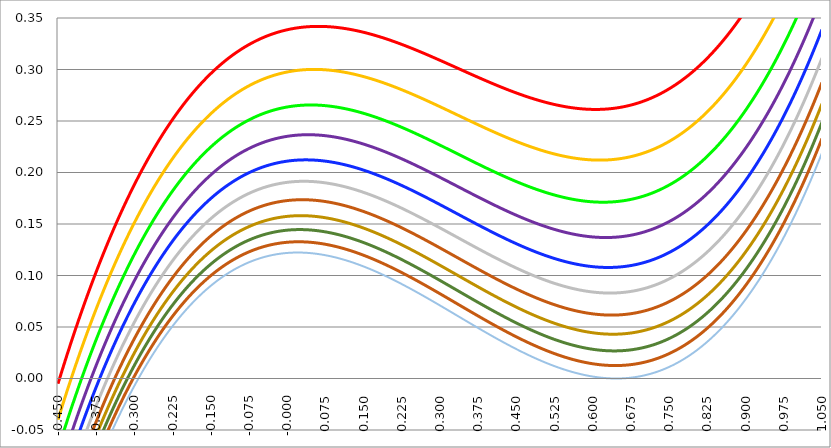
| Category | Series 1 | Series 0 | Series 3 | Series 4 | Series 5 | Series 2 | Series 6 | Series 7 | Series 8 | Series 9 | Series 10 |
|---|---|---|---|---|---|---|---|---|---|---|---|
| -0.45 | -0.005 | -0.04 | -0.069 | -0.093 | -0.114 | -0.131 | -0.146 | -0.159 | -0.171 | -0.181 | -0.19 |
| -0.44925 | -0.004 | -0.039 | -0.068 | -0.092 | -0.113 | -0.13 | -0.145 | -0.158 | -0.17 | -0.18 | -0.189 |
| -0.4485 | -0.003 | -0.038 | -0.067 | -0.091 | -0.111 | -0.129 | -0.144 | -0.157 | -0.169 | -0.179 | -0.187 |
| -0.44775 | -0.001 | -0.036 | -0.065 | -0.09 | -0.11 | -0.128 | -0.143 | -0.156 | -0.167 | -0.177 | -0.186 |
| -0.447 | 0 | -0.035 | -0.064 | -0.088 | -0.109 | -0.127 | -0.142 | -0.155 | -0.166 | -0.176 | -0.185 |
| -0.44625 | 0.001 | -0.034 | -0.063 | -0.087 | -0.108 | -0.125 | -0.141 | -0.154 | -0.165 | -0.175 | -0.184 |
| -0.4455 | 0.002 | -0.033 | -0.062 | -0.086 | -0.107 | -0.124 | -0.139 | -0.153 | -0.164 | -0.174 | -0.183 |
| -0.44475 | 0.003 | -0.032 | -0.061 | -0.085 | -0.106 | -0.123 | -0.138 | -0.151 | -0.163 | -0.173 | -0.182 |
| -0.444 | 0.005 | -0.03 | -0.059 | -0.084 | -0.104 | -0.122 | -0.137 | -0.15 | -0.162 | -0.172 | -0.181 |
| -0.44325 | 0.006 | -0.029 | -0.058 | -0.083 | -0.103 | -0.121 | -0.136 | -0.149 | -0.16 | -0.171 | -0.179 |
| -0.4425 | 0.007 | -0.028 | -0.057 | -0.081 | -0.102 | -0.12 | -0.135 | -0.148 | -0.159 | -0.169 | -0.178 |
| -0.44175 | 0.008 | -0.027 | -0.056 | -0.08 | -0.101 | -0.119 | -0.134 | -0.147 | -0.158 | -0.168 | -0.177 |
| -0.441 | 0.009 | -0.026 | -0.055 | -0.079 | -0.1 | -0.117 | -0.133 | -0.146 | -0.157 | -0.167 | -0.176 |
| -0.44025 | 0.011 | -0.025 | -0.054 | -0.078 | -0.099 | -0.116 | -0.131 | -0.144 | -0.156 | -0.166 | -0.175 |
| -0.4395 | 0.012 | -0.023 | -0.052 | -0.077 | -0.097 | -0.115 | -0.13 | -0.143 | -0.155 | -0.165 | -0.174 |
| -0.43875 | 0.013 | -0.022 | -0.051 | -0.076 | -0.096 | -0.114 | -0.129 | -0.142 | -0.154 | -0.164 | -0.173 |
| -0.438 | 0.014 | -0.021 | -0.05 | -0.075 | -0.095 | -0.113 | -0.128 | -0.141 | -0.153 | -0.163 | -0.172 |
| -0.43725 | 0.015 | -0.02 | -0.049 | -0.073 | -0.094 | -0.112 | -0.127 | -0.14 | -0.151 | -0.162 | -0.17 |
| -0.4365 | 0.016 | -0.019 | -0.048 | -0.072 | -0.093 | -0.111 | -0.126 | -0.139 | -0.15 | -0.16 | -0.169 |
| -0.43575 | 0.018 | -0.018 | -0.047 | -0.071 | -0.092 | -0.109 | -0.125 | -0.138 | -0.149 | -0.159 | -0.168 |
| -0.435000000000001 | 0.019 | -0.016 | -0.046 | -0.07 | -0.091 | -0.108 | -0.123 | -0.137 | -0.148 | -0.158 | -0.167 |
| -0.434250000000001 | 0.02 | -0.015 | -0.044 | -0.069 | -0.09 | -0.107 | -0.122 | -0.135 | -0.147 | -0.157 | -0.166 |
| -0.433500000000001 | 0.021 | -0.014 | -0.043 | -0.068 | -0.088 | -0.106 | -0.121 | -0.134 | -0.146 | -0.156 | -0.165 |
| -0.432750000000001 | 0.022 | -0.013 | -0.042 | -0.067 | -0.087 | -0.105 | -0.12 | -0.133 | -0.145 | -0.155 | -0.164 |
| -0.432000000000001 | 0.023 | -0.012 | -0.041 | -0.065 | -0.086 | -0.104 | -0.119 | -0.132 | -0.144 | -0.154 | -0.163 |
| -0.431250000000001 | 0.024 | -0.011 | -0.04 | -0.064 | -0.085 | -0.103 | -0.118 | -0.131 | -0.143 | -0.153 | -0.162 |
| -0.430500000000001 | 0.026 | -0.01 | -0.039 | -0.063 | -0.084 | -0.102 | -0.117 | -0.13 | -0.141 | -0.152 | -0.16 |
| -0.429750000000001 | 0.027 | -0.008 | -0.038 | -0.062 | -0.083 | -0.1 | -0.116 | -0.129 | -0.14 | -0.15 | -0.159 |
| -0.429000000000001 | 0.028 | -0.007 | -0.037 | -0.061 | -0.082 | -0.099 | -0.115 | -0.128 | -0.139 | -0.149 | -0.158 |
| -0.428250000000001 | 0.029 | -0.006 | -0.035 | -0.06 | -0.081 | -0.098 | -0.113 | -0.127 | -0.138 | -0.148 | -0.157 |
| -0.427500000000001 | 0.03 | -0.005 | -0.034 | -0.059 | -0.079 | -0.097 | -0.112 | -0.126 | -0.137 | -0.147 | -0.156 |
| -0.426750000000001 | 0.031 | -0.004 | -0.033 | -0.058 | -0.078 | -0.096 | -0.111 | -0.124 | -0.136 | -0.146 | -0.155 |
| -0.426000000000001 | 0.032 | -0.003 | -0.032 | -0.057 | -0.077 | -0.095 | -0.11 | -0.123 | -0.135 | -0.145 | -0.154 |
| -0.425250000000001 | 0.034 | -0.002 | -0.031 | -0.055 | -0.076 | -0.094 | -0.109 | -0.122 | -0.134 | -0.144 | -0.153 |
| -0.424500000000001 | 0.035 | -0.001 | -0.03 | -0.054 | -0.075 | -0.093 | -0.108 | -0.121 | -0.133 | -0.143 | -0.152 |
| -0.423750000000001 | 0.036 | 0.001 | -0.029 | -0.053 | -0.074 | -0.092 | -0.107 | -0.12 | -0.132 | -0.142 | -0.151 |
| -0.423000000000001 | 0.037 | 0.002 | -0.028 | -0.052 | -0.073 | -0.091 | -0.106 | -0.119 | -0.131 | -0.141 | -0.15 |
| -0.422250000000001 | 0.038 | 0.003 | -0.027 | -0.051 | -0.072 | -0.09 | -0.105 | -0.118 | -0.13 | -0.14 | -0.149 |
| -0.421500000000001 | 0.039 | 0.004 | -0.025 | -0.05 | -0.071 | -0.088 | -0.104 | -0.117 | -0.128 | -0.139 | -0.148 |
| -0.420750000000001 | 0.04 | 0.005 | -0.024 | -0.049 | -0.07 | -0.087 | -0.103 | -0.116 | -0.127 | -0.138 | -0.146 |
| -0.420000000000001 | 0.041 | 0.006 | -0.023 | -0.048 | -0.069 | -0.086 | -0.102 | -0.115 | -0.126 | -0.136 | -0.145 |
| -0.419250000000001 | 0.043 | 0.007 | -0.022 | -0.047 | -0.067 | -0.085 | -0.1 | -0.114 | -0.125 | -0.135 | -0.144 |
| -0.418500000000001 | 0.044 | 0.008 | -0.021 | -0.046 | -0.066 | -0.084 | -0.099 | -0.113 | -0.124 | -0.134 | -0.143 |
| -0.417750000000001 | 0.045 | 0.009 | -0.02 | -0.045 | -0.065 | -0.083 | -0.098 | -0.112 | -0.123 | -0.133 | -0.142 |
| -0.417000000000001 | 0.046 | 0.01 | -0.019 | -0.043 | -0.064 | -0.082 | -0.097 | -0.111 | -0.122 | -0.132 | -0.141 |
| -0.416250000000001 | 0.047 | 0.012 | -0.018 | -0.042 | -0.063 | -0.081 | -0.096 | -0.109 | -0.121 | -0.131 | -0.14 |
| -0.415500000000001 | 0.048 | 0.013 | -0.017 | -0.041 | -0.062 | -0.08 | -0.095 | -0.108 | -0.12 | -0.13 | -0.139 |
| -0.414750000000001 | 0.049 | 0.014 | -0.016 | -0.04 | -0.061 | -0.079 | -0.094 | -0.107 | -0.119 | -0.129 | -0.138 |
| -0.414000000000001 | 0.05 | 0.015 | -0.015 | -0.039 | -0.06 | -0.078 | -0.093 | -0.106 | -0.118 | -0.128 | -0.137 |
| -0.413250000000001 | 0.051 | 0.016 | -0.013 | -0.038 | -0.059 | -0.077 | -0.092 | -0.105 | -0.117 | -0.127 | -0.136 |
| -0.412500000000001 | 0.052 | 0.017 | -0.012 | -0.037 | -0.058 | -0.076 | -0.091 | -0.104 | -0.116 | -0.126 | -0.135 |
| -0.411750000000001 | 0.053 | 0.018 | -0.011 | -0.036 | -0.057 | -0.075 | -0.09 | -0.103 | -0.115 | -0.125 | -0.134 |
| -0.411000000000001 | 0.055 | 0.019 | -0.01 | -0.035 | -0.056 | -0.074 | -0.089 | -0.102 | -0.114 | -0.124 | -0.133 |
| -0.410250000000001 | 0.056 | 0.02 | -0.009 | -0.034 | -0.055 | -0.073 | -0.088 | -0.101 | -0.113 | -0.123 | -0.132 |
| -0.409500000000001 | 0.057 | 0.021 | -0.008 | -0.033 | -0.054 | -0.072 | -0.087 | -0.1 | -0.112 | -0.122 | -0.131 |
| -0.408750000000001 | 0.058 | 0.022 | -0.007 | -0.032 | -0.053 | -0.07 | -0.086 | -0.099 | -0.111 | -0.121 | -0.13 |
| -0.408000000000002 | 0.059 | 0.023 | -0.006 | -0.031 | -0.052 | -0.069 | -0.085 | -0.098 | -0.11 | -0.12 | -0.129 |
| -0.407250000000002 | 0.06 | 0.024 | -0.005 | -0.03 | -0.051 | -0.068 | -0.084 | -0.097 | -0.109 | -0.119 | -0.128 |
| -0.406500000000002 | 0.061 | 0.025 | -0.004 | -0.029 | -0.05 | -0.067 | -0.083 | -0.096 | -0.108 | -0.118 | -0.127 |
| -0.405750000000002 | 0.062 | 0.027 | -0.003 | -0.028 | -0.049 | -0.066 | -0.082 | -0.095 | -0.107 | -0.117 | -0.126 |
| -0.405000000000002 | 0.063 | 0.028 | -0.002 | -0.027 | -0.047 | -0.065 | -0.081 | -0.094 | -0.106 | -0.116 | -0.125 |
| -0.404250000000002 | 0.064 | 0.029 | -0.001 | -0.026 | -0.046 | -0.064 | -0.08 | -0.093 | -0.105 | -0.115 | -0.124 |
| -0.403500000000002 | 0.065 | 0.03 | 0 | -0.025 | -0.045 | -0.063 | -0.079 | -0.092 | -0.104 | -0.114 | -0.123 |
| -0.402750000000002 | 0.066 | 0.031 | 0.001 | -0.023 | -0.044 | -0.062 | -0.078 | -0.091 | -0.103 | -0.113 | -0.122 |
| -0.402000000000002 | 0.067 | 0.032 | 0.002 | -0.022 | -0.043 | -0.061 | -0.077 | -0.09 | -0.102 | -0.112 | -0.121 |
| -0.401250000000002 | 0.068 | 0.033 | 0.003 | -0.021 | -0.042 | -0.06 | -0.076 | -0.089 | -0.101 | -0.111 | -0.12 |
| -0.400500000000002 | 0.069 | 0.034 | 0.004 | -0.02 | -0.041 | -0.059 | -0.075 | -0.088 | -0.1 | -0.11 | -0.119 |
| -0.399750000000002 | 0.07 | 0.035 | 0.005 | -0.019 | -0.04 | -0.058 | -0.074 | -0.087 | -0.099 | -0.109 | -0.118 |
| -0.399000000000002 | 0.072 | 0.036 | 0.006 | -0.018 | -0.039 | -0.057 | -0.073 | -0.086 | -0.098 | -0.108 | -0.117 |
| -0.398250000000002 | 0.073 | 0.037 | 0.007 | -0.017 | -0.038 | -0.056 | -0.072 | -0.085 | -0.097 | -0.107 | -0.116 |
| -0.397500000000002 | 0.074 | 0.038 | 0.008 | -0.016 | -0.037 | -0.055 | -0.071 | -0.084 | -0.096 | -0.106 | -0.115 |
| -0.396750000000002 | 0.075 | 0.039 | 0.009 | -0.015 | -0.036 | -0.054 | -0.07 | -0.083 | -0.095 | -0.105 | -0.114 |
| -0.396000000000002 | 0.076 | 0.04 | 0.01 | -0.014 | -0.035 | -0.053 | -0.069 | -0.082 | -0.094 | -0.104 | -0.113 |
| -0.395250000000002 | 0.077 | 0.041 | 0.011 | -0.013 | -0.034 | -0.052 | -0.068 | -0.081 | -0.093 | -0.103 | -0.112 |
| -0.394500000000002 | 0.078 | 0.042 | 0.012 | -0.012 | -0.033 | -0.051 | -0.067 | -0.08 | -0.092 | -0.102 | -0.111 |
| -0.393750000000002 | 0.079 | 0.043 | 0.013 | -0.011 | -0.032 | -0.05 | -0.066 | -0.079 | -0.091 | -0.101 | -0.11 |
| -0.393000000000002 | 0.08 | 0.044 | 0.014 | -0.01 | -0.031 | -0.049 | -0.065 | -0.078 | -0.09 | -0.1 | -0.109 |
| -0.392250000000002 | 0.081 | 0.045 | 0.015 | -0.009 | -0.03 | -0.048 | -0.064 | -0.077 | -0.089 | -0.099 | -0.108 |
| -0.391500000000002 | 0.082 | 0.046 | 0.016 | -0.008 | -0.029 | -0.047 | -0.063 | -0.076 | -0.088 | -0.098 | -0.107 |
| -0.390750000000002 | 0.083 | 0.047 | 0.017 | -0.007 | -0.028 | -0.046 | -0.062 | -0.075 | -0.087 | -0.097 | -0.106 |
| -0.390000000000002 | 0.084 | 0.048 | 0.018 | -0.006 | -0.027 | -0.045 | -0.061 | -0.074 | -0.086 | -0.096 | -0.105 |
| -0.389250000000002 | 0.085 | 0.049 | 0.019 | -0.005 | -0.026 | -0.044 | -0.06 | -0.073 | -0.085 | -0.095 | -0.104 |
| -0.388500000000002 | 0.086 | 0.05 | 0.02 | -0.004 | -0.025 | -0.043 | -0.059 | -0.072 | -0.084 | -0.094 | -0.103 |
| -0.387750000000002 | 0.087 | 0.051 | 0.021 | -0.003 | -0.024 | -0.042 | -0.058 | -0.071 | -0.083 | -0.093 | -0.102 |
| -0.387000000000002 | 0.088 | 0.052 | 0.022 | -0.002 | -0.024 | -0.041 | -0.057 | -0.07 | -0.082 | -0.092 | -0.101 |
| -0.386250000000002 | 0.089 | 0.053 | 0.023 | -0.001 | -0.023 | -0.041 | -0.056 | -0.069 | -0.081 | -0.091 | -0.1 |
| -0.385500000000002 | 0.09 | 0.054 | 0.024 | -0.001 | -0.022 | -0.04 | -0.055 | -0.068 | -0.08 | -0.09 | -0.099 |
| -0.384750000000002 | 0.091 | 0.055 | 0.025 | 0 | -0.021 | -0.039 | -0.054 | -0.067 | -0.079 | -0.089 | -0.098 |
| -0.384000000000002 | 0.092 | 0.056 | 0.026 | 0.001 | -0.02 | -0.038 | -0.053 | -0.067 | -0.078 | -0.088 | -0.098 |
| -0.383250000000002 | 0.093 | 0.057 | 0.027 | 0.002 | -0.019 | -0.037 | -0.052 | -0.066 | -0.077 | -0.088 | -0.097 |
| -0.382500000000002 | 0.094 | 0.058 | 0.028 | 0.003 | -0.018 | -0.036 | -0.051 | -0.065 | -0.076 | -0.087 | -0.096 |
| -0.381750000000002 | 0.095 | 0.059 | 0.029 | 0.004 | -0.017 | -0.035 | -0.05 | -0.064 | -0.075 | -0.086 | -0.095 |
| -0.381000000000002 | 0.096 | 0.06 | 0.03 | 0.005 | -0.016 | -0.034 | -0.049 | -0.063 | -0.074 | -0.085 | -0.094 |
| -0.380250000000002 | 0.097 | 0.061 | 0.031 | 0.006 | -0.015 | -0.033 | -0.048 | -0.062 | -0.074 | -0.084 | -0.093 |
| -0.379500000000003 | 0.098 | 0.062 | 0.032 | 0.007 | -0.014 | -0.032 | -0.047 | -0.061 | -0.073 | -0.083 | -0.092 |
| -0.378750000000003 | 0.099 | 0.063 | 0.033 | 0.008 | -0.013 | -0.031 | -0.047 | -0.06 | -0.072 | -0.082 | -0.091 |
| -0.378000000000003 | 0.1 | 0.064 | 0.034 | 0.009 | -0.012 | -0.03 | -0.046 | -0.059 | -0.071 | -0.081 | -0.09 |
| -0.377250000000003 | 0.101 | 0.065 | 0.035 | 0.01 | -0.011 | -0.029 | -0.045 | -0.058 | -0.07 | -0.08 | -0.089 |
| -0.376500000000003 | 0.102 | 0.066 | 0.036 | 0.011 | -0.01 | -0.028 | -0.044 | -0.057 | -0.069 | -0.079 | -0.088 |
| -0.375750000000003 | 0.103 | 0.067 | 0.037 | 0.012 | -0.009 | -0.027 | -0.043 | -0.056 | -0.068 | -0.078 | -0.087 |
| -0.375000000000003 | 0.104 | 0.068 | 0.038 | 0.013 | -0.008 | -0.026 | -0.042 | -0.055 | -0.067 | -0.077 | -0.086 |
| -0.374250000000003 | 0.105 | 0.069 | 0.039 | 0.014 | -0.007 | -0.025 | -0.041 | -0.054 | -0.066 | -0.076 | -0.086 |
| -0.373500000000003 | 0.105 | 0.07 | 0.04 | 0.015 | -0.006 | -0.024 | -0.04 | -0.053 | -0.065 | -0.076 | -0.085 |
| -0.372750000000003 | 0.106 | 0.07 | 0.041 | 0.016 | -0.006 | -0.024 | -0.039 | -0.053 | -0.064 | -0.075 | -0.084 |
| -0.372000000000003 | 0.107 | 0.071 | 0.042 | 0.017 | -0.005 | -0.023 | -0.038 | -0.052 | -0.063 | -0.074 | -0.083 |
| -0.371250000000003 | 0.108 | 0.072 | 0.042 | 0.017 | -0.004 | -0.022 | -0.037 | -0.051 | -0.063 | -0.073 | -0.082 |
| -0.370500000000003 | 0.109 | 0.073 | 0.043 | 0.018 | -0.003 | -0.021 | -0.036 | -0.05 | -0.062 | -0.072 | -0.081 |
| -0.369750000000003 | 0.11 | 0.074 | 0.044 | 0.019 | -0.002 | -0.02 | -0.035 | -0.049 | -0.061 | -0.071 | -0.08 |
| -0.369000000000003 | 0.111 | 0.075 | 0.045 | 0.02 | -0.001 | -0.019 | -0.035 | -0.048 | -0.06 | -0.07 | -0.079 |
| -0.368250000000003 | 0.112 | 0.076 | 0.046 | 0.021 | 0 | -0.018 | -0.034 | -0.047 | -0.059 | -0.069 | -0.078 |
| -0.367500000000003 | 0.113 | 0.077 | 0.047 | 0.022 | 0.001 | -0.017 | -0.033 | -0.046 | -0.058 | -0.068 | -0.077 |
| -0.366750000000003 | 0.114 | 0.078 | 0.048 | 0.023 | 0.002 | -0.016 | -0.032 | -0.045 | -0.057 | -0.067 | -0.077 |
| -0.366000000000003 | 0.115 | 0.079 | 0.049 | 0.024 | 0.003 | -0.015 | -0.031 | -0.044 | -0.056 | -0.067 | -0.076 |
| -0.365250000000003 | 0.116 | 0.08 | 0.05 | 0.025 | 0.004 | -0.015 | -0.03 | -0.044 | -0.055 | -0.066 | -0.075 |
| -0.364500000000003 | 0.117 | 0.081 | 0.051 | 0.026 | 0.004 | -0.014 | -0.029 | -0.043 | -0.055 | -0.065 | -0.074 |
| -0.363750000000003 | 0.118 | 0.082 | 0.052 | 0.027 | 0.005 | -0.013 | -0.028 | -0.042 | -0.054 | -0.064 | -0.073 |
| -0.363000000000003 | 0.119 | 0.083 | 0.053 | 0.028 | 0.006 | -0.012 | -0.027 | -0.041 | -0.053 | -0.063 | -0.072 |
| -0.362250000000003 | 0.12 | 0.083 | 0.054 | 0.028 | 0.007 | -0.011 | -0.027 | -0.04 | -0.052 | -0.062 | -0.071 |
| -0.361500000000003 | 0.12 | 0.084 | 0.054 | 0.029 | 0.008 | -0.01 | -0.026 | -0.039 | -0.051 | -0.061 | -0.07 |
| -0.360750000000003 | 0.121 | 0.085 | 0.055 | 0.03 | 0.009 | -0.009 | -0.025 | -0.038 | -0.05 | -0.06 | -0.07 |
| -0.360000000000003 | 0.122 | 0.086 | 0.056 | 0.031 | 0.01 | -0.008 | -0.024 | -0.037 | -0.049 | -0.06 | -0.069 |
| -0.359250000000003 | 0.123 | 0.087 | 0.057 | 0.032 | 0.011 | -0.007 | -0.023 | -0.037 | -0.048 | -0.059 | -0.068 |
| -0.358500000000003 | 0.124 | 0.088 | 0.058 | 0.033 | 0.012 | -0.007 | -0.022 | -0.036 | -0.048 | -0.058 | -0.067 |
| -0.357750000000003 | 0.125 | 0.089 | 0.059 | 0.034 | 0.012 | -0.006 | -0.021 | -0.035 | -0.047 | -0.057 | -0.066 |
| -0.357000000000003 | 0.126 | 0.09 | 0.06 | 0.035 | 0.013 | -0.005 | -0.02 | -0.034 | -0.046 | -0.056 | -0.065 |
| -0.356250000000003 | 0.127 | 0.091 | 0.061 | 0.036 | 0.014 | -0.004 | -0.02 | -0.033 | -0.045 | -0.055 | -0.064 |
| -0.355500000000003 | 0.128 | 0.092 | 0.062 | 0.036 | 0.015 | -0.003 | -0.019 | -0.032 | -0.044 | -0.054 | -0.064 |
| -0.354750000000003 | 0.129 | 0.092 | 0.062 | 0.037 | 0.016 | -0.002 | -0.018 | -0.031 | -0.043 | -0.054 | -0.063 |
| -0.354000000000003 | 0.13 | 0.093 | 0.063 | 0.038 | 0.017 | -0.001 | -0.017 | -0.031 | -0.042 | -0.053 | -0.062 |
| -0.353250000000003 | 0.13 | 0.094 | 0.064 | 0.039 | 0.018 | 0 | -0.016 | -0.03 | -0.042 | -0.052 | -0.061 |
| -0.352500000000003 | 0.131 | 0.095 | 0.065 | 0.04 | 0.019 | 0 | -0.015 | -0.029 | -0.041 | -0.051 | -0.06 |
| -0.351750000000004 | 0.132 | 0.096 | 0.066 | 0.041 | 0.019 | 0.001 | -0.014 | -0.028 | -0.04 | -0.05 | -0.059 |
| -0.351000000000004 | 0.133 | 0.097 | 0.067 | 0.042 | 0.02 | 0.002 | -0.014 | -0.027 | -0.039 | -0.049 | -0.059 |
| -0.350250000000004 | 0.134 | 0.098 | 0.068 | 0.042 | 0.021 | 0.003 | -0.013 | -0.026 | -0.038 | -0.049 | -0.058 |
| -0.349500000000004 | 0.135 | 0.099 | 0.069 | 0.043 | 0.022 | 0.004 | -0.012 | -0.025 | -0.037 | -0.048 | -0.057 |
| -0.348750000000004 | 0.136 | 0.099 | 0.069 | 0.044 | 0.023 | 0.005 | -0.011 | -0.025 | -0.037 | -0.047 | -0.056 |
| -0.348000000000004 | 0.137 | 0.1 | 0.07 | 0.045 | 0.024 | 0.005 | -0.01 | -0.024 | -0.036 | -0.046 | -0.055 |
| -0.347250000000004 | 0.138 | 0.101 | 0.071 | 0.046 | 0.025 | 0.006 | -0.009 | -0.023 | -0.035 | -0.045 | -0.054 |
| -0.346500000000004 | 0.138 | 0.102 | 0.072 | 0.047 | 0.025 | 0.007 | -0.009 | -0.022 | -0.034 | -0.044 | -0.054 |
| -0.345750000000004 | 0.139 | 0.103 | 0.073 | 0.048 | 0.026 | 0.008 | -0.008 | -0.021 | -0.033 | -0.044 | -0.053 |
| -0.345000000000004 | 0.14 | 0.104 | 0.074 | 0.048 | 0.027 | 0.009 | -0.007 | -0.021 | -0.032 | -0.043 | -0.052 |
| -0.344250000000004 | 0.141 | 0.105 | 0.075 | 0.049 | 0.028 | 0.01 | -0.006 | -0.02 | -0.032 | -0.042 | -0.051 |
| -0.343500000000004 | 0.142 | 0.106 | 0.075 | 0.05 | 0.029 | 0.01 | -0.005 | -0.019 | -0.031 | -0.041 | -0.05 |
| -0.342750000000004 | 0.143 | 0.106 | 0.076 | 0.051 | 0.03 | 0.011 | -0.004 | -0.018 | -0.03 | -0.04 | -0.05 |
| -0.342000000000004 | 0.144 | 0.107 | 0.077 | 0.052 | 0.03 | 0.012 | -0.004 | -0.017 | -0.029 | -0.04 | -0.049 |
| -0.341250000000004 | 0.144 | 0.108 | 0.078 | 0.053 | 0.031 | 0.013 | -0.003 | -0.016 | -0.028 | -0.039 | -0.048 |
| -0.340500000000004 | 0.145 | 0.109 | 0.079 | 0.053 | 0.032 | 0.014 | -0.002 | -0.016 | -0.027 | -0.038 | -0.047 |
| -0.339750000000004 | 0.146 | 0.11 | 0.08 | 0.054 | 0.033 | 0.015 | -0.001 | -0.015 | -0.027 | -0.037 | -0.046 |
| -0.339000000000004 | 0.147 | 0.111 | 0.08 | 0.055 | 0.034 | 0.015 | 0 | -0.014 | -0.026 | -0.036 | -0.046 |
| -0.338250000000004 | 0.148 | 0.111 | 0.081 | 0.056 | 0.034 | 0.016 | 0 | -0.013 | -0.025 | -0.036 | -0.045 |
| -0.337500000000004 | 0.149 | 0.112 | 0.082 | 0.057 | 0.035 | 0.017 | 0.001 | -0.012 | -0.024 | -0.035 | -0.044 |
| -0.336750000000004 | 0.15 | 0.113 | 0.083 | 0.058 | 0.036 | 0.018 | 0.002 | -0.012 | -0.023 | -0.034 | -0.043 |
| -0.336000000000004 | 0.15 | 0.114 | 0.084 | 0.058 | 0.037 | 0.019 | 0.003 | -0.011 | -0.023 | -0.033 | -0.042 |
| -0.335250000000004 | 0.151 | 0.115 | 0.085 | 0.059 | 0.038 | 0.019 | 0.004 | -0.01 | -0.022 | -0.032 | -0.042 |
| -0.334500000000004 | 0.152 | 0.116 | 0.085 | 0.06 | 0.039 | 0.02 | 0.004 | -0.009 | -0.021 | -0.032 | -0.041 |
| -0.333750000000004 | 0.153 | 0.116 | 0.086 | 0.061 | 0.039 | 0.021 | 0.005 | -0.008 | -0.02 | -0.031 | -0.04 |
| -0.333000000000004 | 0.154 | 0.117 | 0.087 | 0.062 | 0.04 | 0.022 | 0.006 | -0.008 | -0.02 | -0.03 | -0.039 |
| -0.332250000000004 | 0.155 | 0.118 | 0.088 | 0.062 | 0.041 | 0.023 | 0.007 | -0.007 | -0.019 | -0.029 | -0.038 |
| -0.331500000000004 | 0.155 | 0.119 | 0.089 | 0.063 | 0.042 | 0.023 | 0.008 | -0.006 | -0.018 | -0.028 | -0.038 |
| -0.330750000000004 | 0.156 | 0.12 | 0.089 | 0.064 | 0.043 | 0.024 | 0.008 | -0.005 | -0.017 | -0.028 | -0.037 |
| -0.330000000000004 | 0.157 | 0.121 | 0.09 | 0.065 | 0.043 | 0.025 | 0.009 | -0.004 | -0.016 | -0.027 | -0.036 |
| -0.329250000000004 | 0.158 | 0.121 | 0.091 | 0.066 | 0.044 | 0.026 | 0.01 | -0.004 | -0.016 | -0.026 | -0.035 |
| -0.328500000000004 | 0.159 | 0.122 | 0.092 | 0.066 | 0.045 | 0.027 | 0.011 | -0.003 | -0.015 | -0.025 | -0.035 |
| -0.327750000000004 | 0.16 | 0.123 | 0.093 | 0.067 | 0.046 | 0.027 | 0.012 | -0.002 | -0.014 | -0.025 | -0.034 |
| -0.327000000000004 | 0.16 | 0.124 | 0.093 | 0.068 | 0.046 | 0.028 | 0.012 | -0.001 | -0.013 | -0.024 | -0.033 |
| -0.326250000000004 | 0.161 | 0.125 | 0.094 | 0.069 | 0.047 | 0.029 | 0.013 | -0.001 | -0.013 | -0.023 | -0.032 |
| -0.325500000000004 | 0.162 | 0.125 | 0.095 | 0.07 | 0.048 | 0.03 | 0.014 | 0 | -0.012 | -0.022 | -0.032 |
| -0.324750000000004 | 0.163 | 0.126 | 0.096 | 0.07 | 0.049 | 0.03 | 0.015 | 0.001 | -0.011 | -0.022 | -0.031 |
| -0.324000000000005 | 0.164 | 0.127 | 0.097 | 0.071 | 0.05 | 0.031 | 0.015 | 0.002 | -0.01 | -0.021 | -0.03 |
| -0.323250000000005 | 0.164 | 0.128 | 0.097 | 0.072 | 0.05 | 0.032 | 0.016 | 0.002 | -0.01 | -0.02 | -0.029 |
| -0.322500000000005 | 0.165 | 0.129 | 0.098 | 0.073 | 0.051 | 0.033 | 0.017 | 0.003 | -0.009 | -0.019 | -0.029 |
| -0.321750000000005 | 0.166 | 0.129 | 0.099 | 0.073 | 0.052 | 0.034 | 0.018 | 0.004 | -0.008 | -0.019 | -0.028 |
| -0.321000000000005 | 0.167 | 0.13 | 0.1 | 0.074 | 0.053 | 0.034 | 0.018 | 0.005 | -0.007 | -0.018 | -0.027 |
| -0.320250000000005 | 0.168 | 0.131 | 0.1 | 0.075 | 0.053 | 0.035 | 0.019 | 0.005 | -0.007 | -0.017 | -0.026 |
| -0.319500000000005 | 0.168 | 0.132 | 0.101 | 0.076 | 0.054 | 0.036 | 0.02 | 0.006 | -0.006 | -0.016 | -0.026 |
| -0.318750000000005 | 0.169 | 0.132 | 0.102 | 0.077 | 0.055 | 0.037 | 0.021 | 0.007 | -0.005 | -0.016 | -0.025 |
| -0.318000000000005 | 0.17 | 0.133 | 0.103 | 0.077 | 0.056 | 0.037 | 0.021 | 0.008 | -0.004 | -0.015 | -0.024 |
| -0.317250000000005 | 0.171 | 0.134 | 0.104 | 0.078 | 0.056 | 0.038 | 0.022 | 0.008 | -0.004 | -0.014 | -0.023 |
| -0.316500000000005 | 0.172 | 0.135 | 0.104 | 0.079 | 0.057 | 0.039 | 0.023 | 0.009 | -0.003 | -0.013 | -0.023 |
| -0.315750000000005 | 0.172 | 0.136 | 0.105 | 0.08 | 0.058 | 0.04 | 0.024 | 0.01 | -0.002 | -0.013 | -0.022 |
| -0.315000000000005 | 0.173 | 0.136 | 0.106 | 0.08 | 0.059 | 0.04 | 0.024 | 0.011 | -0.001 | -0.012 | -0.021 |
| -0.314250000000005 | 0.174 | 0.137 | 0.107 | 0.081 | 0.059 | 0.041 | 0.025 | 0.011 | -0.001 | -0.011 | -0.02 |
| -0.313500000000005 | 0.175 | 0.138 | 0.107 | 0.082 | 0.06 | 0.042 | 0.026 | 0.012 | 0 | -0.01 | -0.02 |
| -0.312750000000005 | 0.175 | 0.139 | 0.108 | 0.083 | 0.061 | 0.043 | 0.027 | 0.013 | 0.001 | -0.01 | -0.019 |
| -0.312000000000005 | 0.176 | 0.139 | 0.109 | 0.083 | 0.062 | 0.043 | 0.027 | 0.014 | 0.002 | -0.009 | -0.018 |
| -0.311250000000005 | 0.177 | 0.14 | 0.11 | 0.084 | 0.062 | 0.044 | 0.028 | 0.014 | 0.002 | -0.008 | -0.018 |
| -0.310500000000005 | 0.178 | 0.141 | 0.11 | 0.085 | 0.063 | 0.045 | 0.029 | 0.015 | 0.003 | -0.008 | -0.017 |
| -0.309750000000005 | 0.179 | 0.142 | 0.111 | 0.086 | 0.064 | 0.045 | 0.03 | 0.016 | 0.004 | -0.007 | -0.016 |
| -0.309000000000005 | 0.179 | 0.142 | 0.112 | 0.086 | 0.065 | 0.046 | 0.03 | 0.016 | 0.004 | -0.006 | -0.015 |
| -0.308250000000005 | 0.18 | 0.143 | 0.113 | 0.087 | 0.065 | 0.047 | 0.031 | 0.017 | 0.005 | -0.005 | -0.015 |
| -0.307500000000005 | 0.181 | 0.144 | 0.113 | 0.088 | 0.066 | 0.048 | 0.032 | 0.018 | 0.006 | -0.005 | -0.014 |
| -0.306750000000005 | 0.182 | 0.145 | 0.114 | 0.088 | 0.067 | 0.048 | 0.032 | 0.019 | 0.007 | -0.004 | -0.013 |
| -0.306000000000005 | 0.182 | 0.145 | 0.115 | 0.089 | 0.068 | 0.049 | 0.033 | 0.019 | 0.007 | -0.003 | -0.013 |
| -0.305250000000005 | 0.183 | 0.146 | 0.116 | 0.09 | 0.068 | 0.05 | 0.034 | 0.02 | 0.008 | -0.003 | -0.012 |
| -0.304500000000005 | 0.184 | 0.147 | 0.116 | 0.091 | 0.069 | 0.05 | 0.035 | 0.021 | 0.009 | -0.002 | -0.011 |
| -0.303750000000005 | 0.185 | 0.148 | 0.117 | 0.091 | 0.07 | 0.051 | 0.035 | 0.021 | 0.009 | -0.001 | -0.011 |
| -0.303000000000005 | 0.185 | 0.148 | 0.118 | 0.092 | 0.07 | 0.052 | 0.036 | 0.022 | 0.01 | -0.001 | -0.01 |
| -0.302250000000005 | 0.186 | 0.149 | 0.118 | 0.093 | 0.071 | 0.053 | 0.037 | 0.023 | 0.011 | 0 | -0.009 |
| -0.301500000000005 | 0.187 | 0.15 | 0.119 | 0.094 | 0.072 | 0.053 | 0.037 | 0.024 | 0.011 | 0.001 | -0.008 |
| -0.300750000000005 | 0.188 | 0.151 | 0.12 | 0.094 | 0.073 | 0.054 | 0.038 | 0.024 | 0.012 | 0.002 | -0.008 |
| -0.300000000000005 | 0.188 | 0.151 | 0.121 | 0.095 | 0.073 | 0.055 | 0.039 | 0.025 | 0.013 | 0.002 | -0.007 |
| -0.299250000000005 | 0.189 | 0.152 | 0.121 | 0.096 | 0.074 | 0.055 | 0.039 | 0.026 | 0.014 | 0.003 | -0.006 |
| -0.298500000000005 | 0.19 | 0.153 | 0.122 | 0.096 | 0.075 | 0.056 | 0.04 | 0.026 | 0.014 | 0.004 | -0.006 |
| -0.297750000000005 | 0.19 | 0.153 | 0.123 | 0.097 | 0.075 | 0.057 | 0.041 | 0.027 | 0.015 | 0.004 | -0.005 |
| -0.297000000000005 | 0.191 | 0.154 | 0.124 | 0.098 | 0.076 | 0.057 | 0.042 | 0.028 | 0.016 | 0.005 | -0.004 |
| -0.296250000000006 | 0.192 | 0.155 | 0.124 | 0.099 | 0.077 | 0.058 | 0.042 | 0.028 | 0.016 | 0.006 | -0.004 |
| -0.295500000000006 | 0.193 | 0.156 | 0.125 | 0.099 | 0.077 | 0.059 | 0.043 | 0.029 | 0.017 | 0.006 | -0.003 |
| -0.294750000000006 | 0.193 | 0.156 | 0.126 | 0.1 | 0.078 | 0.06 | 0.044 | 0.03 | 0.018 | 0.007 | -0.002 |
| -0.294000000000006 | 0.194 | 0.157 | 0.126 | 0.101 | 0.079 | 0.06 | 0.044 | 0.03 | 0.018 | 0.008 | -0.002 |
| -0.293250000000006 | 0.195 | 0.158 | 0.127 | 0.101 | 0.08 | 0.061 | 0.045 | 0.031 | 0.019 | 0.008 | -0.001 |
| -0.292500000000006 | 0.196 | 0.158 | 0.128 | 0.102 | 0.08 | 0.062 | 0.046 | 0.032 | 0.02 | 0.009 | 0 |
| -0.291750000000006 | 0.196 | 0.159 | 0.128 | 0.103 | 0.081 | 0.062 | 0.046 | 0.032 | 0.02 | 0.01 | 0 |
| -0.291000000000006 | 0.197 | 0.16 | 0.129 | 0.103 | 0.082 | 0.063 | 0.047 | 0.033 | 0.021 | 0.01 | 0.001 |
| -0.290250000000006 | 0.198 | 0.161 | 0.13 | 0.104 | 0.082 | 0.064 | 0.048 | 0.034 | 0.022 | 0.011 | 0.002 |
| -0.289500000000006 | 0.198 | 0.161 | 0.13 | 0.105 | 0.083 | 0.064 | 0.048 | 0.034 | 0.022 | 0.012 | 0.002 |
| -0.288750000000006 | 0.199 | 0.162 | 0.131 | 0.105 | 0.084 | 0.065 | 0.049 | 0.035 | 0.023 | 0.012 | 0.003 |
| -0.288000000000006 | 0.2 | 0.163 | 0.132 | 0.106 | 0.084 | 0.066 | 0.05 | 0.036 | 0.024 | 0.013 | 0.004 |
| -0.287250000000006 | 0.2 | 0.163 | 0.133 | 0.107 | 0.085 | 0.066 | 0.05 | 0.036 | 0.024 | 0.014 | 0.004 |
| -0.286500000000006 | 0.201 | 0.164 | 0.133 | 0.107 | 0.086 | 0.067 | 0.051 | 0.037 | 0.025 | 0.014 | 0.005 |
| -0.285750000000006 | 0.202 | 0.165 | 0.134 | 0.108 | 0.086 | 0.068 | 0.052 | 0.038 | 0.026 | 0.015 | 0.005 |
| -0.285000000000006 | 0.203 | 0.165 | 0.135 | 0.109 | 0.087 | 0.068 | 0.052 | 0.038 | 0.026 | 0.016 | 0.006 |
| -0.284250000000006 | 0.203 | 0.166 | 0.135 | 0.109 | 0.088 | 0.069 | 0.053 | 0.039 | 0.027 | 0.016 | 0.007 |
| -0.283500000000006 | 0.204 | 0.167 | 0.136 | 0.11 | 0.088 | 0.07 | 0.054 | 0.04 | 0.027 | 0.017 | 0.007 |
| -0.282750000000006 | 0.205 | 0.167 | 0.137 | 0.111 | 0.089 | 0.07 | 0.054 | 0.04 | 0.028 | 0.017 | 0.008 |
| -0.282000000000006 | 0.205 | 0.168 | 0.137 | 0.111 | 0.09 | 0.071 | 0.055 | 0.041 | 0.029 | 0.018 | 0.009 |
| -0.281250000000006 | 0.206 | 0.169 | 0.138 | 0.112 | 0.09 | 0.072 | 0.055 | 0.042 | 0.029 | 0.019 | 0.009 |
| -0.280500000000006 | 0.207 | 0.169 | 0.139 | 0.113 | 0.091 | 0.072 | 0.056 | 0.042 | 0.03 | 0.019 | 0.01 |
| -0.279750000000006 | 0.207 | 0.17 | 0.139 | 0.113 | 0.092 | 0.073 | 0.057 | 0.043 | 0.031 | 0.02 | 0.011 |
| -0.279000000000006 | 0.208 | 0.171 | 0.14 | 0.114 | 0.092 | 0.073 | 0.057 | 0.043 | 0.031 | 0.021 | 0.011 |
| -0.278250000000006 | 0.209 | 0.171 | 0.141 | 0.115 | 0.093 | 0.074 | 0.058 | 0.044 | 0.032 | 0.021 | 0.012 |
| -0.277500000000006 | 0.209 | 0.172 | 0.141 | 0.115 | 0.093 | 0.075 | 0.059 | 0.045 | 0.033 | 0.022 | 0.012 |
| -0.276750000000006 | 0.21 | 0.173 | 0.142 | 0.116 | 0.094 | 0.075 | 0.059 | 0.045 | 0.033 | 0.022 | 0.013 |
| -0.276000000000006 | 0.211 | 0.173 | 0.143 | 0.117 | 0.095 | 0.076 | 0.06 | 0.046 | 0.034 | 0.023 | 0.014 |
| -0.275250000000006 | 0.211 | 0.174 | 0.143 | 0.117 | 0.095 | 0.077 | 0.061 | 0.047 | 0.034 | 0.024 | 0.014 |
| -0.274500000000006 | 0.212 | 0.175 | 0.144 | 0.118 | 0.096 | 0.077 | 0.061 | 0.047 | 0.035 | 0.024 | 0.015 |
| -0.273750000000006 | 0.213 | 0.175 | 0.144 | 0.119 | 0.097 | 0.078 | 0.062 | 0.048 | 0.036 | 0.025 | 0.015 |
| -0.273000000000006 | 0.213 | 0.176 | 0.145 | 0.119 | 0.097 | 0.079 | 0.062 | 0.048 | 0.036 | 0.026 | 0.016 |
| -0.272250000000006 | 0.214 | 0.177 | 0.146 | 0.12 | 0.098 | 0.079 | 0.063 | 0.049 | 0.037 | 0.026 | 0.017 |
| -0.271500000000006 | 0.215 | 0.177 | 0.146 | 0.12 | 0.099 | 0.08 | 0.064 | 0.05 | 0.037 | 0.027 | 0.017 |
| -0.270750000000006 | 0.215 | 0.178 | 0.147 | 0.121 | 0.099 | 0.08 | 0.064 | 0.05 | 0.038 | 0.027 | 0.018 |
| -0.270000000000006 | 0.216 | 0.179 | 0.148 | 0.122 | 0.1 | 0.081 | 0.065 | 0.051 | 0.039 | 0.028 | 0.019 |
| -0.269250000000007 | 0.217 | 0.179 | 0.148 | 0.122 | 0.1 | 0.082 | 0.065 | 0.051 | 0.039 | 0.029 | 0.019 |
| -0.268500000000007 | 0.217 | 0.18 | 0.149 | 0.123 | 0.101 | 0.082 | 0.066 | 0.052 | 0.04 | 0.029 | 0.02 |
| -0.267750000000007 | 0.218 | 0.181 | 0.15 | 0.124 | 0.102 | 0.083 | 0.067 | 0.053 | 0.04 | 0.03 | 0.02 |
| -0.267000000000007 | 0.219 | 0.181 | 0.15 | 0.124 | 0.102 | 0.083 | 0.067 | 0.053 | 0.041 | 0.03 | 0.021 |
| -0.266250000000007 | 0.219 | 0.182 | 0.151 | 0.125 | 0.103 | 0.084 | 0.068 | 0.054 | 0.042 | 0.031 | 0.021 |
| -0.265500000000007 | 0.22 | 0.182 | 0.151 | 0.125 | 0.103 | 0.085 | 0.068 | 0.054 | 0.042 | 0.032 | 0.022 |
| -0.264750000000007 | 0.221 | 0.183 | 0.152 | 0.126 | 0.104 | 0.085 | 0.069 | 0.055 | 0.043 | 0.032 | 0.023 |
| -0.264000000000007 | 0.221 | 0.184 | 0.153 | 0.127 | 0.105 | 0.086 | 0.07 | 0.056 | 0.043 | 0.033 | 0.023 |
| -0.263250000000007 | 0.222 | 0.184 | 0.153 | 0.127 | 0.105 | 0.086 | 0.07 | 0.056 | 0.044 | 0.033 | 0.024 |
| -0.262500000000007 | 0.222 | 0.185 | 0.154 | 0.128 | 0.106 | 0.087 | 0.071 | 0.057 | 0.045 | 0.034 | 0.024 |
| -0.261750000000007 | 0.223 | 0.186 | 0.155 | 0.128 | 0.106 | 0.088 | 0.071 | 0.057 | 0.045 | 0.034 | 0.025 |
| -0.261000000000007 | 0.224 | 0.186 | 0.155 | 0.129 | 0.107 | 0.088 | 0.072 | 0.058 | 0.046 | 0.035 | 0.026 |
| -0.260250000000007 | 0.224 | 0.187 | 0.156 | 0.13 | 0.108 | 0.089 | 0.073 | 0.059 | 0.046 | 0.036 | 0.026 |
| -0.259500000000007 | 0.225 | 0.187 | 0.156 | 0.13 | 0.108 | 0.089 | 0.073 | 0.059 | 0.047 | 0.036 | 0.027 |
| -0.258750000000007 | 0.226 | 0.188 | 0.157 | 0.131 | 0.109 | 0.09 | 0.074 | 0.06 | 0.048 | 0.037 | 0.027 |
| -0.258000000000007 | 0.226 | 0.189 | 0.158 | 0.131 | 0.109 | 0.091 | 0.074 | 0.06 | 0.048 | 0.037 | 0.028 |
| -0.257250000000007 | 0.227 | 0.189 | 0.158 | 0.132 | 0.11 | 0.091 | 0.075 | 0.061 | 0.049 | 0.038 | 0.028 |
| -0.256500000000007 | 0.227 | 0.19 | 0.159 | 0.133 | 0.111 | 0.092 | 0.076 | 0.061 | 0.049 | 0.038 | 0.029 |
| -0.255750000000007 | 0.228 | 0.19 | 0.159 | 0.133 | 0.111 | 0.092 | 0.076 | 0.062 | 0.05 | 0.039 | 0.03 |
| -0.255000000000007 | 0.229 | 0.191 | 0.16 | 0.134 | 0.112 | 0.093 | 0.077 | 0.063 | 0.05 | 0.04 | 0.03 |
| -0.254250000000007 | 0.229 | 0.192 | 0.161 | 0.134 | 0.112 | 0.093 | 0.077 | 0.063 | 0.051 | 0.04 | 0.031 |
| -0.253500000000007 | 0.23 | 0.192 | 0.161 | 0.135 | 0.113 | 0.094 | 0.078 | 0.064 | 0.051 | 0.041 | 0.031 |
| -0.252750000000007 | 0.23 | 0.193 | 0.162 | 0.136 | 0.113 | 0.095 | 0.078 | 0.064 | 0.052 | 0.041 | 0.032 |
| -0.252000000000007 | 0.231 | 0.193 | 0.162 | 0.136 | 0.114 | 0.095 | 0.079 | 0.065 | 0.053 | 0.042 | 0.032 |
| -0.251250000000007 | 0.232 | 0.194 | 0.163 | 0.137 | 0.115 | 0.096 | 0.08 | 0.065 | 0.053 | 0.042 | 0.033 |
| -0.250500000000007 | 0.232 | 0.195 | 0.163 | 0.137 | 0.115 | 0.096 | 0.08 | 0.066 | 0.054 | 0.043 | 0.033 |
| -0.249750000000007 | 0.233 | 0.195 | 0.164 | 0.138 | 0.116 | 0.097 | 0.081 | 0.067 | 0.054 | 0.043 | 0.034 |
| -0.249000000000007 | 0.233 | 0.196 | 0.165 | 0.138 | 0.116 | 0.097 | 0.081 | 0.067 | 0.055 | 0.044 | 0.034 |
| -0.248250000000007 | 0.234 | 0.196 | 0.165 | 0.139 | 0.117 | 0.098 | 0.082 | 0.068 | 0.055 | 0.045 | 0.035 |
| -0.247500000000007 | 0.235 | 0.197 | 0.166 | 0.14 | 0.117 | 0.099 | 0.082 | 0.068 | 0.056 | 0.045 | 0.036 |
| -0.246750000000007 | 0.235 | 0.198 | 0.166 | 0.14 | 0.118 | 0.099 | 0.083 | 0.069 | 0.056 | 0.046 | 0.036 |
| -0.246000000000007 | 0.236 | 0.198 | 0.167 | 0.141 | 0.119 | 0.1 | 0.083 | 0.069 | 0.057 | 0.046 | 0.037 |
| -0.245250000000007 | 0.236 | 0.199 | 0.167 | 0.141 | 0.119 | 0.1 | 0.084 | 0.07 | 0.058 | 0.047 | 0.037 |
| -0.244500000000007 | 0.237 | 0.199 | 0.168 | 0.142 | 0.12 | 0.101 | 0.084 | 0.07 | 0.058 | 0.047 | 0.038 |
| -0.243750000000007 | 0.238 | 0.2 | 0.169 | 0.142 | 0.12 | 0.101 | 0.085 | 0.071 | 0.059 | 0.048 | 0.038 |
| -0.243000000000007 | 0.238 | 0.2 | 0.169 | 0.143 | 0.121 | 0.102 | 0.086 | 0.071 | 0.059 | 0.048 | 0.039 |
| -0.242250000000007 | 0.239 | 0.201 | 0.17 | 0.144 | 0.121 | 0.102 | 0.086 | 0.072 | 0.06 | 0.049 | 0.039 |
| -0.241500000000007 | 0.239 | 0.202 | 0.17 | 0.144 | 0.122 | 0.103 | 0.087 | 0.073 | 0.06 | 0.049 | 0.04 |
| -0.240750000000007 | 0.24 | 0.202 | 0.171 | 0.145 | 0.122 | 0.103 | 0.087 | 0.073 | 0.061 | 0.05 | 0.04 |
| -0.240000000000007 | 0.24 | 0.203 | 0.171 | 0.145 | 0.123 | 0.104 | 0.088 | 0.074 | 0.061 | 0.05 | 0.041 |
| -0.239250000000007 | 0.241 | 0.203 | 0.172 | 0.146 | 0.124 | 0.105 | 0.088 | 0.074 | 0.062 | 0.051 | 0.041 |
| -0.238500000000007 | 0.242 | 0.204 | 0.173 | 0.146 | 0.124 | 0.105 | 0.089 | 0.075 | 0.062 | 0.051 | 0.042 |
| -0.237750000000007 | 0.242 | 0.204 | 0.173 | 0.147 | 0.125 | 0.106 | 0.089 | 0.075 | 0.063 | 0.052 | 0.042 |
| -0.237000000000007 | 0.243 | 0.205 | 0.174 | 0.147 | 0.125 | 0.106 | 0.09 | 0.076 | 0.063 | 0.052 | 0.043 |
| -0.236250000000007 | 0.243 | 0.206 | 0.174 | 0.148 | 0.126 | 0.107 | 0.09 | 0.076 | 0.064 | 0.053 | 0.043 |
| -0.235500000000007 | 0.244 | 0.206 | 0.175 | 0.148 | 0.126 | 0.107 | 0.091 | 0.077 | 0.064 | 0.054 | 0.044 |
| -0.234750000000007 | 0.244 | 0.207 | 0.175 | 0.149 | 0.127 | 0.108 | 0.091 | 0.077 | 0.065 | 0.054 | 0.044 |
| -0.234000000000007 | 0.245 | 0.207 | 0.176 | 0.15 | 0.127 | 0.108 | 0.092 | 0.078 | 0.065 | 0.055 | 0.045 |
| -0.233250000000007 | 0.246 | 0.208 | 0.176 | 0.15 | 0.128 | 0.109 | 0.092 | 0.078 | 0.066 | 0.055 | 0.045 |
| -0.232500000000007 | 0.246 | 0.208 | 0.177 | 0.151 | 0.128 | 0.109 | 0.093 | 0.079 | 0.066 | 0.056 | 0.046 |
| -0.231750000000007 | 0.247 | 0.209 | 0.177 | 0.151 | 0.129 | 0.11 | 0.093 | 0.079 | 0.067 | 0.056 | 0.046 |
| -0.231000000000007 | 0.247 | 0.209 | 0.178 | 0.152 | 0.129 | 0.11 | 0.094 | 0.08 | 0.067 | 0.057 | 0.047 |
| -0.230250000000007 | 0.248 | 0.21 | 0.178 | 0.152 | 0.13 | 0.111 | 0.094 | 0.08 | 0.068 | 0.057 | 0.047 |
| -0.229500000000007 | 0.248 | 0.21 | 0.179 | 0.153 | 0.13 | 0.111 | 0.095 | 0.081 | 0.068 | 0.058 | 0.048 |
| -0.228750000000007 | 0.249 | 0.211 | 0.18 | 0.153 | 0.131 | 0.112 | 0.095 | 0.081 | 0.069 | 0.058 | 0.048 |
| -0.228000000000007 | 0.249 | 0.211 | 0.18 | 0.154 | 0.131 | 0.112 | 0.096 | 0.082 | 0.069 | 0.059 | 0.049 |
| -0.227250000000007 | 0.25 | 0.212 | 0.181 | 0.154 | 0.132 | 0.113 | 0.096 | 0.082 | 0.07 | 0.059 | 0.049 |
| -0.226500000000007 | 0.25 | 0.213 | 0.181 | 0.155 | 0.132 | 0.113 | 0.097 | 0.083 | 0.07 | 0.06 | 0.05 |
| -0.225750000000007 | 0.251 | 0.213 | 0.182 | 0.155 | 0.133 | 0.114 | 0.097 | 0.083 | 0.071 | 0.06 | 0.05 |
| -0.225000000000007 | 0.252 | 0.214 | 0.182 | 0.156 | 0.133 | 0.114 | 0.098 | 0.084 | 0.071 | 0.06 | 0.051 |
| -0.224250000000007 | 0.252 | 0.214 | 0.183 | 0.156 | 0.134 | 0.115 | 0.098 | 0.084 | 0.072 | 0.061 | 0.051 |
| -0.223500000000007 | 0.253 | 0.215 | 0.183 | 0.157 | 0.134 | 0.115 | 0.099 | 0.085 | 0.072 | 0.061 | 0.052 |
| -0.222750000000007 | 0.253 | 0.215 | 0.184 | 0.157 | 0.135 | 0.116 | 0.099 | 0.085 | 0.073 | 0.062 | 0.052 |
| -0.222000000000007 | 0.254 | 0.216 | 0.184 | 0.158 | 0.135 | 0.116 | 0.1 | 0.086 | 0.073 | 0.062 | 0.053 |
| -0.221250000000007 | 0.254 | 0.216 | 0.185 | 0.158 | 0.136 | 0.117 | 0.1 | 0.086 | 0.074 | 0.063 | 0.053 |
| -0.220500000000007 | 0.255 | 0.217 | 0.185 | 0.159 | 0.136 | 0.117 | 0.101 | 0.087 | 0.074 | 0.063 | 0.054 |
| -0.219750000000007 | 0.255 | 0.217 | 0.186 | 0.159 | 0.137 | 0.118 | 0.101 | 0.087 | 0.075 | 0.064 | 0.054 |
| -0.219000000000007 | 0.256 | 0.218 | 0.186 | 0.16 | 0.137 | 0.118 | 0.102 | 0.088 | 0.075 | 0.064 | 0.055 |
| -0.218250000000007 | 0.256 | 0.218 | 0.187 | 0.16 | 0.138 | 0.119 | 0.102 | 0.088 | 0.076 | 0.065 | 0.055 |
| -0.217500000000007 | 0.257 | 0.219 | 0.187 | 0.161 | 0.138 | 0.119 | 0.103 | 0.089 | 0.076 | 0.065 | 0.056 |
| -0.216750000000007 | 0.257 | 0.219 | 0.188 | 0.161 | 0.139 | 0.12 | 0.103 | 0.089 | 0.077 | 0.066 | 0.056 |
| -0.216000000000007 | 0.258 | 0.22 | 0.188 | 0.162 | 0.139 | 0.12 | 0.104 | 0.09 | 0.077 | 0.066 | 0.057 |
| -0.215250000000007 | 0.258 | 0.22 | 0.189 | 0.162 | 0.14 | 0.121 | 0.104 | 0.09 | 0.078 | 0.067 | 0.057 |
| -0.214500000000007 | 0.259 | 0.221 | 0.189 | 0.163 | 0.14 | 0.121 | 0.105 | 0.09 | 0.078 | 0.067 | 0.057 |
| -0.213750000000007 | 0.259 | 0.221 | 0.19 | 0.163 | 0.141 | 0.122 | 0.105 | 0.091 | 0.078 | 0.068 | 0.058 |
| -0.213000000000007 | 0.26 | 0.222 | 0.19 | 0.164 | 0.141 | 0.122 | 0.106 | 0.091 | 0.079 | 0.068 | 0.058 |
| -0.212250000000007 | 0.26 | 0.222 | 0.191 | 0.164 | 0.142 | 0.123 | 0.106 | 0.092 | 0.079 | 0.068 | 0.059 |
| -0.211500000000007 | 0.261 | 0.223 | 0.191 | 0.165 | 0.142 | 0.123 | 0.107 | 0.092 | 0.08 | 0.069 | 0.059 |
| -0.210750000000007 | 0.261 | 0.223 | 0.192 | 0.165 | 0.143 | 0.124 | 0.107 | 0.093 | 0.08 | 0.069 | 0.06 |
| -0.210000000000007 | 0.262 | 0.224 | 0.192 | 0.166 | 0.143 | 0.124 | 0.107 | 0.093 | 0.081 | 0.07 | 0.06 |
| -0.209250000000007 | 0.262 | 0.224 | 0.193 | 0.166 | 0.144 | 0.124 | 0.108 | 0.094 | 0.081 | 0.07 | 0.061 |
| -0.208500000000007 | 0.263 | 0.225 | 0.193 | 0.167 | 0.144 | 0.125 | 0.108 | 0.094 | 0.082 | 0.071 | 0.061 |
| -0.207750000000007 | 0.263 | 0.225 | 0.194 | 0.167 | 0.145 | 0.125 | 0.109 | 0.095 | 0.082 | 0.071 | 0.061 |
| -0.207000000000007 | 0.264 | 0.226 | 0.194 | 0.167 | 0.145 | 0.126 | 0.109 | 0.095 | 0.083 | 0.072 | 0.062 |
| -0.206250000000007 | 0.264 | 0.226 | 0.194 | 0.168 | 0.145 | 0.126 | 0.11 | 0.095 | 0.083 | 0.072 | 0.062 |
| -0.205500000000007 | 0.265 | 0.227 | 0.195 | 0.168 | 0.146 | 0.127 | 0.11 | 0.096 | 0.083 | 0.072 | 0.063 |
| -0.204750000000007 | 0.265 | 0.227 | 0.195 | 0.169 | 0.146 | 0.127 | 0.111 | 0.096 | 0.084 | 0.073 | 0.063 |
| -0.204000000000007 | 0.266 | 0.228 | 0.196 | 0.169 | 0.147 | 0.128 | 0.111 | 0.097 | 0.084 | 0.073 | 0.064 |
| -0.203250000000007 | 0.266 | 0.228 | 0.196 | 0.17 | 0.147 | 0.128 | 0.112 | 0.097 | 0.085 | 0.074 | 0.064 |
| -0.202500000000007 | 0.267 | 0.228 | 0.197 | 0.17 | 0.148 | 0.128 | 0.112 | 0.098 | 0.085 | 0.074 | 0.064 |
| -0.201750000000007 | 0.267 | 0.229 | 0.197 | 0.171 | 0.148 | 0.129 | 0.112 | 0.098 | 0.086 | 0.075 | 0.065 |
| -0.201000000000007 | 0.268 | 0.229 | 0.198 | 0.171 | 0.149 | 0.129 | 0.113 | 0.098 | 0.086 | 0.075 | 0.065 |
| -0.200250000000007 | 0.268 | 0.23 | 0.198 | 0.172 | 0.149 | 0.13 | 0.113 | 0.099 | 0.086 | 0.075 | 0.066 |
| -0.199500000000007 | 0.269 | 0.23 | 0.199 | 0.172 | 0.149 | 0.13 | 0.114 | 0.099 | 0.087 | 0.076 | 0.066 |
| -0.198750000000007 | 0.269 | 0.231 | 0.199 | 0.172 | 0.15 | 0.131 | 0.114 | 0.1 | 0.087 | 0.076 | 0.067 |
| -0.198000000000007 | 0.27 | 0.231 | 0.2 | 0.173 | 0.15 | 0.131 | 0.115 | 0.1 | 0.088 | 0.077 | 0.067 |
| -0.197250000000007 | 0.27 | 0.232 | 0.2 | 0.173 | 0.151 | 0.132 | 0.115 | 0.101 | 0.088 | 0.077 | 0.067 |
| -0.196500000000007 | 0.271 | 0.232 | 0.2 | 0.174 | 0.151 | 0.132 | 0.115 | 0.101 | 0.089 | 0.078 | 0.068 |
| -0.195750000000007 | 0.271 | 0.233 | 0.201 | 0.174 | 0.152 | 0.132 | 0.116 | 0.101 | 0.089 | 0.078 | 0.068 |
| -0.195000000000007 | 0.271 | 0.233 | 0.201 | 0.175 | 0.152 | 0.133 | 0.116 | 0.102 | 0.089 | 0.078 | 0.069 |
| -0.194250000000007 | 0.272 | 0.234 | 0.202 | 0.175 | 0.153 | 0.133 | 0.117 | 0.102 | 0.09 | 0.079 | 0.069 |
| -0.193500000000007 | 0.272 | 0.234 | 0.202 | 0.176 | 0.153 | 0.134 | 0.117 | 0.103 | 0.09 | 0.079 | 0.069 |
| -0.192750000000007 | 0.273 | 0.234 | 0.203 | 0.176 | 0.153 | 0.134 | 0.118 | 0.103 | 0.091 | 0.08 | 0.07 |
| -0.192000000000007 | 0.273 | 0.235 | 0.203 | 0.176 | 0.154 | 0.135 | 0.118 | 0.104 | 0.091 | 0.08 | 0.07 |
| -0.191250000000007 | 0.274 | 0.235 | 0.203 | 0.177 | 0.154 | 0.135 | 0.118 | 0.104 | 0.091 | 0.08 | 0.071 |
| -0.190500000000007 | 0.274 | 0.236 | 0.204 | 0.177 | 0.155 | 0.135 | 0.119 | 0.104 | 0.092 | 0.081 | 0.071 |
| -0.189750000000007 | 0.275 | 0.236 | 0.204 | 0.178 | 0.155 | 0.136 | 0.119 | 0.105 | 0.092 | 0.081 | 0.071 |
| -0.189000000000007 | 0.275 | 0.237 | 0.205 | 0.178 | 0.155 | 0.136 | 0.12 | 0.105 | 0.093 | 0.082 | 0.072 |
| -0.188250000000007 | 0.276 | 0.237 | 0.205 | 0.178 | 0.156 | 0.137 | 0.12 | 0.106 | 0.093 | 0.082 | 0.072 |
| -0.187500000000007 | 0.276 | 0.238 | 0.206 | 0.179 | 0.156 | 0.137 | 0.12 | 0.106 | 0.093 | 0.082 | 0.073 |
| -0.186750000000007 | 0.276 | 0.238 | 0.206 | 0.179 | 0.157 | 0.137 | 0.121 | 0.106 | 0.094 | 0.083 | 0.073 |
| -0.186000000000007 | 0.277 | 0.238 | 0.206 | 0.18 | 0.157 | 0.138 | 0.121 | 0.107 | 0.094 | 0.083 | 0.073 |
| -0.185250000000007 | 0.277 | 0.239 | 0.207 | 0.18 | 0.158 | 0.138 | 0.122 | 0.107 | 0.095 | 0.084 | 0.074 |
| -0.184500000000007 | 0.278 | 0.239 | 0.207 | 0.181 | 0.158 | 0.139 | 0.122 | 0.108 | 0.095 | 0.084 | 0.074 |
| -0.183750000000007 | 0.278 | 0.24 | 0.208 | 0.181 | 0.158 | 0.139 | 0.122 | 0.108 | 0.095 | 0.084 | 0.075 |
| -0.183000000000007 | 0.279 | 0.24 | 0.208 | 0.181 | 0.159 | 0.139 | 0.123 | 0.108 | 0.096 | 0.085 | 0.075 |
| -0.182250000000007 | 0.279 | 0.241 | 0.209 | 0.182 | 0.159 | 0.14 | 0.123 | 0.109 | 0.096 | 0.085 | 0.075 |
| -0.181500000000007 | 0.279 | 0.241 | 0.209 | 0.182 | 0.16 | 0.14 | 0.124 | 0.109 | 0.097 | 0.085 | 0.076 |
| -0.180750000000007 | 0.28 | 0.241 | 0.209 | 0.183 | 0.16 | 0.141 | 0.124 | 0.109 | 0.097 | 0.086 | 0.076 |
| -0.180000000000007 | 0.28 | 0.242 | 0.21 | 0.183 | 0.16 | 0.141 | 0.124 | 0.11 | 0.097 | 0.086 | 0.076 |
| -0.179250000000007 | 0.281 | 0.242 | 0.21 | 0.183 | 0.161 | 0.141 | 0.125 | 0.11 | 0.098 | 0.087 | 0.077 |
| -0.178500000000007 | 0.281 | 0.243 | 0.211 | 0.184 | 0.161 | 0.142 | 0.125 | 0.111 | 0.098 | 0.087 | 0.077 |
| -0.177750000000007 | 0.282 | 0.243 | 0.211 | 0.184 | 0.162 | 0.142 | 0.125 | 0.111 | 0.098 | 0.087 | 0.078 |
| -0.177000000000007 | 0.282 | 0.243 | 0.211 | 0.185 | 0.162 | 0.143 | 0.126 | 0.111 | 0.099 | 0.088 | 0.078 |
| -0.176250000000007 | 0.282 | 0.244 | 0.212 | 0.185 | 0.162 | 0.143 | 0.126 | 0.112 | 0.099 | 0.088 | 0.078 |
| -0.175500000000007 | 0.283 | 0.244 | 0.212 | 0.185 | 0.163 | 0.143 | 0.127 | 0.112 | 0.1 | 0.088 | 0.079 |
| -0.174750000000007 | 0.283 | 0.245 | 0.213 | 0.186 | 0.163 | 0.144 | 0.127 | 0.112 | 0.1 | 0.089 | 0.079 |
| -0.174000000000007 | 0.284 | 0.245 | 0.213 | 0.186 | 0.163 | 0.144 | 0.127 | 0.113 | 0.1 | 0.089 | 0.079 |
| -0.173250000000007 | 0.284 | 0.245 | 0.213 | 0.187 | 0.164 | 0.144 | 0.128 | 0.113 | 0.101 | 0.09 | 0.08 |
| -0.172500000000007 | 0.285 | 0.246 | 0.214 | 0.187 | 0.164 | 0.145 | 0.128 | 0.114 | 0.101 | 0.09 | 0.08 |
| -0.171750000000007 | 0.285 | 0.246 | 0.214 | 0.187 | 0.165 | 0.145 | 0.128 | 0.114 | 0.101 | 0.09 | 0.08 |
| -0.171000000000007 | 0.285 | 0.247 | 0.215 | 0.188 | 0.165 | 0.146 | 0.129 | 0.114 | 0.102 | 0.091 | 0.081 |
| -0.170250000000007 | 0.286 | 0.247 | 0.215 | 0.188 | 0.165 | 0.146 | 0.129 | 0.115 | 0.102 | 0.091 | 0.081 |
| -0.169500000000007 | 0.286 | 0.247 | 0.215 | 0.188 | 0.166 | 0.146 | 0.13 | 0.115 | 0.102 | 0.091 | 0.082 |
| -0.168750000000007 | 0.287 | 0.248 | 0.216 | 0.189 | 0.166 | 0.147 | 0.13 | 0.115 | 0.103 | 0.092 | 0.082 |
| -0.168000000000007 | 0.287 | 0.248 | 0.216 | 0.189 | 0.166 | 0.147 | 0.13 | 0.116 | 0.103 | 0.092 | 0.082 |
| -0.167250000000007 | 0.287 | 0.249 | 0.216 | 0.19 | 0.167 | 0.147 | 0.131 | 0.116 | 0.103 | 0.092 | 0.083 |
| -0.166500000000007 | 0.288 | 0.249 | 0.217 | 0.19 | 0.167 | 0.148 | 0.131 | 0.116 | 0.104 | 0.093 | 0.083 |
| -0.165750000000007 | 0.288 | 0.249 | 0.217 | 0.19 | 0.168 | 0.148 | 0.131 | 0.117 | 0.104 | 0.093 | 0.083 |
| -0.165000000000007 | 0.289 | 0.25 | 0.218 | 0.191 | 0.168 | 0.148 | 0.132 | 0.117 | 0.104 | 0.093 | 0.084 |
| -0.164250000000007 | 0.289 | 0.25 | 0.218 | 0.191 | 0.168 | 0.149 | 0.132 | 0.118 | 0.105 | 0.094 | 0.084 |
| -0.163500000000007 | 0.289 | 0.251 | 0.218 | 0.191 | 0.169 | 0.149 | 0.132 | 0.118 | 0.105 | 0.094 | 0.084 |
| -0.162750000000007 | 0.29 | 0.251 | 0.219 | 0.192 | 0.169 | 0.149 | 0.133 | 0.118 | 0.106 | 0.094 | 0.085 |
| -0.162000000000007 | 0.29 | 0.251 | 0.219 | 0.192 | 0.169 | 0.15 | 0.133 | 0.119 | 0.106 | 0.095 | 0.085 |
| -0.161250000000007 | 0.29 | 0.252 | 0.219 | 0.192 | 0.17 | 0.15 | 0.133 | 0.119 | 0.106 | 0.095 | 0.085 |
| -0.160500000000007 | 0.291 | 0.252 | 0.22 | 0.193 | 0.17 | 0.151 | 0.134 | 0.119 | 0.107 | 0.095 | 0.086 |
| -0.159750000000007 | 0.291 | 0.252 | 0.22 | 0.193 | 0.17 | 0.151 | 0.134 | 0.12 | 0.107 | 0.096 | 0.086 |
| -0.159000000000007 | 0.292 | 0.253 | 0.221 | 0.194 | 0.171 | 0.151 | 0.134 | 0.12 | 0.107 | 0.096 | 0.086 |
| -0.158250000000007 | 0.292 | 0.253 | 0.221 | 0.194 | 0.171 | 0.152 | 0.135 | 0.12 | 0.108 | 0.096 | 0.087 |
| -0.157500000000007 | 0.292 | 0.253 | 0.221 | 0.194 | 0.171 | 0.152 | 0.135 | 0.121 | 0.108 | 0.097 | 0.087 |
| -0.156750000000007 | 0.293 | 0.254 | 0.222 | 0.195 | 0.172 | 0.152 | 0.135 | 0.121 | 0.108 | 0.097 | 0.087 |
| -0.156000000000007 | 0.293 | 0.254 | 0.222 | 0.195 | 0.172 | 0.153 | 0.136 | 0.121 | 0.109 | 0.097 | 0.088 |
| -0.155250000000007 | 0.293 | 0.255 | 0.222 | 0.195 | 0.172 | 0.153 | 0.136 | 0.122 | 0.109 | 0.098 | 0.088 |
| -0.154500000000007 | 0.294 | 0.255 | 0.223 | 0.196 | 0.173 | 0.153 | 0.136 | 0.122 | 0.109 | 0.098 | 0.088 |
| -0.153750000000007 | 0.294 | 0.255 | 0.223 | 0.196 | 0.173 | 0.154 | 0.137 | 0.122 | 0.109 | 0.098 | 0.088 |
| -0.153000000000007 | 0.295 | 0.256 | 0.223 | 0.196 | 0.173 | 0.154 | 0.137 | 0.123 | 0.11 | 0.099 | 0.089 |
| -0.152250000000007 | 0.295 | 0.256 | 0.224 | 0.197 | 0.174 | 0.154 | 0.137 | 0.123 | 0.11 | 0.099 | 0.089 |
| -0.151500000000007 | 0.295 | 0.256 | 0.224 | 0.197 | 0.174 | 0.155 | 0.138 | 0.123 | 0.11 | 0.099 | 0.089 |
| -0.150750000000007 | 0.296 | 0.257 | 0.224 | 0.197 | 0.174 | 0.155 | 0.138 | 0.123 | 0.111 | 0.1 | 0.09 |
| -0.150000000000007 | 0.296 | 0.257 | 0.225 | 0.198 | 0.175 | 0.155 | 0.138 | 0.124 | 0.111 | 0.1 | 0.09 |
| -0.149250000000007 | 0.296 | 0.257 | 0.225 | 0.198 | 0.175 | 0.156 | 0.139 | 0.124 | 0.111 | 0.1 | 0.09 |
| -0.148500000000007 | 0.297 | 0.258 | 0.225 | 0.198 | 0.175 | 0.156 | 0.139 | 0.124 | 0.112 | 0.1 | 0.091 |
| -0.147750000000007 | 0.297 | 0.258 | 0.226 | 0.199 | 0.176 | 0.156 | 0.139 | 0.125 | 0.112 | 0.101 | 0.091 |
| -0.147000000000007 | 0.297 | 0.258 | 0.226 | 0.199 | 0.176 | 0.156 | 0.14 | 0.125 | 0.112 | 0.101 | 0.091 |
| -0.146250000000007 | 0.298 | 0.259 | 0.226 | 0.199 | 0.176 | 0.157 | 0.14 | 0.125 | 0.113 | 0.101 | 0.092 |
| -0.145500000000007 | 0.298 | 0.259 | 0.227 | 0.2 | 0.177 | 0.157 | 0.14 | 0.126 | 0.113 | 0.102 | 0.092 |
| -0.144750000000007 | 0.299 | 0.259 | 0.227 | 0.2 | 0.177 | 0.157 | 0.141 | 0.126 | 0.113 | 0.102 | 0.092 |
| -0.144000000000007 | 0.299 | 0.26 | 0.227 | 0.2 | 0.177 | 0.158 | 0.141 | 0.126 | 0.113 | 0.102 | 0.092 |
| -0.143250000000007 | 0.299 | 0.26 | 0.228 | 0.201 | 0.178 | 0.158 | 0.141 | 0.127 | 0.114 | 0.103 | 0.093 |
| -0.142500000000007 | 0.3 | 0.26 | 0.228 | 0.201 | 0.178 | 0.158 | 0.141 | 0.127 | 0.114 | 0.103 | 0.093 |
| -0.141750000000007 | 0.3 | 0.261 | 0.228 | 0.201 | 0.178 | 0.159 | 0.142 | 0.127 | 0.114 | 0.103 | 0.093 |
| -0.141000000000007 | 0.3 | 0.261 | 0.229 | 0.202 | 0.179 | 0.159 | 0.142 | 0.127 | 0.115 | 0.103 | 0.094 |
| -0.140250000000007 | 0.301 | 0.261 | 0.229 | 0.202 | 0.179 | 0.159 | 0.142 | 0.128 | 0.115 | 0.104 | 0.094 |
| -0.139500000000007 | 0.301 | 0.262 | 0.229 | 0.202 | 0.179 | 0.16 | 0.143 | 0.128 | 0.115 | 0.104 | 0.094 |
| -0.138750000000007 | 0.301 | 0.262 | 0.23 | 0.202 | 0.179 | 0.16 | 0.143 | 0.128 | 0.116 | 0.104 | 0.094 |
| -0.138000000000007 | 0.302 | 0.262 | 0.23 | 0.203 | 0.18 | 0.16 | 0.143 | 0.129 | 0.116 | 0.105 | 0.095 |
| -0.137250000000007 | 0.302 | 0.263 | 0.23 | 0.203 | 0.18 | 0.16 | 0.144 | 0.129 | 0.116 | 0.105 | 0.095 |
| -0.136500000000007 | 0.302 | 0.263 | 0.231 | 0.203 | 0.18 | 0.161 | 0.144 | 0.129 | 0.116 | 0.105 | 0.095 |
| -0.135750000000007 | 0.303 | 0.263 | 0.231 | 0.204 | 0.181 | 0.161 | 0.144 | 0.129 | 0.117 | 0.105 | 0.096 |
| -0.135000000000007 | 0.303 | 0.264 | 0.231 | 0.204 | 0.181 | 0.161 | 0.144 | 0.13 | 0.117 | 0.106 | 0.096 |
| -0.134250000000007 | 0.303 | 0.264 | 0.232 | 0.204 | 0.181 | 0.162 | 0.145 | 0.13 | 0.117 | 0.106 | 0.096 |
| -0.133500000000007 | 0.304 | 0.264 | 0.232 | 0.205 | 0.182 | 0.162 | 0.145 | 0.13 | 0.117 | 0.106 | 0.096 |
| -0.132750000000007 | 0.304 | 0.265 | 0.232 | 0.205 | 0.182 | 0.162 | 0.145 | 0.131 | 0.118 | 0.107 | 0.097 |
| -0.132000000000007 | 0.304 | 0.265 | 0.232 | 0.205 | 0.182 | 0.162 | 0.146 | 0.131 | 0.118 | 0.107 | 0.097 |
| -0.131250000000007 | 0.305 | 0.265 | 0.233 | 0.206 | 0.182 | 0.163 | 0.146 | 0.131 | 0.118 | 0.107 | 0.097 |
| -0.130500000000007 | 0.305 | 0.266 | 0.233 | 0.206 | 0.183 | 0.163 | 0.146 | 0.131 | 0.119 | 0.107 | 0.097 |
| -0.129750000000007 | 0.305 | 0.266 | 0.233 | 0.206 | 0.183 | 0.163 | 0.146 | 0.132 | 0.119 | 0.108 | 0.098 |
| -0.129000000000007 | 0.305 | 0.266 | 0.234 | 0.206 | 0.183 | 0.164 | 0.147 | 0.132 | 0.119 | 0.108 | 0.098 |
| -0.128250000000007 | 0.306 | 0.267 | 0.234 | 0.207 | 0.184 | 0.164 | 0.147 | 0.132 | 0.119 | 0.108 | 0.098 |
| -0.127500000000007 | 0.306 | 0.267 | 0.234 | 0.207 | 0.184 | 0.164 | 0.147 | 0.132 | 0.12 | 0.108 | 0.098 |
| -0.126750000000007 | 0.306 | 0.267 | 0.235 | 0.207 | 0.184 | 0.164 | 0.147 | 0.133 | 0.12 | 0.109 | 0.099 |
| -0.126000000000007 | 0.307 | 0.267 | 0.235 | 0.208 | 0.184 | 0.165 | 0.148 | 0.133 | 0.12 | 0.109 | 0.099 |
| -0.125250000000007 | 0.307 | 0.268 | 0.235 | 0.208 | 0.185 | 0.165 | 0.148 | 0.133 | 0.12 | 0.109 | 0.099 |
| -0.124500000000007 | 0.307 | 0.268 | 0.235 | 0.208 | 0.185 | 0.165 | 0.148 | 0.134 | 0.121 | 0.109 | 0.099 |
| -0.123750000000007 | 0.308 | 0.268 | 0.236 | 0.208 | 0.185 | 0.166 | 0.149 | 0.134 | 0.121 | 0.11 | 0.1 |
| -0.123000000000007 | 0.308 | 0.269 | 0.236 | 0.209 | 0.186 | 0.166 | 0.149 | 0.134 | 0.121 | 0.11 | 0.1 |
| -0.122250000000007 | 0.308 | 0.269 | 0.236 | 0.209 | 0.186 | 0.166 | 0.149 | 0.134 | 0.121 | 0.11 | 0.1 |
| -0.121500000000007 | 0.309 | 0.269 | 0.237 | 0.209 | 0.186 | 0.166 | 0.149 | 0.135 | 0.122 | 0.11 | 0.1 |
| -0.120750000000007 | 0.309 | 0.269 | 0.237 | 0.209 | 0.186 | 0.167 | 0.15 | 0.135 | 0.122 | 0.111 | 0.101 |
| -0.120000000000007 | 0.309 | 0.27 | 0.237 | 0.21 | 0.187 | 0.167 | 0.15 | 0.135 | 0.122 | 0.111 | 0.101 |
| -0.119250000000007 | 0.309 | 0.27 | 0.237 | 0.21 | 0.187 | 0.167 | 0.15 | 0.135 | 0.122 | 0.111 | 0.101 |
| -0.118500000000007 | 0.31 | 0.27 | 0.238 | 0.21 | 0.187 | 0.167 | 0.15 | 0.136 | 0.123 | 0.111 | 0.101 |
| -0.117750000000007 | 0.31 | 0.271 | 0.238 | 0.211 | 0.187 | 0.168 | 0.151 | 0.136 | 0.123 | 0.112 | 0.102 |
| -0.117000000000007 | 0.31 | 0.271 | 0.238 | 0.211 | 0.188 | 0.168 | 0.151 | 0.136 | 0.123 | 0.112 | 0.102 |
| -0.116250000000007 | 0.311 | 0.271 | 0.238 | 0.211 | 0.188 | 0.168 | 0.151 | 0.136 | 0.123 | 0.112 | 0.102 |
| -0.115500000000007 | 0.311 | 0.271 | 0.239 | 0.211 | 0.188 | 0.168 | 0.151 | 0.137 | 0.124 | 0.112 | 0.102 |
| -0.114750000000007 | 0.311 | 0.272 | 0.239 | 0.212 | 0.188 | 0.169 | 0.152 | 0.137 | 0.124 | 0.113 | 0.103 |
| -0.114000000000007 | 0.311 | 0.272 | 0.239 | 0.212 | 0.189 | 0.169 | 0.152 | 0.137 | 0.124 | 0.113 | 0.103 |
| -0.113250000000007 | 0.312 | 0.272 | 0.24 | 0.212 | 0.189 | 0.169 | 0.152 | 0.137 | 0.124 | 0.113 | 0.103 |
| -0.112500000000007 | 0.312 | 0.273 | 0.24 | 0.212 | 0.189 | 0.169 | 0.152 | 0.138 | 0.125 | 0.113 | 0.103 |
| -0.111750000000007 | 0.312 | 0.273 | 0.24 | 0.213 | 0.189 | 0.17 | 0.153 | 0.138 | 0.125 | 0.114 | 0.104 |
| -0.111000000000007 | 0.313 | 0.273 | 0.24 | 0.213 | 0.19 | 0.17 | 0.153 | 0.138 | 0.125 | 0.114 | 0.104 |
| -0.110250000000007 | 0.313 | 0.273 | 0.241 | 0.213 | 0.19 | 0.17 | 0.153 | 0.138 | 0.125 | 0.114 | 0.104 |
| -0.109500000000007 | 0.313 | 0.274 | 0.241 | 0.213 | 0.19 | 0.17 | 0.153 | 0.138 | 0.126 | 0.114 | 0.104 |
| -0.108750000000007 | 0.313 | 0.274 | 0.241 | 0.214 | 0.19 | 0.171 | 0.153 | 0.139 | 0.126 | 0.114 | 0.104 |
| -0.108000000000007 | 0.314 | 0.274 | 0.241 | 0.214 | 0.191 | 0.171 | 0.154 | 0.139 | 0.126 | 0.115 | 0.105 |
| -0.107250000000007 | 0.314 | 0.274 | 0.242 | 0.214 | 0.191 | 0.171 | 0.154 | 0.139 | 0.126 | 0.115 | 0.105 |
| -0.106500000000007 | 0.314 | 0.275 | 0.242 | 0.214 | 0.191 | 0.171 | 0.154 | 0.139 | 0.126 | 0.115 | 0.105 |
| -0.105750000000007 | 0.314 | 0.275 | 0.242 | 0.215 | 0.191 | 0.171 | 0.154 | 0.14 | 0.127 | 0.115 | 0.105 |
| -0.105000000000007 | 0.315 | 0.275 | 0.242 | 0.215 | 0.192 | 0.172 | 0.155 | 0.14 | 0.127 | 0.116 | 0.106 |
| -0.104250000000007 | 0.315 | 0.275 | 0.243 | 0.215 | 0.192 | 0.172 | 0.155 | 0.14 | 0.127 | 0.116 | 0.106 |
| -0.103500000000007 | 0.315 | 0.276 | 0.243 | 0.215 | 0.192 | 0.172 | 0.155 | 0.14 | 0.127 | 0.116 | 0.106 |
| -0.102750000000007 | 0.316 | 0.276 | 0.243 | 0.216 | 0.192 | 0.172 | 0.155 | 0.14 | 0.128 | 0.116 | 0.106 |
| -0.102000000000007 | 0.316 | 0.276 | 0.243 | 0.216 | 0.192 | 0.173 | 0.155 | 0.141 | 0.128 | 0.116 | 0.106 |
| -0.101250000000007 | 0.316 | 0.276 | 0.244 | 0.216 | 0.193 | 0.173 | 0.156 | 0.141 | 0.128 | 0.117 | 0.107 |
| -0.100500000000007 | 0.316 | 0.277 | 0.244 | 0.216 | 0.193 | 0.173 | 0.156 | 0.141 | 0.128 | 0.117 | 0.107 |
| -0.0997500000000071 | 0.317 | 0.277 | 0.244 | 0.216 | 0.193 | 0.173 | 0.156 | 0.141 | 0.128 | 0.117 | 0.107 |
| -0.0990000000000071 | 0.317 | 0.277 | 0.244 | 0.217 | 0.193 | 0.173 | 0.156 | 0.142 | 0.129 | 0.117 | 0.107 |
| -0.0982500000000071 | 0.317 | 0.277 | 0.245 | 0.217 | 0.194 | 0.174 | 0.157 | 0.142 | 0.129 | 0.117 | 0.107 |
| -0.0975000000000071 | 0.317 | 0.278 | 0.245 | 0.217 | 0.194 | 0.174 | 0.157 | 0.142 | 0.129 | 0.118 | 0.108 |
| -0.0967500000000071 | 0.318 | 0.278 | 0.245 | 0.217 | 0.194 | 0.174 | 0.157 | 0.142 | 0.129 | 0.118 | 0.108 |
| -0.0960000000000071 | 0.318 | 0.278 | 0.245 | 0.218 | 0.194 | 0.174 | 0.157 | 0.142 | 0.129 | 0.118 | 0.108 |
| -0.0952500000000071 | 0.318 | 0.278 | 0.245 | 0.218 | 0.194 | 0.175 | 0.157 | 0.143 | 0.13 | 0.118 | 0.108 |
| -0.0945000000000071 | 0.318 | 0.279 | 0.246 | 0.218 | 0.195 | 0.175 | 0.158 | 0.143 | 0.13 | 0.118 | 0.108 |
| -0.0937500000000071 | 0.319 | 0.279 | 0.246 | 0.218 | 0.195 | 0.175 | 0.158 | 0.143 | 0.13 | 0.119 | 0.109 |
| -0.0930000000000071 | 0.319 | 0.279 | 0.246 | 0.218 | 0.195 | 0.175 | 0.158 | 0.143 | 0.13 | 0.119 | 0.109 |
| -0.0922500000000071 | 0.319 | 0.279 | 0.246 | 0.219 | 0.195 | 0.175 | 0.158 | 0.143 | 0.13 | 0.119 | 0.109 |
| -0.0915000000000071 | 0.319 | 0.28 | 0.247 | 0.219 | 0.196 | 0.176 | 0.158 | 0.144 | 0.131 | 0.119 | 0.109 |
| -0.0907500000000071 | 0.32 | 0.28 | 0.247 | 0.219 | 0.196 | 0.176 | 0.159 | 0.144 | 0.131 | 0.119 | 0.109 |
| -0.090000000000007 | 0.32 | 0.28 | 0.247 | 0.219 | 0.196 | 0.176 | 0.159 | 0.144 | 0.131 | 0.12 | 0.109 |
| -0.0892500000000071 | 0.32 | 0.28 | 0.247 | 0.22 | 0.196 | 0.176 | 0.159 | 0.144 | 0.131 | 0.12 | 0.11 |
| -0.0885000000000071 | 0.32 | 0.28 | 0.247 | 0.22 | 0.196 | 0.176 | 0.159 | 0.144 | 0.131 | 0.12 | 0.11 |
| -0.0877500000000071 | 0.32 | 0.281 | 0.248 | 0.22 | 0.197 | 0.177 | 0.159 | 0.144 | 0.131 | 0.12 | 0.11 |
| -0.0870000000000071 | 0.321 | 0.281 | 0.248 | 0.22 | 0.197 | 0.177 | 0.16 | 0.145 | 0.132 | 0.12 | 0.11 |
| -0.0862500000000071 | 0.321 | 0.281 | 0.248 | 0.22 | 0.197 | 0.177 | 0.16 | 0.145 | 0.132 | 0.12 | 0.11 |
| -0.0855000000000071 | 0.321 | 0.281 | 0.248 | 0.221 | 0.197 | 0.177 | 0.16 | 0.145 | 0.132 | 0.121 | 0.111 |
| -0.0847500000000071 | 0.321 | 0.282 | 0.248 | 0.221 | 0.197 | 0.177 | 0.16 | 0.145 | 0.132 | 0.121 | 0.111 |
| -0.0840000000000071 | 0.322 | 0.282 | 0.249 | 0.221 | 0.198 | 0.178 | 0.16 | 0.145 | 0.132 | 0.121 | 0.111 |
| -0.0832500000000071 | 0.322 | 0.282 | 0.249 | 0.221 | 0.198 | 0.178 | 0.161 | 0.146 | 0.133 | 0.121 | 0.111 |
| -0.0825000000000071 | 0.322 | 0.282 | 0.249 | 0.221 | 0.198 | 0.178 | 0.161 | 0.146 | 0.133 | 0.121 | 0.111 |
| -0.0817500000000071 | 0.322 | 0.282 | 0.249 | 0.222 | 0.198 | 0.178 | 0.161 | 0.146 | 0.133 | 0.121 | 0.111 |
| -0.0810000000000071 | 0.322 | 0.283 | 0.25 | 0.222 | 0.198 | 0.178 | 0.161 | 0.146 | 0.133 | 0.122 | 0.112 |
| -0.0802500000000071 | 0.323 | 0.283 | 0.25 | 0.222 | 0.199 | 0.178 | 0.161 | 0.146 | 0.133 | 0.122 | 0.112 |
| -0.0795000000000071 | 0.323 | 0.283 | 0.25 | 0.222 | 0.199 | 0.179 | 0.161 | 0.146 | 0.133 | 0.122 | 0.112 |
| -0.0787500000000071 | 0.323 | 0.283 | 0.25 | 0.222 | 0.199 | 0.179 | 0.162 | 0.147 | 0.134 | 0.122 | 0.112 |
| -0.0780000000000071 | 0.323 | 0.283 | 0.25 | 0.223 | 0.199 | 0.179 | 0.162 | 0.147 | 0.134 | 0.122 | 0.112 |
| -0.0772500000000071 | 0.324 | 0.284 | 0.25 | 0.223 | 0.199 | 0.179 | 0.162 | 0.147 | 0.134 | 0.122 | 0.112 |
| -0.0765000000000071 | 0.324 | 0.284 | 0.251 | 0.223 | 0.199 | 0.179 | 0.162 | 0.147 | 0.134 | 0.123 | 0.113 |
| -0.0757500000000071 | 0.324 | 0.284 | 0.251 | 0.223 | 0.2 | 0.18 | 0.162 | 0.147 | 0.134 | 0.123 | 0.113 |
| -0.0750000000000071 | 0.324 | 0.284 | 0.251 | 0.223 | 0.2 | 0.18 | 0.162 | 0.147 | 0.134 | 0.123 | 0.113 |
| -0.0742500000000071 | 0.324 | 0.284 | 0.251 | 0.223 | 0.2 | 0.18 | 0.163 | 0.148 | 0.135 | 0.123 | 0.113 |
| -0.0735000000000071 | 0.325 | 0.285 | 0.251 | 0.224 | 0.2 | 0.18 | 0.163 | 0.148 | 0.135 | 0.123 | 0.113 |
| -0.0727500000000071 | 0.325 | 0.285 | 0.252 | 0.224 | 0.2 | 0.18 | 0.163 | 0.148 | 0.135 | 0.123 | 0.113 |
| -0.0720000000000071 | 0.325 | 0.285 | 0.252 | 0.224 | 0.2 | 0.18 | 0.163 | 0.148 | 0.135 | 0.124 | 0.113 |
| -0.0712500000000071 | 0.325 | 0.285 | 0.252 | 0.224 | 0.201 | 0.181 | 0.163 | 0.148 | 0.135 | 0.124 | 0.114 |
| -0.0705000000000071 | 0.325 | 0.285 | 0.252 | 0.224 | 0.201 | 0.181 | 0.163 | 0.148 | 0.135 | 0.124 | 0.114 |
| -0.069750000000007 | 0.326 | 0.286 | 0.252 | 0.225 | 0.201 | 0.181 | 0.164 | 0.149 | 0.136 | 0.124 | 0.114 |
| -0.069000000000007 | 0.326 | 0.286 | 0.253 | 0.225 | 0.201 | 0.181 | 0.164 | 0.149 | 0.136 | 0.124 | 0.114 |
| -0.068250000000007 | 0.326 | 0.286 | 0.253 | 0.225 | 0.201 | 0.181 | 0.164 | 0.149 | 0.136 | 0.124 | 0.114 |
| -0.067500000000007 | 0.326 | 0.286 | 0.253 | 0.225 | 0.201 | 0.181 | 0.164 | 0.149 | 0.136 | 0.124 | 0.114 |
| -0.066750000000007 | 0.326 | 0.286 | 0.253 | 0.225 | 0.202 | 0.182 | 0.164 | 0.149 | 0.136 | 0.125 | 0.114 |
| -0.066000000000007 | 0.327 | 0.286 | 0.253 | 0.225 | 0.202 | 0.182 | 0.164 | 0.149 | 0.136 | 0.125 | 0.115 |
| -0.065250000000007 | 0.327 | 0.287 | 0.253 | 0.226 | 0.202 | 0.182 | 0.165 | 0.149 | 0.136 | 0.125 | 0.115 |
| -0.064500000000007 | 0.327 | 0.287 | 0.254 | 0.226 | 0.202 | 0.182 | 0.165 | 0.15 | 0.137 | 0.125 | 0.115 |
| -0.063750000000007 | 0.327 | 0.287 | 0.254 | 0.226 | 0.202 | 0.182 | 0.165 | 0.15 | 0.137 | 0.125 | 0.115 |
| -0.063000000000007 | 0.327 | 0.287 | 0.254 | 0.226 | 0.202 | 0.182 | 0.165 | 0.15 | 0.137 | 0.125 | 0.115 |
| -0.062250000000007 | 0.328 | 0.287 | 0.254 | 0.226 | 0.203 | 0.182 | 0.165 | 0.15 | 0.137 | 0.125 | 0.115 |
| -0.061500000000007 | 0.328 | 0.288 | 0.254 | 0.226 | 0.203 | 0.183 | 0.165 | 0.15 | 0.137 | 0.126 | 0.115 |
| -0.060750000000007 | 0.328 | 0.288 | 0.254 | 0.227 | 0.203 | 0.183 | 0.165 | 0.15 | 0.137 | 0.126 | 0.116 |
| -0.060000000000007 | 0.328 | 0.288 | 0.255 | 0.227 | 0.203 | 0.183 | 0.166 | 0.15 | 0.137 | 0.126 | 0.116 |
| -0.059250000000007 | 0.328 | 0.288 | 0.255 | 0.227 | 0.203 | 0.183 | 0.166 | 0.151 | 0.137 | 0.126 | 0.116 |
| -0.058500000000007 | 0.328 | 0.288 | 0.255 | 0.227 | 0.203 | 0.183 | 0.166 | 0.151 | 0.138 | 0.126 | 0.116 |
| -0.057750000000007 | 0.329 | 0.288 | 0.255 | 0.227 | 0.204 | 0.183 | 0.166 | 0.151 | 0.138 | 0.126 | 0.116 |
| -0.057000000000007 | 0.329 | 0.289 | 0.255 | 0.227 | 0.204 | 0.183 | 0.166 | 0.151 | 0.138 | 0.126 | 0.116 |
| -0.056250000000007 | 0.329 | 0.289 | 0.255 | 0.227 | 0.204 | 0.184 | 0.166 | 0.151 | 0.138 | 0.126 | 0.116 |
| -0.055500000000007 | 0.329 | 0.289 | 0.256 | 0.228 | 0.204 | 0.184 | 0.166 | 0.151 | 0.138 | 0.127 | 0.116 |
| -0.054750000000007 | 0.329 | 0.289 | 0.256 | 0.228 | 0.204 | 0.184 | 0.166 | 0.151 | 0.138 | 0.127 | 0.117 |
| -0.054000000000007 | 0.33 | 0.289 | 0.256 | 0.228 | 0.204 | 0.184 | 0.167 | 0.152 | 0.138 | 0.127 | 0.117 |
| -0.053250000000007 | 0.33 | 0.289 | 0.256 | 0.228 | 0.204 | 0.184 | 0.167 | 0.152 | 0.139 | 0.127 | 0.117 |
| -0.052500000000007 | 0.33 | 0.29 | 0.256 | 0.228 | 0.204 | 0.184 | 0.167 | 0.152 | 0.139 | 0.127 | 0.117 |
| -0.051750000000007 | 0.33 | 0.29 | 0.256 | 0.228 | 0.205 | 0.184 | 0.167 | 0.152 | 0.139 | 0.127 | 0.117 |
| -0.051000000000007 | 0.33 | 0.29 | 0.256 | 0.228 | 0.205 | 0.185 | 0.167 | 0.152 | 0.139 | 0.127 | 0.117 |
| -0.050250000000007 | 0.33 | 0.29 | 0.257 | 0.229 | 0.205 | 0.185 | 0.167 | 0.152 | 0.139 | 0.127 | 0.117 |
| -0.049500000000007 | 0.331 | 0.29 | 0.257 | 0.229 | 0.205 | 0.185 | 0.167 | 0.152 | 0.139 | 0.128 | 0.117 |
| -0.048750000000007 | 0.331 | 0.29 | 0.257 | 0.229 | 0.205 | 0.185 | 0.167 | 0.152 | 0.139 | 0.128 | 0.117 |
| -0.048000000000007 | 0.331 | 0.29 | 0.257 | 0.229 | 0.205 | 0.185 | 0.168 | 0.153 | 0.139 | 0.128 | 0.118 |
| -0.047250000000007 | 0.331 | 0.291 | 0.257 | 0.229 | 0.205 | 0.185 | 0.168 | 0.153 | 0.139 | 0.128 | 0.118 |
| -0.046500000000007 | 0.331 | 0.291 | 0.257 | 0.229 | 0.206 | 0.185 | 0.168 | 0.153 | 0.14 | 0.128 | 0.118 |
| -0.045750000000007 | 0.331 | 0.291 | 0.257 | 0.229 | 0.206 | 0.185 | 0.168 | 0.153 | 0.14 | 0.128 | 0.118 |
| -0.045000000000007 | 0.331 | 0.291 | 0.258 | 0.23 | 0.206 | 0.186 | 0.168 | 0.153 | 0.14 | 0.128 | 0.118 |
| -0.044250000000007 | 0.332 | 0.291 | 0.258 | 0.23 | 0.206 | 0.186 | 0.168 | 0.153 | 0.14 | 0.128 | 0.118 |
| -0.043500000000007 | 0.332 | 0.291 | 0.258 | 0.23 | 0.206 | 0.186 | 0.168 | 0.153 | 0.14 | 0.128 | 0.118 |
| -0.042750000000007 | 0.332 | 0.292 | 0.258 | 0.23 | 0.206 | 0.186 | 0.168 | 0.153 | 0.14 | 0.128 | 0.118 |
| -0.042000000000007 | 0.332 | 0.292 | 0.258 | 0.23 | 0.206 | 0.186 | 0.169 | 0.153 | 0.14 | 0.129 | 0.118 |
| -0.041250000000007 | 0.332 | 0.292 | 0.258 | 0.23 | 0.206 | 0.186 | 0.169 | 0.153 | 0.14 | 0.129 | 0.118 |
| -0.040500000000007 | 0.332 | 0.292 | 0.258 | 0.23 | 0.207 | 0.186 | 0.169 | 0.154 | 0.14 | 0.129 | 0.119 |
| -0.039750000000007 | 0.333 | 0.292 | 0.259 | 0.23 | 0.207 | 0.186 | 0.169 | 0.154 | 0.14 | 0.129 | 0.119 |
| -0.039000000000007 | 0.333 | 0.292 | 0.259 | 0.231 | 0.207 | 0.186 | 0.169 | 0.154 | 0.141 | 0.129 | 0.119 |
| -0.038250000000007 | 0.333 | 0.292 | 0.259 | 0.231 | 0.207 | 0.187 | 0.169 | 0.154 | 0.141 | 0.129 | 0.119 |
| -0.037500000000007 | 0.333 | 0.292 | 0.259 | 0.231 | 0.207 | 0.187 | 0.169 | 0.154 | 0.141 | 0.129 | 0.119 |
| -0.036750000000007 | 0.333 | 0.293 | 0.259 | 0.231 | 0.207 | 0.187 | 0.169 | 0.154 | 0.141 | 0.129 | 0.119 |
| -0.036000000000007 | 0.333 | 0.293 | 0.259 | 0.231 | 0.207 | 0.187 | 0.169 | 0.154 | 0.141 | 0.129 | 0.119 |
| -0.035250000000007 | 0.333 | 0.293 | 0.259 | 0.231 | 0.207 | 0.187 | 0.169 | 0.154 | 0.141 | 0.129 | 0.119 |
| -0.034500000000007 | 0.334 | 0.293 | 0.259 | 0.231 | 0.207 | 0.187 | 0.17 | 0.154 | 0.141 | 0.13 | 0.119 |
| -0.033750000000007 | 0.334 | 0.293 | 0.26 | 0.231 | 0.208 | 0.187 | 0.17 | 0.154 | 0.141 | 0.13 | 0.119 |
| -0.033000000000007 | 0.334 | 0.293 | 0.26 | 0.231 | 0.208 | 0.187 | 0.17 | 0.155 | 0.141 | 0.13 | 0.119 |
| -0.032250000000007 | 0.334 | 0.293 | 0.26 | 0.232 | 0.208 | 0.187 | 0.17 | 0.155 | 0.141 | 0.13 | 0.12 |
| -0.031500000000007 | 0.334 | 0.293 | 0.26 | 0.232 | 0.208 | 0.187 | 0.17 | 0.155 | 0.141 | 0.13 | 0.12 |
| -0.030750000000007 | 0.334 | 0.294 | 0.26 | 0.232 | 0.208 | 0.188 | 0.17 | 0.155 | 0.142 | 0.13 | 0.12 |
| -0.030000000000007 | 0.334 | 0.294 | 0.26 | 0.232 | 0.208 | 0.188 | 0.17 | 0.155 | 0.142 | 0.13 | 0.12 |
| -0.029250000000007 | 0.334 | 0.294 | 0.26 | 0.232 | 0.208 | 0.188 | 0.17 | 0.155 | 0.142 | 0.13 | 0.12 |
| -0.028500000000007 | 0.335 | 0.294 | 0.26 | 0.232 | 0.208 | 0.188 | 0.17 | 0.155 | 0.142 | 0.13 | 0.12 |
| -0.027750000000007 | 0.335 | 0.294 | 0.26 | 0.232 | 0.208 | 0.188 | 0.17 | 0.155 | 0.142 | 0.13 | 0.12 |
| -0.027000000000007 | 0.335 | 0.294 | 0.261 | 0.232 | 0.208 | 0.188 | 0.17 | 0.155 | 0.142 | 0.13 | 0.12 |
| -0.026250000000007 | 0.335 | 0.294 | 0.261 | 0.232 | 0.209 | 0.188 | 0.171 | 0.155 | 0.142 | 0.13 | 0.12 |
| -0.025500000000007 | 0.335 | 0.294 | 0.261 | 0.232 | 0.209 | 0.188 | 0.171 | 0.155 | 0.142 | 0.13 | 0.12 |
| -0.024750000000007 | 0.335 | 0.295 | 0.261 | 0.233 | 0.209 | 0.188 | 0.171 | 0.155 | 0.142 | 0.131 | 0.12 |
| -0.024000000000007 | 0.335 | 0.295 | 0.261 | 0.233 | 0.209 | 0.188 | 0.171 | 0.156 | 0.142 | 0.131 | 0.12 |
| -0.023250000000007 | 0.335 | 0.295 | 0.261 | 0.233 | 0.209 | 0.188 | 0.171 | 0.156 | 0.142 | 0.131 | 0.12 |
| -0.022500000000007 | 0.336 | 0.295 | 0.261 | 0.233 | 0.209 | 0.189 | 0.171 | 0.156 | 0.142 | 0.131 | 0.12 |
| -0.021750000000007 | 0.336 | 0.295 | 0.261 | 0.233 | 0.209 | 0.189 | 0.171 | 0.156 | 0.142 | 0.131 | 0.121 |
| -0.021000000000007 | 0.336 | 0.295 | 0.261 | 0.233 | 0.209 | 0.189 | 0.171 | 0.156 | 0.143 | 0.131 | 0.121 |
| -0.020250000000007 | 0.336 | 0.295 | 0.261 | 0.233 | 0.209 | 0.189 | 0.171 | 0.156 | 0.143 | 0.131 | 0.121 |
| -0.019500000000007 | 0.336 | 0.295 | 0.262 | 0.233 | 0.209 | 0.189 | 0.171 | 0.156 | 0.143 | 0.131 | 0.121 |
| -0.018750000000007 | 0.336 | 0.295 | 0.262 | 0.233 | 0.209 | 0.189 | 0.171 | 0.156 | 0.143 | 0.131 | 0.121 |
| -0.018000000000007 | 0.336 | 0.295 | 0.262 | 0.233 | 0.209 | 0.189 | 0.171 | 0.156 | 0.143 | 0.131 | 0.121 |
| -0.017250000000007 | 0.336 | 0.296 | 0.262 | 0.233 | 0.21 | 0.189 | 0.171 | 0.156 | 0.143 | 0.131 | 0.121 |
| -0.016500000000007 | 0.336 | 0.296 | 0.262 | 0.234 | 0.21 | 0.189 | 0.172 | 0.156 | 0.143 | 0.131 | 0.121 |
| -0.015750000000007 | 0.337 | 0.296 | 0.262 | 0.234 | 0.21 | 0.189 | 0.172 | 0.156 | 0.143 | 0.131 | 0.121 |
| -0.015000000000007 | 0.337 | 0.296 | 0.262 | 0.234 | 0.21 | 0.189 | 0.172 | 0.156 | 0.143 | 0.131 | 0.121 |
| -0.014250000000007 | 0.337 | 0.296 | 0.262 | 0.234 | 0.21 | 0.189 | 0.172 | 0.156 | 0.143 | 0.131 | 0.121 |
| -0.013500000000007 | 0.337 | 0.296 | 0.262 | 0.234 | 0.21 | 0.189 | 0.172 | 0.157 | 0.143 | 0.131 | 0.121 |
| -0.012750000000007 | 0.337 | 0.296 | 0.262 | 0.234 | 0.21 | 0.189 | 0.172 | 0.157 | 0.143 | 0.132 | 0.121 |
| -0.012000000000007 | 0.337 | 0.296 | 0.262 | 0.234 | 0.21 | 0.19 | 0.172 | 0.157 | 0.143 | 0.132 | 0.121 |
| -0.011250000000007 | 0.337 | 0.296 | 0.263 | 0.234 | 0.21 | 0.19 | 0.172 | 0.157 | 0.143 | 0.132 | 0.121 |
| -0.010500000000007 | 0.337 | 0.296 | 0.263 | 0.234 | 0.21 | 0.19 | 0.172 | 0.157 | 0.143 | 0.132 | 0.121 |
| -0.009750000000007 | 0.337 | 0.297 | 0.263 | 0.234 | 0.21 | 0.19 | 0.172 | 0.157 | 0.143 | 0.132 | 0.121 |
| -0.009000000000007 | 0.338 | 0.297 | 0.263 | 0.234 | 0.21 | 0.19 | 0.172 | 0.157 | 0.144 | 0.132 | 0.121 |
| -0.008250000000007 | 0.338 | 0.297 | 0.263 | 0.234 | 0.21 | 0.19 | 0.172 | 0.157 | 0.144 | 0.132 | 0.121 |
| -0.007500000000007 | 0.338 | 0.297 | 0.263 | 0.234 | 0.21 | 0.19 | 0.172 | 0.157 | 0.144 | 0.132 | 0.122 |
| -0.006750000000007 | 0.338 | 0.297 | 0.263 | 0.235 | 0.211 | 0.19 | 0.172 | 0.157 | 0.144 | 0.132 | 0.122 |
| -0.006000000000007 | 0.338 | 0.297 | 0.263 | 0.235 | 0.211 | 0.19 | 0.172 | 0.157 | 0.144 | 0.132 | 0.122 |
| -0.005250000000007 | 0.338 | 0.297 | 0.263 | 0.235 | 0.211 | 0.19 | 0.172 | 0.157 | 0.144 | 0.132 | 0.122 |
| -0.004500000000007 | 0.338 | 0.297 | 0.263 | 0.235 | 0.211 | 0.19 | 0.172 | 0.157 | 0.144 | 0.132 | 0.122 |
| -0.003750000000007 | 0.338 | 0.297 | 0.263 | 0.235 | 0.211 | 0.19 | 0.173 | 0.157 | 0.144 | 0.132 | 0.122 |
| -0.003000000000007 | 0.338 | 0.297 | 0.263 | 0.235 | 0.211 | 0.19 | 0.173 | 0.157 | 0.144 | 0.132 | 0.122 |
| -0.002250000000007 | 0.338 | 0.297 | 0.263 | 0.235 | 0.211 | 0.19 | 0.173 | 0.157 | 0.144 | 0.132 | 0.122 |
| -0.001500000000007 | 0.338 | 0.297 | 0.263 | 0.235 | 0.211 | 0.19 | 0.173 | 0.157 | 0.144 | 0.132 | 0.122 |
| -0.000750000000007003 | 0.338 | 0.298 | 0.264 | 0.235 | 0.211 | 0.19 | 0.173 | 0.157 | 0.144 | 0.132 | 0.122 |
| -7.00329551295287e-15 | 0.339 | 0.298 | 0.264 | 0.235 | 0.211 | 0.19 | 0.173 | 0.157 | 0.144 | 0.132 | 0.122 |
| 0.000749999999992996 | 0.339 | 0.298 | 0.264 | 0.235 | 0.211 | 0.19 | 0.173 | 0.157 | 0.144 | 0.132 | 0.122 |
| 0.001499999999993 | 0.339 | 0.298 | 0.264 | 0.235 | 0.211 | 0.191 | 0.173 | 0.157 | 0.144 | 0.132 | 0.122 |
| 0.002249999999993 | 0.339 | 0.298 | 0.264 | 0.235 | 0.211 | 0.191 | 0.173 | 0.158 | 0.144 | 0.132 | 0.122 |
| 0.002999999999993 | 0.339 | 0.298 | 0.264 | 0.235 | 0.211 | 0.191 | 0.173 | 0.158 | 0.144 | 0.132 | 0.122 |
| 0.003749999999993 | 0.339 | 0.298 | 0.264 | 0.235 | 0.211 | 0.191 | 0.173 | 0.158 | 0.144 | 0.132 | 0.122 |
| 0.004499999999993 | 0.339 | 0.298 | 0.264 | 0.235 | 0.211 | 0.191 | 0.173 | 0.158 | 0.144 | 0.132 | 0.122 |
| 0.005249999999993 | 0.339 | 0.298 | 0.264 | 0.236 | 0.211 | 0.191 | 0.173 | 0.158 | 0.144 | 0.132 | 0.122 |
| 0.00599999999999299 | 0.339 | 0.298 | 0.264 | 0.236 | 0.211 | 0.191 | 0.173 | 0.158 | 0.144 | 0.132 | 0.122 |
| 0.00674999999999299 | 0.339 | 0.298 | 0.264 | 0.236 | 0.211 | 0.191 | 0.173 | 0.158 | 0.144 | 0.133 | 0.122 |
| 0.00749999999999299 | 0.339 | 0.298 | 0.264 | 0.236 | 0.211 | 0.191 | 0.173 | 0.158 | 0.144 | 0.133 | 0.122 |
| 0.00824999999999299 | 0.339 | 0.298 | 0.264 | 0.236 | 0.212 | 0.191 | 0.173 | 0.158 | 0.144 | 0.133 | 0.122 |
| 0.00899999999999299 | 0.34 | 0.298 | 0.264 | 0.236 | 0.212 | 0.191 | 0.173 | 0.158 | 0.144 | 0.133 | 0.122 |
| 0.00974999999999299 | 0.34 | 0.298 | 0.264 | 0.236 | 0.212 | 0.191 | 0.173 | 0.158 | 0.144 | 0.133 | 0.122 |
| 0.010499999999993 | 0.34 | 0.298 | 0.264 | 0.236 | 0.212 | 0.191 | 0.173 | 0.158 | 0.144 | 0.133 | 0.122 |
| 0.011249999999993 | 0.34 | 0.299 | 0.264 | 0.236 | 0.212 | 0.191 | 0.173 | 0.158 | 0.144 | 0.133 | 0.122 |
| 0.011999999999993 | 0.34 | 0.299 | 0.264 | 0.236 | 0.212 | 0.191 | 0.173 | 0.158 | 0.144 | 0.133 | 0.122 |
| 0.012749999999993 | 0.34 | 0.299 | 0.265 | 0.236 | 0.212 | 0.191 | 0.173 | 0.158 | 0.144 | 0.133 | 0.122 |
| 0.013499999999993 | 0.34 | 0.299 | 0.265 | 0.236 | 0.212 | 0.191 | 0.173 | 0.158 | 0.144 | 0.133 | 0.122 |
| 0.014249999999993 | 0.34 | 0.299 | 0.265 | 0.236 | 0.212 | 0.191 | 0.173 | 0.158 | 0.144 | 0.133 | 0.122 |
| 0.014999999999993 | 0.34 | 0.299 | 0.265 | 0.236 | 0.212 | 0.191 | 0.173 | 0.158 | 0.144 | 0.133 | 0.122 |
| 0.015749999999993 | 0.34 | 0.299 | 0.265 | 0.236 | 0.212 | 0.191 | 0.173 | 0.158 | 0.145 | 0.133 | 0.122 |
| 0.016499999999993 | 0.34 | 0.299 | 0.265 | 0.236 | 0.212 | 0.191 | 0.173 | 0.158 | 0.145 | 0.133 | 0.122 |
| 0.017249999999993 | 0.34 | 0.299 | 0.265 | 0.236 | 0.212 | 0.191 | 0.173 | 0.158 | 0.145 | 0.133 | 0.122 |
| 0.017999999999993 | 0.34 | 0.299 | 0.265 | 0.236 | 0.212 | 0.191 | 0.173 | 0.158 | 0.145 | 0.133 | 0.122 |
| 0.018749999999993 | 0.34 | 0.299 | 0.265 | 0.236 | 0.212 | 0.191 | 0.173 | 0.158 | 0.145 | 0.133 | 0.122 |
| 0.019499999999993 | 0.34 | 0.299 | 0.265 | 0.236 | 0.212 | 0.191 | 0.173 | 0.158 | 0.145 | 0.133 | 0.122 |
| 0.020249999999993 | 0.34 | 0.299 | 0.265 | 0.236 | 0.212 | 0.191 | 0.173 | 0.158 | 0.145 | 0.133 | 0.122 |
| 0.020999999999993 | 0.34 | 0.299 | 0.265 | 0.236 | 0.212 | 0.191 | 0.174 | 0.158 | 0.145 | 0.133 | 0.122 |
| 0.021749999999993 | 0.341 | 0.299 | 0.265 | 0.236 | 0.212 | 0.191 | 0.174 | 0.158 | 0.145 | 0.133 | 0.122 |
| 0.022499999999993 | 0.341 | 0.299 | 0.265 | 0.236 | 0.212 | 0.191 | 0.174 | 0.158 | 0.145 | 0.133 | 0.122 |
| 0.023249999999993 | 0.341 | 0.299 | 0.265 | 0.236 | 0.212 | 0.191 | 0.174 | 0.158 | 0.145 | 0.133 | 0.122 |
| 0.023999999999993 | 0.341 | 0.299 | 0.265 | 0.236 | 0.212 | 0.191 | 0.174 | 0.158 | 0.145 | 0.133 | 0.122 |
| 0.024749999999993 | 0.341 | 0.299 | 0.265 | 0.236 | 0.212 | 0.191 | 0.174 | 0.158 | 0.145 | 0.133 | 0.122 |
| 0.025499999999993 | 0.341 | 0.299 | 0.265 | 0.236 | 0.212 | 0.191 | 0.174 | 0.158 | 0.145 | 0.133 | 0.122 |
| 0.026249999999993 | 0.341 | 0.299 | 0.265 | 0.236 | 0.212 | 0.191 | 0.174 | 0.158 | 0.145 | 0.133 | 0.122 |
| 0.026999999999993 | 0.341 | 0.3 | 0.265 | 0.237 | 0.212 | 0.191 | 0.174 | 0.158 | 0.145 | 0.133 | 0.122 |
| 0.027749999999993 | 0.341 | 0.3 | 0.265 | 0.237 | 0.212 | 0.191 | 0.174 | 0.158 | 0.145 | 0.133 | 0.122 |
| 0.028499999999993 | 0.341 | 0.3 | 0.265 | 0.237 | 0.212 | 0.191 | 0.174 | 0.158 | 0.145 | 0.133 | 0.122 |
| 0.029249999999993 | 0.341 | 0.3 | 0.265 | 0.237 | 0.212 | 0.191 | 0.174 | 0.158 | 0.145 | 0.133 | 0.122 |
| 0.029999999999993 | 0.341 | 0.3 | 0.265 | 0.237 | 0.212 | 0.191 | 0.174 | 0.158 | 0.145 | 0.133 | 0.122 |
| 0.030749999999993 | 0.341 | 0.3 | 0.265 | 0.237 | 0.212 | 0.191 | 0.174 | 0.158 | 0.145 | 0.133 | 0.122 |
| 0.031499999999993 | 0.341 | 0.3 | 0.265 | 0.237 | 0.212 | 0.191 | 0.174 | 0.158 | 0.145 | 0.133 | 0.122 |
| 0.032249999999993 | 0.341 | 0.3 | 0.265 | 0.237 | 0.212 | 0.191 | 0.174 | 0.158 | 0.145 | 0.133 | 0.122 |
| 0.032999999999993 | 0.341 | 0.3 | 0.265 | 0.237 | 0.212 | 0.191 | 0.174 | 0.158 | 0.145 | 0.133 | 0.122 |
| 0.033749999999993 | 0.341 | 0.3 | 0.265 | 0.237 | 0.212 | 0.191 | 0.174 | 0.158 | 0.145 | 0.133 | 0.122 |
| 0.034499999999993 | 0.341 | 0.3 | 0.265 | 0.237 | 0.212 | 0.191 | 0.174 | 0.158 | 0.144 | 0.133 | 0.122 |
| 0.035249999999993 | 0.341 | 0.3 | 0.265 | 0.237 | 0.212 | 0.191 | 0.174 | 0.158 | 0.144 | 0.133 | 0.122 |
| 0.035999999999993 | 0.341 | 0.3 | 0.265 | 0.237 | 0.212 | 0.191 | 0.174 | 0.158 | 0.144 | 0.133 | 0.122 |
| 0.036749999999993 | 0.341 | 0.3 | 0.265 | 0.237 | 0.212 | 0.191 | 0.174 | 0.158 | 0.144 | 0.133 | 0.122 |
| 0.037499999999993 | 0.341 | 0.3 | 0.265 | 0.237 | 0.212 | 0.191 | 0.174 | 0.158 | 0.144 | 0.133 | 0.122 |
| 0.038249999999993 | 0.341 | 0.3 | 0.266 | 0.237 | 0.212 | 0.191 | 0.174 | 0.158 | 0.144 | 0.133 | 0.122 |
| 0.038999999999993 | 0.341 | 0.3 | 0.266 | 0.237 | 0.212 | 0.191 | 0.173 | 0.158 | 0.144 | 0.132 | 0.122 |
| 0.039749999999993 | 0.341 | 0.3 | 0.266 | 0.237 | 0.212 | 0.191 | 0.173 | 0.158 | 0.144 | 0.132 | 0.122 |
| 0.040499999999993 | 0.342 | 0.3 | 0.266 | 0.237 | 0.212 | 0.191 | 0.173 | 0.158 | 0.144 | 0.132 | 0.122 |
| 0.041249999999993 | 0.342 | 0.3 | 0.266 | 0.237 | 0.212 | 0.191 | 0.173 | 0.158 | 0.144 | 0.132 | 0.122 |
| 0.041999999999993 | 0.342 | 0.3 | 0.266 | 0.237 | 0.212 | 0.191 | 0.173 | 0.158 | 0.144 | 0.132 | 0.122 |
| 0.042749999999993 | 0.342 | 0.3 | 0.266 | 0.237 | 0.212 | 0.191 | 0.173 | 0.158 | 0.144 | 0.132 | 0.122 |
| 0.043499999999993 | 0.342 | 0.3 | 0.266 | 0.237 | 0.212 | 0.191 | 0.173 | 0.158 | 0.144 | 0.132 | 0.122 |
| 0.044249999999993 | 0.342 | 0.3 | 0.266 | 0.237 | 0.212 | 0.191 | 0.173 | 0.158 | 0.144 | 0.132 | 0.122 |
| 0.044999999999993 | 0.342 | 0.3 | 0.266 | 0.237 | 0.212 | 0.191 | 0.173 | 0.158 | 0.144 | 0.132 | 0.122 |
| 0.045749999999993 | 0.342 | 0.3 | 0.266 | 0.237 | 0.212 | 0.191 | 0.173 | 0.158 | 0.144 | 0.132 | 0.122 |
| 0.046499999999993 | 0.342 | 0.3 | 0.266 | 0.237 | 0.212 | 0.191 | 0.173 | 0.158 | 0.144 | 0.132 | 0.122 |
| 0.047249999999993 | 0.342 | 0.3 | 0.266 | 0.237 | 0.212 | 0.191 | 0.173 | 0.158 | 0.144 | 0.132 | 0.122 |
| 0.047999999999993 | 0.342 | 0.3 | 0.266 | 0.237 | 0.212 | 0.191 | 0.173 | 0.158 | 0.144 | 0.132 | 0.122 |
| 0.048749999999993 | 0.342 | 0.3 | 0.266 | 0.237 | 0.212 | 0.191 | 0.173 | 0.158 | 0.144 | 0.132 | 0.122 |
| 0.049499999999993 | 0.342 | 0.3 | 0.266 | 0.237 | 0.212 | 0.191 | 0.173 | 0.158 | 0.144 | 0.132 | 0.122 |
| 0.050249999999993 | 0.342 | 0.3 | 0.266 | 0.237 | 0.212 | 0.191 | 0.173 | 0.158 | 0.144 | 0.132 | 0.122 |
| 0.050999999999993 | 0.342 | 0.3 | 0.266 | 0.237 | 0.212 | 0.191 | 0.173 | 0.158 | 0.144 | 0.132 | 0.121 |
| 0.051749999999993 | 0.342 | 0.3 | 0.266 | 0.237 | 0.212 | 0.191 | 0.173 | 0.158 | 0.144 | 0.132 | 0.121 |
| 0.052499999999993 | 0.342 | 0.3 | 0.266 | 0.237 | 0.212 | 0.191 | 0.173 | 0.157 | 0.144 | 0.132 | 0.121 |
| 0.053249999999993 | 0.342 | 0.3 | 0.266 | 0.237 | 0.212 | 0.191 | 0.173 | 0.157 | 0.144 | 0.132 | 0.121 |
| 0.053999999999993 | 0.342 | 0.3 | 0.266 | 0.237 | 0.212 | 0.191 | 0.173 | 0.157 | 0.144 | 0.132 | 0.121 |
| 0.054749999999993 | 0.342 | 0.3 | 0.266 | 0.237 | 0.212 | 0.191 | 0.173 | 0.157 | 0.144 | 0.132 | 0.121 |
| 0.055499999999993 | 0.342 | 0.3 | 0.265 | 0.237 | 0.212 | 0.191 | 0.173 | 0.157 | 0.144 | 0.132 | 0.121 |
| 0.056249999999993 | 0.342 | 0.3 | 0.265 | 0.236 | 0.212 | 0.191 | 0.173 | 0.157 | 0.144 | 0.132 | 0.121 |
| 0.056999999999993 | 0.342 | 0.3 | 0.265 | 0.236 | 0.212 | 0.191 | 0.173 | 0.157 | 0.144 | 0.132 | 0.121 |
| 0.057749999999993 | 0.342 | 0.3 | 0.265 | 0.236 | 0.212 | 0.191 | 0.173 | 0.157 | 0.144 | 0.132 | 0.121 |
| 0.058499999999993 | 0.342 | 0.3 | 0.265 | 0.236 | 0.212 | 0.191 | 0.173 | 0.157 | 0.144 | 0.132 | 0.121 |
| 0.059249999999993 | 0.342 | 0.3 | 0.265 | 0.236 | 0.212 | 0.191 | 0.173 | 0.157 | 0.144 | 0.132 | 0.121 |
| 0.059999999999993 | 0.342 | 0.3 | 0.265 | 0.236 | 0.212 | 0.191 | 0.173 | 0.157 | 0.143 | 0.131 | 0.121 |
| 0.060749999999993 | 0.342 | 0.3 | 0.265 | 0.236 | 0.212 | 0.191 | 0.173 | 0.157 | 0.143 | 0.131 | 0.121 |
| 0.061499999999993 | 0.342 | 0.3 | 0.265 | 0.236 | 0.212 | 0.191 | 0.173 | 0.157 | 0.143 | 0.131 | 0.121 |
| 0.062249999999993 | 0.342 | 0.3 | 0.265 | 0.236 | 0.212 | 0.191 | 0.173 | 0.157 | 0.143 | 0.131 | 0.121 |
| 0.062999999999993 | 0.342 | 0.3 | 0.265 | 0.236 | 0.212 | 0.191 | 0.173 | 0.157 | 0.143 | 0.131 | 0.121 |
| 0.063749999999993 | 0.342 | 0.3 | 0.265 | 0.236 | 0.212 | 0.191 | 0.173 | 0.157 | 0.143 | 0.131 | 0.121 |
| 0.064499999999993 | 0.342 | 0.3 | 0.265 | 0.236 | 0.212 | 0.191 | 0.173 | 0.157 | 0.143 | 0.131 | 0.121 |
| 0.065249999999993 | 0.342 | 0.3 | 0.265 | 0.236 | 0.212 | 0.191 | 0.172 | 0.157 | 0.143 | 0.131 | 0.121 |
| 0.065999999999993 | 0.342 | 0.3 | 0.265 | 0.236 | 0.212 | 0.191 | 0.172 | 0.157 | 0.143 | 0.131 | 0.12 |
| 0.066749999999993 | 0.342 | 0.3 | 0.265 | 0.236 | 0.211 | 0.19 | 0.172 | 0.157 | 0.143 | 0.131 | 0.12 |
| 0.067499999999993 | 0.342 | 0.3 | 0.265 | 0.236 | 0.211 | 0.19 | 0.172 | 0.157 | 0.143 | 0.131 | 0.12 |
| 0.068249999999993 | 0.342 | 0.3 | 0.265 | 0.236 | 0.211 | 0.19 | 0.172 | 0.157 | 0.143 | 0.131 | 0.12 |
| 0.068999999999993 | 0.342 | 0.3 | 0.265 | 0.236 | 0.211 | 0.19 | 0.172 | 0.157 | 0.143 | 0.131 | 0.12 |
| 0.069749999999993 | 0.342 | 0.3 | 0.265 | 0.236 | 0.211 | 0.19 | 0.172 | 0.156 | 0.143 | 0.131 | 0.12 |
| 0.070499999999993 | 0.342 | 0.3 | 0.265 | 0.236 | 0.211 | 0.19 | 0.172 | 0.156 | 0.143 | 0.131 | 0.12 |
| 0.071249999999993 | 0.342 | 0.3 | 0.265 | 0.236 | 0.211 | 0.19 | 0.172 | 0.156 | 0.143 | 0.131 | 0.12 |
| 0.071999999999993 | 0.342 | 0.3 | 0.265 | 0.236 | 0.211 | 0.19 | 0.172 | 0.156 | 0.143 | 0.131 | 0.12 |
| 0.072749999999993 | 0.342 | 0.3 | 0.265 | 0.236 | 0.211 | 0.19 | 0.172 | 0.156 | 0.143 | 0.131 | 0.12 |
| 0.073499999999993 | 0.342 | 0.3 | 0.265 | 0.236 | 0.211 | 0.19 | 0.172 | 0.156 | 0.142 | 0.13 | 0.12 |
| 0.074249999999993 | 0.342 | 0.3 | 0.265 | 0.236 | 0.211 | 0.19 | 0.172 | 0.156 | 0.142 | 0.13 | 0.12 |
| 0.074999999999993 | 0.342 | 0.3 | 0.265 | 0.236 | 0.211 | 0.19 | 0.172 | 0.156 | 0.142 | 0.13 | 0.12 |
| 0.075749999999993 | 0.342 | 0.3 | 0.265 | 0.236 | 0.211 | 0.19 | 0.172 | 0.156 | 0.142 | 0.13 | 0.12 |
| 0.076499999999993 | 0.342 | 0.3 | 0.265 | 0.236 | 0.211 | 0.19 | 0.172 | 0.156 | 0.142 | 0.13 | 0.12 |
| 0.077249999999993 | 0.342 | 0.3 | 0.265 | 0.236 | 0.211 | 0.19 | 0.172 | 0.156 | 0.142 | 0.13 | 0.119 |
| 0.077999999999993 | 0.342 | 0.3 | 0.265 | 0.236 | 0.211 | 0.19 | 0.172 | 0.156 | 0.142 | 0.13 | 0.119 |
| 0.078749999999993 | 0.342 | 0.3 | 0.265 | 0.235 | 0.211 | 0.19 | 0.171 | 0.156 | 0.142 | 0.13 | 0.119 |
| 0.079499999999993 | 0.342 | 0.3 | 0.265 | 0.235 | 0.211 | 0.19 | 0.171 | 0.156 | 0.142 | 0.13 | 0.119 |
| 0.080249999999993 | 0.342 | 0.299 | 0.265 | 0.235 | 0.211 | 0.19 | 0.171 | 0.156 | 0.142 | 0.13 | 0.119 |
| 0.080999999999993 | 0.342 | 0.299 | 0.265 | 0.235 | 0.211 | 0.189 | 0.171 | 0.156 | 0.142 | 0.13 | 0.119 |
| 0.081749999999993 | 0.342 | 0.299 | 0.265 | 0.235 | 0.211 | 0.189 | 0.171 | 0.155 | 0.142 | 0.13 | 0.119 |
| 0.082499999999993 | 0.342 | 0.299 | 0.264 | 0.235 | 0.21 | 0.189 | 0.171 | 0.155 | 0.142 | 0.13 | 0.119 |
| 0.083249999999993 | 0.341 | 0.299 | 0.264 | 0.235 | 0.21 | 0.189 | 0.171 | 0.155 | 0.142 | 0.13 | 0.119 |
| 0.083999999999993 | 0.341 | 0.299 | 0.264 | 0.235 | 0.21 | 0.189 | 0.171 | 0.155 | 0.142 | 0.129 | 0.119 |
| 0.084749999999993 | 0.341 | 0.299 | 0.264 | 0.235 | 0.21 | 0.189 | 0.171 | 0.155 | 0.141 | 0.129 | 0.119 |
| 0.085499999999993 | 0.341 | 0.299 | 0.264 | 0.235 | 0.21 | 0.189 | 0.171 | 0.155 | 0.141 | 0.129 | 0.119 |
| 0.086249999999993 | 0.341 | 0.299 | 0.264 | 0.235 | 0.21 | 0.189 | 0.171 | 0.155 | 0.141 | 0.129 | 0.119 |
| 0.086999999999993 | 0.341 | 0.299 | 0.264 | 0.235 | 0.21 | 0.189 | 0.171 | 0.155 | 0.141 | 0.129 | 0.118 |
| 0.087749999999993 | 0.341 | 0.299 | 0.264 | 0.235 | 0.21 | 0.189 | 0.171 | 0.155 | 0.141 | 0.129 | 0.118 |
| 0.088499999999993 | 0.341 | 0.299 | 0.264 | 0.235 | 0.21 | 0.189 | 0.171 | 0.155 | 0.141 | 0.129 | 0.118 |
| 0.089249999999993 | 0.341 | 0.299 | 0.264 | 0.235 | 0.21 | 0.189 | 0.171 | 0.155 | 0.141 | 0.129 | 0.118 |
| 0.089999999999993 | 0.341 | 0.299 | 0.264 | 0.235 | 0.21 | 0.189 | 0.17 | 0.155 | 0.141 | 0.129 | 0.118 |
| 0.090749999999993 | 0.341 | 0.299 | 0.264 | 0.235 | 0.21 | 0.189 | 0.17 | 0.155 | 0.141 | 0.129 | 0.118 |
| 0.091499999999993 | 0.341 | 0.299 | 0.264 | 0.235 | 0.21 | 0.189 | 0.17 | 0.155 | 0.141 | 0.129 | 0.118 |
| 0.092249999999993 | 0.341 | 0.299 | 0.264 | 0.235 | 0.21 | 0.188 | 0.17 | 0.154 | 0.141 | 0.129 | 0.118 |
| 0.092999999999993 | 0.341 | 0.299 | 0.264 | 0.234 | 0.21 | 0.188 | 0.17 | 0.154 | 0.141 | 0.128 | 0.118 |
| 0.093749999999993 | 0.341 | 0.299 | 0.264 | 0.234 | 0.21 | 0.188 | 0.17 | 0.154 | 0.14 | 0.128 | 0.118 |
| 0.094499999999993 | 0.341 | 0.299 | 0.264 | 0.234 | 0.209 | 0.188 | 0.17 | 0.154 | 0.14 | 0.128 | 0.118 |
| 0.095249999999993 | 0.341 | 0.299 | 0.264 | 0.234 | 0.209 | 0.188 | 0.17 | 0.154 | 0.14 | 0.128 | 0.117 |
| 0.095999999999993 | 0.341 | 0.299 | 0.264 | 0.234 | 0.209 | 0.188 | 0.17 | 0.154 | 0.14 | 0.128 | 0.117 |
| 0.096749999999993 | 0.341 | 0.299 | 0.264 | 0.234 | 0.209 | 0.188 | 0.17 | 0.154 | 0.14 | 0.128 | 0.117 |
| 0.097499999999993 | 0.341 | 0.299 | 0.263 | 0.234 | 0.209 | 0.188 | 0.17 | 0.154 | 0.14 | 0.128 | 0.117 |
| 0.098249999999993 | 0.341 | 0.298 | 0.263 | 0.234 | 0.209 | 0.188 | 0.17 | 0.154 | 0.14 | 0.128 | 0.117 |
| 0.098999999999993 | 0.341 | 0.298 | 0.263 | 0.234 | 0.209 | 0.188 | 0.17 | 0.154 | 0.14 | 0.128 | 0.117 |
| 0.099749999999993 | 0.341 | 0.298 | 0.263 | 0.234 | 0.209 | 0.188 | 0.169 | 0.154 | 0.14 | 0.128 | 0.117 |
| 0.100499999999993 | 0.341 | 0.298 | 0.263 | 0.234 | 0.209 | 0.188 | 0.169 | 0.154 | 0.14 | 0.128 | 0.117 |
| 0.101249999999993 | 0.341 | 0.298 | 0.263 | 0.234 | 0.209 | 0.188 | 0.169 | 0.153 | 0.14 | 0.127 | 0.117 |
| 0.101999999999993 | 0.341 | 0.298 | 0.263 | 0.234 | 0.209 | 0.187 | 0.169 | 0.153 | 0.139 | 0.127 | 0.117 |
| 0.102749999999993 | 0.341 | 0.298 | 0.263 | 0.234 | 0.209 | 0.187 | 0.169 | 0.153 | 0.139 | 0.127 | 0.117 |
| 0.103499999999993 | 0.34 | 0.298 | 0.263 | 0.234 | 0.209 | 0.187 | 0.169 | 0.153 | 0.139 | 0.127 | 0.116 |
| 0.104249999999993 | 0.34 | 0.298 | 0.263 | 0.233 | 0.209 | 0.187 | 0.169 | 0.153 | 0.139 | 0.127 | 0.116 |
| 0.104999999999993 | 0.34 | 0.298 | 0.263 | 0.233 | 0.208 | 0.187 | 0.169 | 0.153 | 0.139 | 0.127 | 0.116 |
| 0.105749999999993 | 0.34 | 0.298 | 0.263 | 0.233 | 0.208 | 0.187 | 0.169 | 0.153 | 0.139 | 0.127 | 0.116 |
| 0.106499999999993 | 0.34 | 0.298 | 0.263 | 0.233 | 0.208 | 0.187 | 0.169 | 0.153 | 0.139 | 0.127 | 0.116 |
| 0.107249999999993 | 0.34 | 0.298 | 0.263 | 0.233 | 0.208 | 0.187 | 0.169 | 0.153 | 0.139 | 0.127 | 0.116 |
| 0.107999999999993 | 0.34 | 0.298 | 0.263 | 0.233 | 0.208 | 0.187 | 0.168 | 0.153 | 0.139 | 0.127 | 0.116 |
| 0.108749999999993 | 0.34 | 0.298 | 0.262 | 0.233 | 0.208 | 0.187 | 0.168 | 0.152 | 0.139 | 0.126 | 0.116 |
| 0.109499999999993 | 0.34 | 0.298 | 0.262 | 0.233 | 0.208 | 0.187 | 0.168 | 0.152 | 0.139 | 0.126 | 0.116 |
| 0.110249999999993 | 0.34 | 0.298 | 0.262 | 0.233 | 0.208 | 0.187 | 0.168 | 0.152 | 0.138 | 0.126 | 0.115 |
| 0.110999999999993 | 0.34 | 0.297 | 0.262 | 0.233 | 0.208 | 0.186 | 0.168 | 0.152 | 0.138 | 0.126 | 0.115 |
| 0.111749999999993 | 0.34 | 0.297 | 0.262 | 0.233 | 0.208 | 0.186 | 0.168 | 0.152 | 0.138 | 0.126 | 0.115 |
| 0.112499999999993 | 0.34 | 0.297 | 0.262 | 0.233 | 0.208 | 0.186 | 0.168 | 0.152 | 0.138 | 0.126 | 0.115 |
| 0.113249999999993 | 0.34 | 0.297 | 0.262 | 0.232 | 0.207 | 0.186 | 0.168 | 0.152 | 0.138 | 0.126 | 0.115 |
| 0.113999999999993 | 0.34 | 0.297 | 0.262 | 0.232 | 0.207 | 0.186 | 0.168 | 0.152 | 0.138 | 0.126 | 0.115 |
| 0.114749999999993 | 0.34 | 0.297 | 0.262 | 0.232 | 0.207 | 0.186 | 0.168 | 0.152 | 0.138 | 0.126 | 0.115 |
| 0.115499999999993 | 0.34 | 0.297 | 0.262 | 0.232 | 0.207 | 0.186 | 0.167 | 0.152 | 0.138 | 0.125 | 0.115 |
| 0.116249999999993 | 0.34 | 0.297 | 0.262 | 0.232 | 0.207 | 0.186 | 0.167 | 0.151 | 0.138 | 0.125 | 0.115 |
| 0.116999999999993 | 0.339 | 0.297 | 0.262 | 0.232 | 0.207 | 0.186 | 0.167 | 0.151 | 0.137 | 0.125 | 0.114 |
| 0.117749999999993 | 0.339 | 0.297 | 0.262 | 0.232 | 0.207 | 0.186 | 0.167 | 0.151 | 0.137 | 0.125 | 0.114 |
| 0.118499999999993 | 0.339 | 0.297 | 0.261 | 0.232 | 0.207 | 0.185 | 0.167 | 0.151 | 0.137 | 0.125 | 0.114 |
| 0.119249999999993 | 0.339 | 0.297 | 0.261 | 0.232 | 0.207 | 0.185 | 0.167 | 0.151 | 0.137 | 0.125 | 0.114 |
| 0.119999999999993 | 0.339 | 0.297 | 0.261 | 0.232 | 0.207 | 0.185 | 0.167 | 0.151 | 0.137 | 0.125 | 0.114 |
| 0.120749999999993 | 0.339 | 0.297 | 0.261 | 0.232 | 0.207 | 0.185 | 0.167 | 0.151 | 0.137 | 0.125 | 0.114 |
| 0.121499999999993 | 0.339 | 0.296 | 0.261 | 0.232 | 0.206 | 0.185 | 0.167 | 0.151 | 0.137 | 0.125 | 0.114 |
| 0.122249999999993 | 0.339 | 0.296 | 0.261 | 0.231 | 0.206 | 0.185 | 0.167 | 0.151 | 0.137 | 0.124 | 0.114 |
| 0.122999999999993 | 0.339 | 0.296 | 0.261 | 0.231 | 0.206 | 0.185 | 0.166 | 0.15 | 0.137 | 0.124 | 0.114 |
| 0.123749999999993 | 0.339 | 0.296 | 0.261 | 0.231 | 0.206 | 0.185 | 0.166 | 0.15 | 0.136 | 0.124 | 0.113 |
| 0.124499999999993 | 0.339 | 0.296 | 0.261 | 0.231 | 0.206 | 0.185 | 0.166 | 0.15 | 0.136 | 0.124 | 0.113 |
| 0.125249999999993 | 0.339 | 0.296 | 0.261 | 0.231 | 0.206 | 0.185 | 0.166 | 0.15 | 0.136 | 0.124 | 0.113 |
| 0.125999999999993 | 0.339 | 0.296 | 0.261 | 0.231 | 0.206 | 0.184 | 0.166 | 0.15 | 0.136 | 0.124 | 0.113 |
| 0.126749999999993 | 0.339 | 0.296 | 0.261 | 0.231 | 0.206 | 0.184 | 0.166 | 0.15 | 0.136 | 0.124 | 0.113 |
| 0.127499999999993 | 0.339 | 0.296 | 0.26 | 0.231 | 0.206 | 0.184 | 0.166 | 0.15 | 0.136 | 0.124 | 0.113 |
| 0.128249999999993 | 0.338 | 0.296 | 0.26 | 0.231 | 0.206 | 0.184 | 0.166 | 0.15 | 0.136 | 0.123 | 0.113 |
| 0.128999999999993 | 0.338 | 0.296 | 0.26 | 0.231 | 0.205 | 0.184 | 0.166 | 0.15 | 0.136 | 0.123 | 0.113 |
| 0.129749999999993 | 0.338 | 0.296 | 0.26 | 0.23 | 0.205 | 0.184 | 0.165 | 0.149 | 0.135 | 0.123 | 0.112 |
| 0.130499999999993 | 0.338 | 0.296 | 0.26 | 0.23 | 0.205 | 0.184 | 0.165 | 0.149 | 0.135 | 0.123 | 0.112 |
| 0.131249999999993 | 0.338 | 0.295 | 0.26 | 0.23 | 0.205 | 0.184 | 0.165 | 0.149 | 0.135 | 0.123 | 0.112 |
| 0.131999999999993 | 0.338 | 0.295 | 0.26 | 0.23 | 0.205 | 0.184 | 0.165 | 0.149 | 0.135 | 0.123 | 0.112 |
| 0.132749999999993 | 0.338 | 0.295 | 0.26 | 0.23 | 0.205 | 0.183 | 0.165 | 0.149 | 0.135 | 0.123 | 0.112 |
| 0.133499999999993 | 0.338 | 0.295 | 0.26 | 0.23 | 0.205 | 0.183 | 0.165 | 0.149 | 0.135 | 0.123 | 0.112 |
| 0.134249999999993 | 0.338 | 0.295 | 0.26 | 0.23 | 0.205 | 0.183 | 0.165 | 0.149 | 0.135 | 0.122 | 0.112 |
| 0.134999999999993 | 0.338 | 0.295 | 0.26 | 0.23 | 0.205 | 0.183 | 0.165 | 0.149 | 0.135 | 0.122 | 0.112 |
| 0.135749999999993 | 0.338 | 0.295 | 0.259 | 0.23 | 0.205 | 0.183 | 0.165 | 0.148 | 0.134 | 0.122 | 0.111 |
| 0.136499999999993 | 0.338 | 0.295 | 0.259 | 0.23 | 0.204 | 0.183 | 0.164 | 0.148 | 0.134 | 0.122 | 0.111 |
| 0.137249999999993 | 0.338 | 0.295 | 0.259 | 0.229 | 0.204 | 0.183 | 0.164 | 0.148 | 0.134 | 0.122 | 0.111 |
| 0.137999999999993 | 0.338 | 0.295 | 0.259 | 0.229 | 0.204 | 0.183 | 0.164 | 0.148 | 0.134 | 0.122 | 0.111 |
| 0.138749999999993 | 0.337 | 0.295 | 0.259 | 0.229 | 0.204 | 0.183 | 0.164 | 0.148 | 0.134 | 0.122 | 0.111 |
| 0.139499999999993 | 0.337 | 0.294 | 0.259 | 0.229 | 0.204 | 0.182 | 0.164 | 0.148 | 0.134 | 0.122 | 0.111 |
| 0.140249999999993 | 0.337 | 0.294 | 0.259 | 0.229 | 0.204 | 0.182 | 0.164 | 0.148 | 0.134 | 0.121 | 0.111 |
| 0.140999999999993 | 0.337 | 0.294 | 0.259 | 0.229 | 0.204 | 0.182 | 0.164 | 0.148 | 0.134 | 0.121 | 0.11 |
| 0.141749999999993 | 0.337 | 0.294 | 0.259 | 0.229 | 0.204 | 0.182 | 0.164 | 0.147 | 0.133 | 0.121 | 0.11 |
| 0.142499999999993 | 0.337 | 0.294 | 0.259 | 0.229 | 0.203 | 0.182 | 0.163 | 0.147 | 0.133 | 0.121 | 0.11 |
| 0.143249999999993 | 0.337 | 0.294 | 0.258 | 0.229 | 0.203 | 0.182 | 0.163 | 0.147 | 0.133 | 0.121 | 0.11 |
| 0.143999999999993 | 0.337 | 0.294 | 0.258 | 0.228 | 0.203 | 0.182 | 0.163 | 0.147 | 0.133 | 0.121 | 0.11 |
| 0.144749999999993 | 0.337 | 0.294 | 0.258 | 0.228 | 0.203 | 0.182 | 0.163 | 0.147 | 0.133 | 0.121 | 0.11 |
| 0.145499999999993 | 0.337 | 0.294 | 0.258 | 0.228 | 0.203 | 0.181 | 0.163 | 0.147 | 0.133 | 0.12 | 0.11 |
| 0.146249999999993 | 0.337 | 0.294 | 0.258 | 0.228 | 0.203 | 0.181 | 0.163 | 0.147 | 0.133 | 0.12 | 0.109 |
| 0.146999999999993 | 0.336 | 0.294 | 0.258 | 0.228 | 0.203 | 0.181 | 0.163 | 0.147 | 0.133 | 0.12 | 0.109 |
| 0.147749999999993 | 0.336 | 0.293 | 0.258 | 0.228 | 0.203 | 0.181 | 0.163 | 0.146 | 0.132 | 0.12 | 0.109 |
| 0.148499999999993 | 0.336 | 0.293 | 0.258 | 0.228 | 0.203 | 0.181 | 0.162 | 0.146 | 0.132 | 0.12 | 0.109 |
| 0.149249999999993 | 0.336 | 0.293 | 0.258 | 0.228 | 0.202 | 0.181 | 0.162 | 0.146 | 0.132 | 0.12 | 0.109 |
| 0.149999999999993 | 0.336 | 0.293 | 0.257 | 0.228 | 0.202 | 0.181 | 0.162 | 0.146 | 0.132 | 0.12 | 0.109 |
| 0.150749999999993 | 0.336 | 0.293 | 0.257 | 0.227 | 0.202 | 0.181 | 0.162 | 0.146 | 0.132 | 0.12 | 0.109 |
| 0.151499999999993 | 0.336 | 0.293 | 0.257 | 0.227 | 0.202 | 0.18 | 0.162 | 0.146 | 0.132 | 0.119 | 0.108 |
| 0.152249999999993 | 0.336 | 0.293 | 0.257 | 0.227 | 0.202 | 0.18 | 0.162 | 0.146 | 0.132 | 0.119 | 0.108 |
| 0.152999999999993 | 0.336 | 0.293 | 0.257 | 0.227 | 0.202 | 0.18 | 0.162 | 0.145 | 0.131 | 0.119 | 0.108 |
| 0.153749999999993 | 0.336 | 0.293 | 0.257 | 0.227 | 0.202 | 0.18 | 0.161 | 0.145 | 0.131 | 0.119 | 0.108 |
| 0.154499999999993 | 0.336 | 0.292 | 0.257 | 0.227 | 0.202 | 0.18 | 0.161 | 0.145 | 0.131 | 0.119 | 0.108 |
| 0.155249999999993 | 0.335 | 0.292 | 0.257 | 0.227 | 0.201 | 0.18 | 0.161 | 0.145 | 0.131 | 0.119 | 0.108 |
| 0.155999999999993 | 0.335 | 0.292 | 0.257 | 0.227 | 0.201 | 0.18 | 0.161 | 0.145 | 0.131 | 0.118 | 0.108 |
| 0.156749999999993 | 0.335 | 0.292 | 0.256 | 0.227 | 0.201 | 0.18 | 0.161 | 0.145 | 0.131 | 0.118 | 0.107 |
| 0.157499999999993 | 0.335 | 0.292 | 0.256 | 0.226 | 0.201 | 0.179 | 0.161 | 0.145 | 0.131 | 0.118 | 0.107 |
| 0.158249999999993 | 0.335 | 0.292 | 0.256 | 0.226 | 0.201 | 0.179 | 0.161 | 0.144 | 0.13 | 0.118 | 0.107 |
| 0.158999999999993 | 0.335 | 0.292 | 0.256 | 0.226 | 0.201 | 0.179 | 0.16 | 0.144 | 0.13 | 0.118 | 0.107 |
| 0.159749999999993 | 0.335 | 0.292 | 0.256 | 0.226 | 0.201 | 0.179 | 0.16 | 0.144 | 0.13 | 0.118 | 0.107 |
| 0.160499999999993 | 0.335 | 0.292 | 0.256 | 0.226 | 0.201 | 0.179 | 0.16 | 0.144 | 0.13 | 0.118 | 0.107 |
| 0.161249999999993 | 0.335 | 0.292 | 0.256 | 0.226 | 0.2 | 0.179 | 0.16 | 0.144 | 0.13 | 0.117 | 0.107 |
| 0.161999999999993 | 0.335 | 0.291 | 0.256 | 0.226 | 0.2 | 0.179 | 0.16 | 0.144 | 0.13 | 0.117 | 0.106 |
| 0.162749999999993 | 0.334 | 0.291 | 0.256 | 0.226 | 0.2 | 0.178 | 0.16 | 0.144 | 0.13 | 0.117 | 0.106 |
| 0.163499999999993 | 0.334 | 0.291 | 0.255 | 0.225 | 0.2 | 0.178 | 0.16 | 0.143 | 0.129 | 0.117 | 0.106 |
| 0.164249999999993 | 0.334 | 0.291 | 0.255 | 0.225 | 0.2 | 0.178 | 0.16 | 0.143 | 0.129 | 0.117 | 0.106 |
| 0.164999999999993 | 0.334 | 0.291 | 0.255 | 0.225 | 0.2 | 0.178 | 0.159 | 0.143 | 0.129 | 0.117 | 0.106 |
| 0.165749999999993 | 0.334 | 0.291 | 0.255 | 0.225 | 0.2 | 0.178 | 0.159 | 0.143 | 0.129 | 0.117 | 0.106 |
| 0.166499999999993 | 0.334 | 0.291 | 0.255 | 0.225 | 0.199 | 0.178 | 0.159 | 0.143 | 0.129 | 0.116 | 0.105 |
| 0.167249999999993 | 0.334 | 0.291 | 0.255 | 0.225 | 0.199 | 0.178 | 0.159 | 0.143 | 0.129 | 0.116 | 0.105 |
| 0.167999999999993 | 0.334 | 0.291 | 0.255 | 0.225 | 0.199 | 0.177 | 0.159 | 0.143 | 0.128 | 0.116 | 0.105 |
| 0.168749999999993 | 0.334 | 0.29 | 0.255 | 0.224 | 0.199 | 0.177 | 0.159 | 0.142 | 0.128 | 0.116 | 0.105 |
| 0.169499999999993 | 0.334 | 0.29 | 0.254 | 0.224 | 0.199 | 0.177 | 0.158 | 0.142 | 0.128 | 0.116 | 0.105 |
| 0.170249999999993 | 0.333 | 0.29 | 0.254 | 0.224 | 0.199 | 0.177 | 0.158 | 0.142 | 0.128 | 0.116 | 0.105 |
| 0.170999999999993 | 0.333 | 0.29 | 0.254 | 0.224 | 0.199 | 0.177 | 0.158 | 0.142 | 0.128 | 0.115 | 0.104 |
| 0.171749999999993 | 0.333 | 0.29 | 0.254 | 0.224 | 0.198 | 0.177 | 0.158 | 0.142 | 0.128 | 0.115 | 0.104 |
| 0.172499999999993 | 0.333 | 0.29 | 0.254 | 0.224 | 0.198 | 0.177 | 0.158 | 0.142 | 0.128 | 0.115 | 0.104 |
| 0.173249999999993 | 0.333 | 0.29 | 0.254 | 0.224 | 0.198 | 0.176 | 0.158 | 0.142 | 0.127 | 0.115 | 0.104 |
| 0.173999999999993 | 0.333 | 0.29 | 0.254 | 0.224 | 0.198 | 0.176 | 0.158 | 0.141 | 0.127 | 0.115 | 0.104 |
| 0.174749999999993 | 0.333 | 0.289 | 0.254 | 0.223 | 0.198 | 0.176 | 0.157 | 0.141 | 0.127 | 0.115 | 0.104 |
| 0.175499999999993 | 0.333 | 0.289 | 0.253 | 0.223 | 0.198 | 0.176 | 0.157 | 0.141 | 0.127 | 0.114 | 0.104 |
| 0.176249999999993 | 0.333 | 0.289 | 0.253 | 0.223 | 0.198 | 0.176 | 0.157 | 0.141 | 0.127 | 0.114 | 0.103 |
| 0.176999999999993 | 0.332 | 0.289 | 0.253 | 0.223 | 0.198 | 0.176 | 0.157 | 0.141 | 0.127 | 0.114 | 0.103 |
| 0.177749999999993 | 0.332 | 0.289 | 0.253 | 0.223 | 0.197 | 0.176 | 0.157 | 0.141 | 0.126 | 0.114 | 0.103 |
| 0.178499999999993 | 0.332 | 0.289 | 0.253 | 0.223 | 0.197 | 0.175 | 0.157 | 0.14 | 0.126 | 0.114 | 0.103 |
| 0.179249999999993 | 0.332 | 0.289 | 0.253 | 0.223 | 0.197 | 0.175 | 0.157 | 0.14 | 0.126 | 0.114 | 0.103 |
| 0.179999999999993 | 0.332 | 0.289 | 0.253 | 0.222 | 0.197 | 0.175 | 0.156 | 0.14 | 0.126 | 0.114 | 0.103 |
| 0.180749999999993 | 0.332 | 0.288 | 0.252 | 0.222 | 0.197 | 0.175 | 0.156 | 0.14 | 0.126 | 0.113 | 0.102 |
| 0.181499999999993 | 0.332 | 0.288 | 0.252 | 0.222 | 0.197 | 0.175 | 0.156 | 0.14 | 0.126 | 0.113 | 0.102 |
| 0.182249999999993 | 0.332 | 0.288 | 0.252 | 0.222 | 0.196 | 0.175 | 0.156 | 0.14 | 0.125 | 0.113 | 0.102 |
| 0.182999999999993 | 0.332 | 0.288 | 0.252 | 0.222 | 0.196 | 0.175 | 0.156 | 0.139 | 0.125 | 0.113 | 0.102 |
| 0.183749999999993 | 0.331 | 0.288 | 0.252 | 0.222 | 0.196 | 0.174 | 0.156 | 0.139 | 0.125 | 0.113 | 0.102 |
| 0.184499999999993 | 0.331 | 0.288 | 0.252 | 0.222 | 0.196 | 0.174 | 0.155 | 0.139 | 0.125 | 0.113 | 0.102 |
| 0.185249999999993 | 0.331 | 0.288 | 0.252 | 0.221 | 0.196 | 0.174 | 0.155 | 0.139 | 0.125 | 0.112 | 0.101 |
| 0.185999999999993 | 0.331 | 0.288 | 0.252 | 0.221 | 0.196 | 0.174 | 0.155 | 0.139 | 0.125 | 0.112 | 0.101 |
| 0.186749999999993 | 0.331 | 0.287 | 0.251 | 0.221 | 0.196 | 0.174 | 0.155 | 0.139 | 0.124 | 0.112 | 0.101 |
| 0.187499999999993 | 0.331 | 0.287 | 0.251 | 0.221 | 0.195 | 0.174 | 0.155 | 0.139 | 0.124 | 0.112 | 0.101 |
| 0.188249999999993 | 0.331 | 0.287 | 0.251 | 0.221 | 0.195 | 0.173 | 0.155 | 0.138 | 0.124 | 0.112 | 0.101 |
| 0.188999999999993 | 0.331 | 0.287 | 0.251 | 0.221 | 0.195 | 0.173 | 0.154 | 0.138 | 0.124 | 0.111 | 0.1 |
| 0.189749999999993 | 0.33 | 0.287 | 0.251 | 0.221 | 0.195 | 0.173 | 0.154 | 0.138 | 0.124 | 0.111 | 0.1 |
| 0.190499999999993 | 0.33 | 0.287 | 0.251 | 0.22 | 0.195 | 0.173 | 0.154 | 0.138 | 0.124 | 0.111 | 0.1 |
| 0.191249999999993 | 0.33 | 0.287 | 0.251 | 0.22 | 0.195 | 0.173 | 0.154 | 0.138 | 0.123 | 0.111 | 0.1 |
| 0.191999999999993 | 0.33 | 0.287 | 0.25 | 0.22 | 0.195 | 0.173 | 0.154 | 0.138 | 0.123 | 0.111 | 0.1 |
| 0.192749999999993 | 0.33 | 0.286 | 0.25 | 0.22 | 0.194 | 0.173 | 0.154 | 0.137 | 0.123 | 0.111 | 0.1 |
| 0.193499999999993 | 0.33 | 0.286 | 0.25 | 0.22 | 0.194 | 0.172 | 0.154 | 0.137 | 0.123 | 0.11 | 0.099 |
| 0.194249999999993 | 0.33 | 0.286 | 0.25 | 0.22 | 0.194 | 0.172 | 0.153 | 0.137 | 0.123 | 0.11 | 0.099 |
| 0.194999999999993 | 0.33 | 0.286 | 0.25 | 0.22 | 0.194 | 0.172 | 0.153 | 0.137 | 0.123 | 0.11 | 0.099 |
| 0.195749999999993 | 0.33 | 0.286 | 0.25 | 0.219 | 0.194 | 0.172 | 0.153 | 0.137 | 0.122 | 0.11 | 0.099 |
| 0.196499999999993 | 0.329 | 0.286 | 0.25 | 0.219 | 0.194 | 0.172 | 0.153 | 0.137 | 0.122 | 0.11 | 0.099 |
| 0.197249999999993 | 0.329 | 0.286 | 0.249 | 0.219 | 0.193 | 0.172 | 0.153 | 0.136 | 0.122 | 0.11 | 0.099 |
| 0.197999999999993 | 0.329 | 0.285 | 0.249 | 0.219 | 0.193 | 0.171 | 0.153 | 0.136 | 0.122 | 0.109 | 0.098 |
| 0.198749999999993 | 0.329 | 0.285 | 0.249 | 0.219 | 0.193 | 0.171 | 0.152 | 0.136 | 0.122 | 0.109 | 0.098 |
| 0.199499999999993 | 0.329 | 0.285 | 0.249 | 0.219 | 0.193 | 0.171 | 0.152 | 0.136 | 0.122 | 0.109 | 0.098 |
| 0.200249999999993 | 0.329 | 0.285 | 0.249 | 0.219 | 0.193 | 0.171 | 0.152 | 0.136 | 0.121 | 0.109 | 0.098 |
| 0.200999999999993 | 0.329 | 0.285 | 0.249 | 0.218 | 0.193 | 0.171 | 0.152 | 0.136 | 0.121 | 0.109 | 0.098 |
| 0.201749999999993 | 0.329 | 0.285 | 0.249 | 0.218 | 0.193 | 0.171 | 0.152 | 0.135 | 0.121 | 0.109 | 0.097 |
| 0.202499999999993 | 0.328 | 0.285 | 0.248 | 0.218 | 0.192 | 0.17 | 0.152 | 0.135 | 0.121 | 0.108 | 0.097 |
| 0.203249999999993 | 0.328 | 0.285 | 0.248 | 0.218 | 0.192 | 0.17 | 0.151 | 0.135 | 0.121 | 0.108 | 0.097 |
| 0.203999999999993 | 0.328 | 0.284 | 0.248 | 0.218 | 0.192 | 0.17 | 0.151 | 0.135 | 0.121 | 0.108 | 0.097 |
| 0.204749999999993 | 0.328 | 0.284 | 0.248 | 0.218 | 0.192 | 0.17 | 0.151 | 0.135 | 0.12 | 0.108 | 0.097 |
| 0.205499999999993 | 0.328 | 0.284 | 0.248 | 0.217 | 0.192 | 0.17 | 0.151 | 0.134 | 0.12 | 0.108 | 0.097 |
| 0.206249999999993 | 0.328 | 0.284 | 0.248 | 0.217 | 0.192 | 0.17 | 0.151 | 0.134 | 0.12 | 0.107 | 0.096 |
| 0.206999999999993 | 0.328 | 0.284 | 0.248 | 0.217 | 0.191 | 0.169 | 0.151 | 0.134 | 0.12 | 0.107 | 0.096 |
| 0.207749999999993 | 0.327 | 0.284 | 0.247 | 0.217 | 0.191 | 0.169 | 0.15 | 0.134 | 0.12 | 0.107 | 0.096 |
| 0.208499999999993 | 0.327 | 0.284 | 0.247 | 0.217 | 0.191 | 0.169 | 0.15 | 0.134 | 0.119 | 0.107 | 0.096 |
| 0.209249999999993 | 0.327 | 0.283 | 0.247 | 0.217 | 0.191 | 0.169 | 0.15 | 0.134 | 0.119 | 0.107 | 0.096 |
| 0.209999999999993 | 0.327 | 0.283 | 0.247 | 0.216 | 0.191 | 0.169 | 0.15 | 0.133 | 0.119 | 0.107 | 0.095 |
| 0.210749999999993 | 0.327 | 0.283 | 0.247 | 0.216 | 0.191 | 0.169 | 0.15 | 0.133 | 0.119 | 0.106 | 0.095 |
| 0.211499999999993 | 0.327 | 0.283 | 0.247 | 0.216 | 0.19 | 0.168 | 0.149 | 0.133 | 0.119 | 0.106 | 0.095 |
| 0.212249999999993 | 0.327 | 0.283 | 0.246 | 0.216 | 0.19 | 0.168 | 0.149 | 0.133 | 0.119 | 0.106 | 0.095 |
| 0.212999999999993 | 0.327 | 0.283 | 0.246 | 0.216 | 0.19 | 0.168 | 0.149 | 0.133 | 0.118 | 0.106 | 0.095 |
| 0.213749999999993 | 0.326 | 0.283 | 0.246 | 0.216 | 0.19 | 0.168 | 0.149 | 0.133 | 0.118 | 0.106 | 0.095 |
| 0.214499999999993 | 0.326 | 0.282 | 0.246 | 0.216 | 0.19 | 0.168 | 0.149 | 0.132 | 0.118 | 0.105 | 0.094 |
| 0.215249999999993 | 0.326 | 0.282 | 0.246 | 0.215 | 0.19 | 0.168 | 0.149 | 0.132 | 0.118 | 0.105 | 0.094 |
| 0.215999999999993 | 0.326 | 0.282 | 0.246 | 0.215 | 0.189 | 0.167 | 0.148 | 0.132 | 0.118 | 0.105 | 0.094 |
| 0.216749999999993 | 0.326 | 0.282 | 0.246 | 0.215 | 0.189 | 0.167 | 0.148 | 0.132 | 0.117 | 0.105 | 0.094 |
| 0.217499999999993 | 0.326 | 0.282 | 0.245 | 0.215 | 0.189 | 0.167 | 0.148 | 0.132 | 0.117 | 0.105 | 0.094 |
| 0.218249999999993 | 0.326 | 0.282 | 0.245 | 0.215 | 0.189 | 0.167 | 0.148 | 0.131 | 0.117 | 0.104 | 0.093 |
| 0.218999999999993 | 0.325 | 0.282 | 0.245 | 0.215 | 0.189 | 0.167 | 0.148 | 0.131 | 0.117 | 0.104 | 0.093 |
| 0.219749999999993 | 0.325 | 0.281 | 0.245 | 0.214 | 0.189 | 0.167 | 0.148 | 0.131 | 0.117 | 0.104 | 0.093 |
| 0.220499999999993 | 0.325 | 0.281 | 0.245 | 0.214 | 0.188 | 0.166 | 0.147 | 0.131 | 0.117 | 0.104 | 0.093 |
| 0.221249999999993 | 0.325 | 0.281 | 0.245 | 0.214 | 0.188 | 0.166 | 0.147 | 0.131 | 0.116 | 0.104 | 0.093 |
| 0.221999999999993 | 0.325 | 0.281 | 0.244 | 0.214 | 0.188 | 0.166 | 0.147 | 0.131 | 0.116 | 0.104 | 0.092 |
| 0.222749999999993 | 0.325 | 0.281 | 0.244 | 0.214 | 0.188 | 0.166 | 0.147 | 0.13 | 0.116 | 0.103 | 0.092 |
| 0.223499999999993 | 0.325 | 0.281 | 0.244 | 0.214 | 0.188 | 0.166 | 0.147 | 0.13 | 0.116 | 0.103 | 0.092 |
| 0.224249999999993 | 0.324 | 0.28 | 0.244 | 0.213 | 0.188 | 0.165 | 0.146 | 0.13 | 0.116 | 0.103 | 0.092 |
| 0.224999999999993 | 0.324 | 0.28 | 0.244 | 0.213 | 0.187 | 0.165 | 0.146 | 0.13 | 0.115 | 0.103 | 0.092 |
| 0.225749999999993 | 0.324 | 0.28 | 0.244 | 0.213 | 0.187 | 0.165 | 0.146 | 0.13 | 0.115 | 0.103 | 0.091 |
| 0.226499999999993 | 0.324 | 0.28 | 0.244 | 0.213 | 0.187 | 0.165 | 0.146 | 0.129 | 0.115 | 0.102 | 0.091 |
| 0.227249999999993 | 0.324 | 0.28 | 0.243 | 0.213 | 0.187 | 0.165 | 0.146 | 0.129 | 0.115 | 0.102 | 0.091 |
| 0.227999999999993 | 0.324 | 0.28 | 0.243 | 0.213 | 0.187 | 0.165 | 0.146 | 0.129 | 0.115 | 0.102 | 0.091 |
| 0.228749999999993 | 0.324 | 0.28 | 0.243 | 0.212 | 0.187 | 0.164 | 0.145 | 0.129 | 0.114 | 0.102 | 0.091 |
| 0.229499999999993 | 0.324 | 0.279 | 0.243 | 0.212 | 0.186 | 0.164 | 0.145 | 0.129 | 0.114 | 0.102 | 0.09 |
| 0.230249999999993 | 0.323 | 0.279 | 0.243 | 0.212 | 0.186 | 0.164 | 0.145 | 0.128 | 0.114 | 0.101 | 0.09 |
| 0.230999999999993 | 0.323 | 0.279 | 0.243 | 0.212 | 0.186 | 0.164 | 0.145 | 0.128 | 0.114 | 0.101 | 0.09 |
| 0.231749999999993 | 0.323 | 0.279 | 0.242 | 0.212 | 0.186 | 0.164 | 0.145 | 0.128 | 0.114 | 0.101 | 0.09 |
| 0.232499999999993 | 0.323 | 0.279 | 0.242 | 0.212 | 0.186 | 0.163 | 0.144 | 0.128 | 0.114 | 0.101 | 0.09 |
| 0.233249999999993 | 0.323 | 0.279 | 0.242 | 0.211 | 0.185 | 0.163 | 0.144 | 0.128 | 0.113 | 0.101 | 0.09 |
| 0.233999999999993 | 0.323 | 0.278 | 0.242 | 0.211 | 0.185 | 0.163 | 0.144 | 0.128 | 0.113 | 0.1 | 0.089 |
| 0.234749999999993 | 0.322 | 0.278 | 0.242 | 0.211 | 0.185 | 0.163 | 0.144 | 0.127 | 0.113 | 0.1 | 0.089 |
| 0.235499999999993 | 0.322 | 0.278 | 0.242 | 0.211 | 0.185 | 0.163 | 0.144 | 0.127 | 0.113 | 0.1 | 0.089 |
| 0.236249999999993 | 0.322 | 0.278 | 0.241 | 0.211 | 0.185 | 0.163 | 0.144 | 0.127 | 0.113 | 0.1 | 0.089 |
| 0.236999999999993 | 0.322 | 0.278 | 0.241 | 0.211 | 0.185 | 0.162 | 0.143 | 0.127 | 0.112 | 0.1 | 0.089 |
| 0.237749999999993 | 0.322 | 0.278 | 0.241 | 0.21 | 0.184 | 0.162 | 0.143 | 0.127 | 0.112 | 0.099 | 0.088 |
| 0.238499999999993 | 0.322 | 0.278 | 0.241 | 0.21 | 0.184 | 0.162 | 0.143 | 0.126 | 0.112 | 0.099 | 0.088 |
| 0.239249999999993 | 0.322 | 0.277 | 0.241 | 0.21 | 0.184 | 0.162 | 0.143 | 0.126 | 0.112 | 0.099 | 0.088 |
| 0.239999999999993 | 0.321 | 0.277 | 0.241 | 0.21 | 0.184 | 0.162 | 0.143 | 0.126 | 0.112 | 0.099 | 0.088 |
| 0.240749999999993 | 0.321 | 0.277 | 0.24 | 0.21 | 0.184 | 0.161 | 0.142 | 0.126 | 0.111 | 0.099 | 0.088 |
| 0.241499999999993 | 0.321 | 0.277 | 0.24 | 0.21 | 0.184 | 0.161 | 0.142 | 0.126 | 0.111 | 0.099 | 0.087 |
| 0.242249999999993 | 0.321 | 0.277 | 0.24 | 0.209 | 0.183 | 0.161 | 0.142 | 0.125 | 0.111 | 0.098 | 0.087 |
| 0.242999999999993 | 0.321 | 0.277 | 0.24 | 0.209 | 0.183 | 0.161 | 0.142 | 0.125 | 0.111 | 0.098 | 0.087 |
| 0.243749999999993 | 0.321 | 0.276 | 0.24 | 0.209 | 0.183 | 0.161 | 0.142 | 0.125 | 0.111 | 0.098 | 0.087 |
| 0.244499999999993 | 0.321 | 0.276 | 0.24 | 0.209 | 0.183 | 0.161 | 0.141 | 0.125 | 0.11 | 0.098 | 0.087 |
| 0.245249999999993 | 0.32 | 0.276 | 0.239 | 0.209 | 0.183 | 0.16 | 0.141 | 0.125 | 0.11 | 0.098 | 0.086 |
| 0.245999999999993 | 0.32 | 0.276 | 0.239 | 0.208 | 0.182 | 0.16 | 0.141 | 0.124 | 0.11 | 0.097 | 0.086 |
| 0.246749999999993 | 0.32 | 0.276 | 0.239 | 0.208 | 0.182 | 0.16 | 0.141 | 0.124 | 0.11 | 0.097 | 0.086 |
| 0.247499999999993 | 0.32 | 0.276 | 0.239 | 0.208 | 0.182 | 0.16 | 0.141 | 0.124 | 0.11 | 0.097 | 0.086 |
| 0.248249999999993 | 0.32 | 0.275 | 0.239 | 0.208 | 0.182 | 0.16 | 0.14 | 0.124 | 0.109 | 0.097 | 0.085 |
| 0.248999999999993 | 0.32 | 0.275 | 0.239 | 0.208 | 0.182 | 0.159 | 0.14 | 0.124 | 0.109 | 0.097 | 0.085 |
| 0.249749999999993 | 0.32 | 0.275 | 0.238 | 0.208 | 0.182 | 0.159 | 0.14 | 0.124 | 0.109 | 0.096 | 0.085 |
| 0.250499999999993 | 0.319 | 0.275 | 0.238 | 0.207 | 0.181 | 0.159 | 0.14 | 0.123 | 0.109 | 0.096 | 0.085 |
| 0.251249999999993 | 0.319 | 0.275 | 0.238 | 0.207 | 0.181 | 0.159 | 0.14 | 0.123 | 0.109 | 0.096 | 0.085 |
| 0.251999999999993 | 0.319 | 0.275 | 0.238 | 0.207 | 0.181 | 0.159 | 0.14 | 0.123 | 0.108 | 0.096 | 0.084 |
| 0.252749999999993 | 0.319 | 0.275 | 0.238 | 0.207 | 0.181 | 0.159 | 0.139 | 0.123 | 0.108 | 0.095 | 0.084 |
| 0.253499999999993 | 0.319 | 0.274 | 0.238 | 0.207 | 0.181 | 0.158 | 0.139 | 0.123 | 0.108 | 0.095 | 0.084 |
| 0.254249999999993 | 0.319 | 0.274 | 0.237 | 0.207 | 0.18 | 0.158 | 0.139 | 0.122 | 0.108 | 0.095 | 0.084 |
| 0.254999999999993 | 0.318 | 0.274 | 0.237 | 0.206 | 0.18 | 0.158 | 0.139 | 0.122 | 0.108 | 0.095 | 0.084 |
| 0.255749999999993 | 0.318 | 0.274 | 0.237 | 0.206 | 0.18 | 0.158 | 0.139 | 0.122 | 0.107 | 0.095 | 0.083 |
| 0.256499999999993 | 0.318 | 0.274 | 0.237 | 0.206 | 0.18 | 0.158 | 0.138 | 0.122 | 0.107 | 0.094 | 0.083 |
| 0.257249999999993 | 0.318 | 0.274 | 0.237 | 0.206 | 0.18 | 0.157 | 0.138 | 0.122 | 0.107 | 0.094 | 0.083 |
| 0.257999999999993 | 0.318 | 0.273 | 0.237 | 0.206 | 0.18 | 0.157 | 0.138 | 0.121 | 0.107 | 0.094 | 0.083 |
| 0.258749999999993 | 0.318 | 0.273 | 0.236 | 0.205 | 0.179 | 0.157 | 0.138 | 0.121 | 0.107 | 0.094 | 0.083 |
| 0.259499999999993 | 0.318 | 0.273 | 0.236 | 0.205 | 0.179 | 0.157 | 0.138 | 0.121 | 0.106 | 0.094 | 0.082 |
| 0.260249999999993 | 0.317 | 0.273 | 0.236 | 0.205 | 0.179 | 0.157 | 0.137 | 0.121 | 0.106 | 0.093 | 0.082 |
| 0.260999999999993 | 0.317 | 0.273 | 0.236 | 0.205 | 0.179 | 0.156 | 0.137 | 0.121 | 0.106 | 0.093 | 0.082 |
| 0.261749999999993 | 0.317 | 0.273 | 0.236 | 0.205 | 0.179 | 0.156 | 0.137 | 0.12 | 0.106 | 0.093 | 0.082 |
| 0.262499999999993 | 0.317 | 0.272 | 0.235 | 0.205 | 0.178 | 0.156 | 0.137 | 0.12 | 0.106 | 0.093 | 0.082 |
| 0.263249999999993 | 0.317 | 0.272 | 0.235 | 0.204 | 0.178 | 0.156 | 0.137 | 0.12 | 0.105 | 0.093 | 0.081 |
| 0.263999999999993 | 0.317 | 0.272 | 0.235 | 0.204 | 0.178 | 0.156 | 0.136 | 0.12 | 0.105 | 0.092 | 0.081 |
| 0.264749999999993 | 0.316 | 0.272 | 0.235 | 0.204 | 0.178 | 0.155 | 0.136 | 0.12 | 0.105 | 0.092 | 0.081 |
| 0.265499999999993 | 0.316 | 0.272 | 0.235 | 0.204 | 0.178 | 0.155 | 0.136 | 0.119 | 0.105 | 0.092 | 0.081 |
| 0.266249999999993 | 0.316 | 0.272 | 0.235 | 0.204 | 0.177 | 0.155 | 0.136 | 0.119 | 0.105 | 0.092 | 0.081 |
| 0.266999999999993 | 0.316 | 0.271 | 0.234 | 0.203 | 0.177 | 0.155 | 0.136 | 0.119 | 0.104 | 0.092 | 0.08 |
| 0.267749999999993 | 0.316 | 0.271 | 0.234 | 0.203 | 0.177 | 0.155 | 0.135 | 0.119 | 0.104 | 0.091 | 0.08 |
| 0.268499999999992 | 0.316 | 0.271 | 0.234 | 0.203 | 0.177 | 0.154 | 0.135 | 0.119 | 0.104 | 0.091 | 0.08 |
| 0.269249999999992 | 0.316 | 0.271 | 0.234 | 0.203 | 0.177 | 0.154 | 0.135 | 0.118 | 0.104 | 0.091 | 0.08 |
| 0.269999999999992 | 0.315 | 0.271 | 0.234 | 0.203 | 0.177 | 0.154 | 0.135 | 0.118 | 0.104 | 0.091 | 0.079 |
| 0.270749999999992 | 0.315 | 0.271 | 0.234 | 0.203 | 0.176 | 0.154 | 0.135 | 0.118 | 0.103 | 0.091 | 0.079 |
| 0.271499999999992 | 0.315 | 0.27 | 0.233 | 0.202 | 0.176 | 0.154 | 0.134 | 0.118 | 0.103 | 0.09 | 0.079 |
| 0.272249999999992 | 0.315 | 0.27 | 0.233 | 0.202 | 0.176 | 0.154 | 0.134 | 0.118 | 0.103 | 0.09 | 0.079 |
| 0.272999999999992 | 0.315 | 0.27 | 0.233 | 0.202 | 0.176 | 0.153 | 0.134 | 0.117 | 0.103 | 0.09 | 0.079 |
| 0.273749999999992 | 0.315 | 0.27 | 0.233 | 0.202 | 0.176 | 0.153 | 0.134 | 0.117 | 0.103 | 0.09 | 0.078 |
| 0.274499999999992 | 0.314 | 0.27 | 0.233 | 0.202 | 0.175 | 0.153 | 0.134 | 0.117 | 0.102 | 0.09 | 0.078 |
| 0.275249999999992 | 0.314 | 0.27 | 0.233 | 0.201 | 0.175 | 0.153 | 0.133 | 0.117 | 0.102 | 0.089 | 0.078 |
| 0.275999999999992 | 0.314 | 0.269 | 0.232 | 0.201 | 0.175 | 0.153 | 0.133 | 0.117 | 0.102 | 0.089 | 0.078 |
| 0.276749999999992 | 0.314 | 0.269 | 0.232 | 0.201 | 0.175 | 0.152 | 0.133 | 0.116 | 0.102 | 0.089 | 0.078 |
| 0.277499999999992 | 0.314 | 0.269 | 0.232 | 0.201 | 0.175 | 0.152 | 0.133 | 0.116 | 0.101 | 0.089 | 0.077 |
| 0.278249999999992 | 0.314 | 0.269 | 0.232 | 0.201 | 0.174 | 0.152 | 0.133 | 0.116 | 0.101 | 0.088 | 0.077 |
| 0.278999999999992 | 0.313 | 0.269 | 0.232 | 0.201 | 0.174 | 0.152 | 0.132 | 0.116 | 0.101 | 0.088 | 0.077 |
| 0.279749999999992 | 0.313 | 0.269 | 0.231 | 0.2 | 0.174 | 0.152 | 0.132 | 0.115 | 0.101 | 0.088 | 0.077 |
| 0.280499999999992 | 0.313 | 0.268 | 0.231 | 0.2 | 0.174 | 0.151 | 0.132 | 0.115 | 0.101 | 0.088 | 0.076 |
| 0.281249999999992 | 0.313 | 0.268 | 0.231 | 0.2 | 0.174 | 0.151 | 0.132 | 0.115 | 0.1 | 0.088 | 0.076 |
| 0.281999999999992 | 0.313 | 0.268 | 0.231 | 0.2 | 0.173 | 0.151 | 0.132 | 0.115 | 0.1 | 0.087 | 0.076 |
| 0.282749999999992 | 0.313 | 0.268 | 0.231 | 0.2 | 0.173 | 0.151 | 0.131 | 0.115 | 0.1 | 0.087 | 0.076 |
| 0.283499999999992 | 0.312 | 0.268 | 0.231 | 0.199 | 0.173 | 0.151 | 0.131 | 0.114 | 0.1 | 0.087 | 0.076 |
| 0.284249999999992 | 0.312 | 0.268 | 0.23 | 0.199 | 0.173 | 0.15 | 0.131 | 0.114 | 0.1 | 0.087 | 0.075 |
| 0.284999999999992 | 0.312 | 0.267 | 0.23 | 0.199 | 0.173 | 0.15 | 0.131 | 0.114 | 0.099 | 0.087 | 0.075 |
| 0.285749999999992 | 0.312 | 0.267 | 0.23 | 0.199 | 0.172 | 0.15 | 0.131 | 0.114 | 0.099 | 0.086 | 0.075 |
| 0.286499999999992 | 0.312 | 0.267 | 0.23 | 0.199 | 0.172 | 0.15 | 0.13 | 0.114 | 0.099 | 0.086 | 0.075 |
| 0.287249999999992 | 0.312 | 0.267 | 0.23 | 0.198 | 0.172 | 0.15 | 0.13 | 0.113 | 0.099 | 0.086 | 0.075 |
| 0.287999999999992 | 0.312 | 0.267 | 0.229 | 0.198 | 0.172 | 0.149 | 0.13 | 0.113 | 0.099 | 0.086 | 0.074 |
| 0.288749999999992 | 0.311 | 0.266 | 0.229 | 0.198 | 0.172 | 0.149 | 0.13 | 0.113 | 0.098 | 0.085 | 0.074 |
| 0.289499999999992 | 0.311 | 0.266 | 0.229 | 0.198 | 0.172 | 0.149 | 0.13 | 0.113 | 0.098 | 0.085 | 0.074 |
| 0.290249999999992 | 0.311 | 0.266 | 0.229 | 0.198 | 0.171 | 0.149 | 0.129 | 0.113 | 0.098 | 0.085 | 0.074 |
| 0.290999999999992 | 0.311 | 0.266 | 0.229 | 0.198 | 0.171 | 0.149 | 0.129 | 0.112 | 0.098 | 0.085 | 0.073 |
| 0.291749999999992 | 0.311 | 0.266 | 0.229 | 0.197 | 0.171 | 0.148 | 0.129 | 0.112 | 0.098 | 0.085 | 0.073 |
| 0.292499999999992 | 0.311 | 0.266 | 0.228 | 0.197 | 0.171 | 0.148 | 0.129 | 0.112 | 0.097 | 0.084 | 0.073 |
| 0.293249999999992 | 0.31 | 0.265 | 0.228 | 0.197 | 0.171 | 0.148 | 0.129 | 0.112 | 0.097 | 0.084 | 0.073 |
| 0.293999999999992 | 0.31 | 0.265 | 0.228 | 0.197 | 0.17 | 0.148 | 0.128 | 0.112 | 0.097 | 0.084 | 0.073 |
| 0.294749999999992 | 0.31 | 0.265 | 0.228 | 0.197 | 0.17 | 0.148 | 0.128 | 0.111 | 0.097 | 0.084 | 0.072 |
| 0.295499999999992 | 0.31 | 0.265 | 0.228 | 0.196 | 0.17 | 0.147 | 0.128 | 0.111 | 0.096 | 0.084 | 0.072 |
| 0.296249999999991 | 0.31 | 0.265 | 0.227 | 0.196 | 0.17 | 0.147 | 0.128 | 0.111 | 0.096 | 0.083 | 0.072 |
| 0.296999999999991 | 0.31 | 0.265 | 0.227 | 0.196 | 0.17 | 0.147 | 0.128 | 0.111 | 0.096 | 0.083 | 0.072 |
| 0.297749999999991 | 0.309 | 0.264 | 0.227 | 0.196 | 0.169 | 0.147 | 0.127 | 0.111 | 0.096 | 0.083 | 0.072 |
| 0.298499999999991 | 0.309 | 0.264 | 0.227 | 0.196 | 0.169 | 0.147 | 0.127 | 0.11 | 0.096 | 0.083 | 0.071 |
| 0.299249999999991 | 0.309 | 0.264 | 0.227 | 0.195 | 0.169 | 0.146 | 0.127 | 0.11 | 0.095 | 0.082 | 0.071 |
| 0.299999999999991 | 0.309 | 0.264 | 0.227 | 0.195 | 0.169 | 0.146 | 0.127 | 0.11 | 0.095 | 0.082 | 0.071 |
| 0.300749999999991 | 0.309 | 0.264 | 0.226 | 0.195 | 0.169 | 0.146 | 0.127 | 0.11 | 0.095 | 0.082 | 0.071 |
| 0.301499999999991 | 0.309 | 0.264 | 0.226 | 0.195 | 0.168 | 0.146 | 0.126 | 0.109 | 0.095 | 0.082 | 0.07 |
| 0.302249999999991 | 0.308 | 0.263 | 0.226 | 0.195 | 0.168 | 0.146 | 0.126 | 0.109 | 0.095 | 0.082 | 0.07 |
| 0.302999999999991 | 0.308 | 0.263 | 0.226 | 0.195 | 0.168 | 0.145 | 0.126 | 0.109 | 0.094 | 0.081 | 0.07 |
| 0.303749999999991 | 0.308 | 0.263 | 0.226 | 0.194 | 0.168 | 0.145 | 0.126 | 0.109 | 0.094 | 0.081 | 0.07 |
| 0.304499999999991 | 0.308 | 0.263 | 0.225 | 0.194 | 0.168 | 0.145 | 0.126 | 0.109 | 0.094 | 0.081 | 0.07 |
| 0.305249999999991 | 0.308 | 0.263 | 0.225 | 0.194 | 0.167 | 0.145 | 0.125 | 0.108 | 0.094 | 0.081 | 0.069 |
| 0.305999999999991 | 0.308 | 0.262 | 0.225 | 0.194 | 0.167 | 0.145 | 0.125 | 0.108 | 0.093 | 0.081 | 0.069 |
| 0.306749999999991 | 0.307 | 0.262 | 0.225 | 0.194 | 0.167 | 0.144 | 0.125 | 0.108 | 0.093 | 0.08 | 0.069 |
| 0.307499999999991 | 0.307 | 0.262 | 0.225 | 0.193 | 0.167 | 0.144 | 0.125 | 0.108 | 0.093 | 0.08 | 0.069 |
| 0.308249999999991 | 0.307 | 0.262 | 0.225 | 0.193 | 0.167 | 0.144 | 0.124 | 0.108 | 0.093 | 0.08 | 0.068 |
| 0.308999999999991 | 0.307 | 0.262 | 0.224 | 0.193 | 0.166 | 0.144 | 0.124 | 0.107 | 0.093 | 0.08 | 0.068 |
| 0.309749999999991 | 0.307 | 0.262 | 0.224 | 0.193 | 0.166 | 0.144 | 0.124 | 0.107 | 0.092 | 0.079 | 0.068 |
| 0.310499999999991 | 0.307 | 0.261 | 0.224 | 0.193 | 0.166 | 0.143 | 0.124 | 0.107 | 0.092 | 0.079 | 0.068 |
| 0.311249999999991 | 0.306 | 0.261 | 0.224 | 0.192 | 0.166 | 0.143 | 0.124 | 0.107 | 0.092 | 0.079 | 0.068 |
| 0.311999999999991 | 0.306 | 0.261 | 0.224 | 0.192 | 0.166 | 0.143 | 0.123 | 0.107 | 0.092 | 0.079 | 0.067 |
| 0.312749999999991 | 0.306 | 0.261 | 0.223 | 0.192 | 0.165 | 0.143 | 0.123 | 0.106 | 0.092 | 0.079 | 0.067 |
| 0.313499999999991 | 0.306 | 0.261 | 0.223 | 0.192 | 0.165 | 0.143 | 0.123 | 0.106 | 0.091 | 0.078 | 0.067 |
| 0.314249999999991 | 0.306 | 0.261 | 0.223 | 0.192 | 0.165 | 0.142 | 0.123 | 0.106 | 0.091 | 0.078 | 0.067 |
| 0.314999999999991 | 0.306 | 0.26 | 0.223 | 0.191 | 0.165 | 0.142 | 0.123 | 0.106 | 0.091 | 0.078 | 0.067 |
| 0.315749999999991 | 0.305 | 0.26 | 0.223 | 0.191 | 0.165 | 0.142 | 0.122 | 0.105 | 0.091 | 0.078 | 0.066 |
| 0.316499999999991 | 0.305 | 0.26 | 0.223 | 0.191 | 0.164 | 0.142 | 0.122 | 0.105 | 0.09 | 0.078 | 0.066 |
| 0.317249999999991 | 0.305 | 0.26 | 0.222 | 0.191 | 0.164 | 0.142 | 0.122 | 0.105 | 0.09 | 0.077 | 0.066 |
| 0.317999999999991 | 0.305 | 0.26 | 0.222 | 0.191 | 0.164 | 0.141 | 0.122 | 0.105 | 0.09 | 0.077 | 0.066 |
| 0.318749999999991 | 0.305 | 0.259 | 0.222 | 0.191 | 0.164 | 0.141 | 0.122 | 0.105 | 0.09 | 0.077 | 0.065 |
| 0.319499999999991 | 0.305 | 0.259 | 0.222 | 0.19 | 0.164 | 0.141 | 0.121 | 0.104 | 0.09 | 0.077 | 0.065 |
| 0.320249999999991 | 0.304 | 0.259 | 0.222 | 0.19 | 0.163 | 0.141 | 0.121 | 0.104 | 0.089 | 0.076 | 0.065 |
| 0.320999999999991 | 0.304 | 0.259 | 0.221 | 0.19 | 0.163 | 0.141 | 0.121 | 0.104 | 0.089 | 0.076 | 0.065 |
| 0.321749999999991 | 0.304 | 0.259 | 0.221 | 0.19 | 0.163 | 0.14 | 0.121 | 0.104 | 0.089 | 0.076 | 0.065 |
| 0.322499999999991 | 0.304 | 0.259 | 0.221 | 0.19 | 0.163 | 0.14 | 0.121 | 0.104 | 0.089 | 0.076 | 0.064 |
| 0.32324999999999 | 0.304 | 0.258 | 0.221 | 0.189 | 0.163 | 0.14 | 0.12 | 0.103 | 0.089 | 0.076 | 0.064 |
| 0.32399999999999 | 0.304 | 0.258 | 0.221 | 0.189 | 0.163 | 0.14 | 0.12 | 0.103 | 0.088 | 0.075 | 0.064 |
| 0.32474999999999 | 0.303 | 0.258 | 0.22 | 0.189 | 0.162 | 0.14 | 0.12 | 0.103 | 0.088 | 0.075 | 0.064 |
| 0.32549999999999 | 0.303 | 0.258 | 0.22 | 0.189 | 0.162 | 0.139 | 0.12 | 0.103 | 0.088 | 0.075 | 0.063 |
| 0.32624999999999 | 0.303 | 0.258 | 0.22 | 0.189 | 0.162 | 0.139 | 0.12 | 0.103 | 0.088 | 0.075 | 0.063 |
| 0.32699999999999 | 0.303 | 0.258 | 0.22 | 0.188 | 0.162 | 0.139 | 0.119 | 0.102 | 0.088 | 0.074 | 0.063 |
| 0.32774999999999 | 0.303 | 0.257 | 0.22 | 0.188 | 0.162 | 0.139 | 0.119 | 0.102 | 0.087 | 0.074 | 0.063 |
| 0.32849999999999 | 0.303 | 0.257 | 0.22 | 0.188 | 0.161 | 0.139 | 0.119 | 0.102 | 0.087 | 0.074 | 0.063 |
| 0.32924999999999 | 0.302 | 0.257 | 0.219 | 0.188 | 0.161 | 0.138 | 0.119 | 0.102 | 0.087 | 0.074 | 0.062 |
| 0.32999999999999 | 0.302 | 0.257 | 0.219 | 0.188 | 0.161 | 0.138 | 0.118 | 0.101 | 0.087 | 0.074 | 0.062 |
| 0.33074999999999 | 0.302 | 0.257 | 0.219 | 0.187 | 0.161 | 0.138 | 0.118 | 0.101 | 0.086 | 0.073 | 0.062 |
| 0.33149999999999 | 0.302 | 0.256 | 0.219 | 0.187 | 0.161 | 0.138 | 0.118 | 0.101 | 0.086 | 0.073 | 0.062 |
| 0.33224999999999 | 0.302 | 0.256 | 0.219 | 0.187 | 0.16 | 0.138 | 0.118 | 0.101 | 0.086 | 0.073 | 0.061 |
| 0.33299999999999 | 0.302 | 0.256 | 0.218 | 0.187 | 0.16 | 0.137 | 0.118 | 0.101 | 0.086 | 0.073 | 0.061 |
| 0.33374999999999 | 0.301 | 0.256 | 0.218 | 0.187 | 0.16 | 0.137 | 0.117 | 0.1 | 0.086 | 0.073 | 0.061 |
| 0.33449999999999 | 0.301 | 0.256 | 0.218 | 0.186 | 0.16 | 0.137 | 0.117 | 0.1 | 0.085 | 0.072 | 0.061 |
| 0.33524999999999 | 0.301 | 0.256 | 0.218 | 0.186 | 0.16 | 0.137 | 0.117 | 0.1 | 0.085 | 0.072 | 0.061 |
| 0.33599999999999 | 0.301 | 0.255 | 0.218 | 0.186 | 0.159 | 0.136 | 0.117 | 0.1 | 0.085 | 0.072 | 0.06 |
| 0.33674999999999 | 0.301 | 0.255 | 0.218 | 0.186 | 0.159 | 0.136 | 0.117 | 0.1 | 0.085 | 0.072 | 0.06 |
| 0.33749999999999 | 0.301 | 0.255 | 0.217 | 0.186 | 0.159 | 0.136 | 0.116 | 0.099 | 0.084 | 0.071 | 0.06 |
| 0.33824999999999 | 0.3 | 0.255 | 0.217 | 0.186 | 0.159 | 0.136 | 0.116 | 0.099 | 0.084 | 0.071 | 0.06 |
| 0.33899999999999 | 0.3 | 0.255 | 0.217 | 0.185 | 0.159 | 0.136 | 0.116 | 0.099 | 0.084 | 0.071 | 0.059 |
| 0.33974999999999 | 0.3 | 0.255 | 0.217 | 0.185 | 0.158 | 0.135 | 0.116 | 0.099 | 0.084 | 0.071 | 0.059 |
| 0.34049999999999 | 0.3 | 0.254 | 0.217 | 0.185 | 0.158 | 0.135 | 0.116 | 0.099 | 0.084 | 0.071 | 0.059 |
| 0.34124999999999 | 0.3 | 0.254 | 0.216 | 0.185 | 0.158 | 0.135 | 0.115 | 0.098 | 0.083 | 0.07 | 0.059 |
| 0.34199999999999 | 0.3 | 0.254 | 0.216 | 0.185 | 0.158 | 0.135 | 0.115 | 0.098 | 0.083 | 0.07 | 0.059 |
| 0.34274999999999 | 0.299 | 0.254 | 0.216 | 0.184 | 0.158 | 0.135 | 0.115 | 0.098 | 0.083 | 0.07 | 0.058 |
| 0.34349999999999 | 0.299 | 0.254 | 0.216 | 0.184 | 0.157 | 0.134 | 0.115 | 0.098 | 0.083 | 0.07 | 0.058 |
| 0.34424999999999 | 0.299 | 0.253 | 0.216 | 0.184 | 0.157 | 0.134 | 0.115 | 0.097 | 0.083 | 0.069 | 0.058 |
| 0.34499999999999 | 0.299 | 0.253 | 0.215 | 0.184 | 0.157 | 0.134 | 0.114 | 0.097 | 0.082 | 0.069 | 0.058 |
| 0.34574999999999 | 0.299 | 0.253 | 0.215 | 0.184 | 0.157 | 0.134 | 0.114 | 0.097 | 0.082 | 0.069 | 0.058 |
| 0.34649999999999 | 0.299 | 0.253 | 0.215 | 0.183 | 0.157 | 0.134 | 0.114 | 0.097 | 0.082 | 0.069 | 0.057 |
| 0.34724999999999 | 0.298 | 0.253 | 0.215 | 0.183 | 0.156 | 0.133 | 0.114 | 0.097 | 0.082 | 0.069 | 0.057 |
| 0.34799999999999 | 0.298 | 0.253 | 0.215 | 0.183 | 0.156 | 0.133 | 0.114 | 0.096 | 0.081 | 0.068 | 0.057 |
| 0.34874999999999 | 0.298 | 0.252 | 0.215 | 0.183 | 0.156 | 0.133 | 0.113 | 0.096 | 0.081 | 0.068 | 0.057 |
| 0.34949999999999 | 0.298 | 0.252 | 0.214 | 0.183 | 0.156 | 0.133 | 0.113 | 0.096 | 0.081 | 0.068 | 0.056 |
| 0.35024999999999 | 0.298 | 0.252 | 0.214 | 0.182 | 0.156 | 0.133 | 0.113 | 0.096 | 0.081 | 0.068 | 0.056 |
| 0.350999999999989 | 0.298 | 0.252 | 0.214 | 0.182 | 0.155 | 0.132 | 0.113 | 0.096 | 0.081 | 0.068 | 0.056 |
| 0.351749999999989 | 0.297 | 0.252 | 0.214 | 0.182 | 0.155 | 0.132 | 0.112 | 0.095 | 0.08 | 0.067 | 0.056 |
| 0.352499999999989 | 0.297 | 0.252 | 0.214 | 0.182 | 0.155 | 0.132 | 0.112 | 0.095 | 0.08 | 0.067 | 0.056 |
| 0.353249999999989 | 0.297 | 0.251 | 0.213 | 0.182 | 0.155 | 0.132 | 0.112 | 0.095 | 0.08 | 0.067 | 0.055 |
| 0.353999999999989 | 0.297 | 0.251 | 0.213 | 0.181 | 0.155 | 0.132 | 0.112 | 0.095 | 0.08 | 0.067 | 0.055 |
| 0.354749999999989 | 0.297 | 0.251 | 0.213 | 0.181 | 0.154 | 0.131 | 0.112 | 0.095 | 0.08 | 0.066 | 0.055 |
| 0.355499999999989 | 0.297 | 0.251 | 0.213 | 0.181 | 0.154 | 0.131 | 0.111 | 0.094 | 0.079 | 0.066 | 0.055 |
| 0.356249999999989 | 0.296 | 0.251 | 0.213 | 0.181 | 0.154 | 0.131 | 0.111 | 0.094 | 0.079 | 0.066 | 0.054 |
| 0.356999999999989 | 0.296 | 0.25 | 0.213 | 0.181 | 0.154 | 0.131 | 0.111 | 0.094 | 0.079 | 0.066 | 0.054 |
| 0.357749999999989 | 0.296 | 0.25 | 0.212 | 0.181 | 0.154 | 0.131 | 0.111 | 0.094 | 0.079 | 0.066 | 0.054 |
| 0.358499999999989 | 0.296 | 0.25 | 0.212 | 0.18 | 0.153 | 0.13 | 0.111 | 0.093 | 0.079 | 0.065 | 0.054 |
| 0.359249999999989 | 0.296 | 0.25 | 0.212 | 0.18 | 0.153 | 0.13 | 0.11 | 0.093 | 0.078 | 0.065 | 0.054 |
| 0.359999999999989 | 0.296 | 0.25 | 0.212 | 0.18 | 0.153 | 0.13 | 0.11 | 0.093 | 0.078 | 0.065 | 0.053 |
| 0.360749999999989 | 0.295 | 0.25 | 0.212 | 0.18 | 0.153 | 0.13 | 0.11 | 0.093 | 0.078 | 0.065 | 0.053 |
| 0.361499999999989 | 0.295 | 0.249 | 0.211 | 0.18 | 0.153 | 0.13 | 0.11 | 0.093 | 0.078 | 0.065 | 0.053 |
| 0.362249999999989 | 0.295 | 0.249 | 0.211 | 0.179 | 0.152 | 0.129 | 0.11 | 0.092 | 0.077 | 0.064 | 0.053 |
| 0.362999999999989 | 0.295 | 0.249 | 0.211 | 0.179 | 0.152 | 0.129 | 0.109 | 0.092 | 0.077 | 0.064 | 0.052 |
| 0.363749999999989 | 0.295 | 0.249 | 0.211 | 0.179 | 0.152 | 0.129 | 0.109 | 0.092 | 0.077 | 0.064 | 0.052 |
| 0.364499999999989 | 0.295 | 0.249 | 0.211 | 0.179 | 0.152 | 0.129 | 0.109 | 0.092 | 0.077 | 0.064 | 0.052 |
| 0.365249999999989 | 0.294 | 0.249 | 0.211 | 0.179 | 0.152 | 0.129 | 0.109 | 0.092 | 0.077 | 0.063 | 0.052 |
| 0.365999999999989 | 0.294 | 0.248 | 0.21 | 0.178 | 0.151 | 0.128 | 0.109 | 0.091 | 0.076 | 0.063 | 0.052 |
| 0.366749999999989 | 0.294 | 0.248 | 0.21 | 0.178 | 0.151 | 0.128 | 0.108 | 0.091 | 0.076 | 0.063 | 0.051 |
| 0.367499999999989 | 0.294 | 0.248 | 0.21 | 0.178 | 0.151 | 0.128 | 0.108 | 0.091 | 0.076 | 0.063 | 0.051 |
| 0.368249999999989 | 0.294 | 0.248 | 0.21 | 0.178 | 0.151 | 0.128 | 0.108 | 0.091 | 0.076 | 0.063 | 0.051 |
| 0.368999999999989 | 0.294 | 0.248 | 0.21 | 0.178 | 0.151 | 0.128 | 0.108 | 0.091 | 0.076 | 0.062 | 0.051 |
| 0.369749999999989 | 0.294 | 0.248 | 0.209 | 0.177 | 0.15 | 0.127 | 0.108 | 0.09 | 0.075 | 0.062 | 0.051 |
| 0.370499999999989 | 0.293 | 0.247 | 0.209 | 0.177 | 0.15 | 0.127 | 0.107 | 0.09 | 0.075 | 0.062 | 0.05 |
| 0.371249999999989 | 0.293 | 0.247 | 0.209 | 0.177 | 0.15 | 0.127 | 0.107 | 0.09 | 0.075 | 0.062 | 0.05 |
| 0.371999999999989 | 0.293 | 0.247 | 0.209 | 0.177 | 0.15 | 0.127 | 0.107 | 0.09 | 0.075 | 0.061 | 0.05 |
| 0.372749999999989 | 0.293 | 0.247 | 0.209 | 0.177 | 0.15 | 0.127 | 0.107 | 0.09 | 0.074 | 0.061 | 0.05 |
| 0.373499999999989 | 0.293 | 0.247 | 0.209 | 0.177 | 0.149 | 0.126 | 0.107 | 0.089 | 0.074 | 0.061 | 0.049 |
| 0.374249999999989 | 0.293 | 0.246 | 0.208 | 0.176 | 0.149 | 0.126 | 0.106 | 0.089 | 0.074 | 0.061 | 0.049 |
| 0.374999999999989 | 0.292 | 0.246 | 0.208 | 0.176 | 0.149 | 0.126 | 0.106 | 0.089 | 0.074 | 0.061 | 0.049 |
| 0.375749999999989 | 0.292 | 0.246 | 0.208 | 0.176 | 0.149 | 0.126 | 0.106 | 0.089 | 0.074 | 0.06 | 0.049 |
| 0.376499999999989 | 0.292 | 0.246 | 0.208 | 0.176 | 0.149 | 0.126 | 0.106 | 0.088 | 0.073 | 0.06 | 0.049 |
| 0.377249999999989 | 0.292 | 0.246 | 0.208 | 0.176 | 0.149 | 0.125 | 0.106 | 0.088 | 0.073 | 0.06 | 0.048 |
| 0.377999999999989 | 0.292 | 0.246 | 0.207 | 0.175 | 0.148 | 0.125 | 0.105 | 0.088 | 0.073 | 0.06 | 0.048 |
| 0.378749999999988 | 0.292 | 0.245 | 0.207 | 0.175 | 0.148 | 0.125 | 0.105 | 0.088 | 0.073 | 0.06 | 0.048 |
| 0.379499999999988 | 0.291 | 0.245 | 0.207 | 0.175 | 0.148 | 0.125 | 0.105 | 0.088 | 0.073 | 0.059 | 0.048 |
| 0.380249999999988 | 0.291 | 0.245 | 0.207 | 0.175 | 0.148 | 0.125 | 0.105 | 0.087 | 0.072 | 0.059 | 0.047 |
| 0.380999999999988 | 0.291 | 0.245 | 0.207 | 0.175 | 0.148 | 0.124 | 0.104 | 0.087 | 0.072 | 0.059 | 0.047 |
| 0.381749999999988 | 0.291 | 0.245 | 0.207 | 0.174 | 0.147 | 0.124 | 0.104 | 0.087 | 0.072 | 0.059 | 0.047 |
| 0.382499999999988 | 0.291 | 0.245 | 0.206 | 0.174 | 0.147 | 0.124 | 0.104 | 0.087 | 0.072 | 0.059 | 0.047 |
| 0.383249999999988 | 0.291 | 0.244 | 0.206 | 0.174 | 0.147 | 0.124 | 0.104 | 0.087 | 0.072 | 0.058 | 0.047 |
| 0.383999999999988 | 0.29 | 0.244 | 0.206 | 0.174 | 0.147 | 0.124 | 0.104 | 0.086 | 0.071 | 0.058 | 0.046 |
| 0.384749999999988 | 0.29 | 0.244 | 0.206 | 0.174 | 0.147 | 0.123 | 0.103 | 0.086 | 0.071 | 0.058 | 0.046 |
| 0.385499999999988 | 0.29 | 0.244 | 0.206 | 0.174 | 0.146 | 0.123 | 0.103 | 0.086 | 0.071 | 0.058 | 0.046 |
| 0.386249999999988 | 0.29 | 0.244 | 0.205 | 0.173 | 0.146 | 0.123 | 0.103 | 0.086 | 0.071 | 0.057 | 0.046 |
| 0.386999999999988 | 0.29 | 0.244 | 0.205 | 0.173 | 0.146 | 0.123 | 0.103 | 0.086 | 0.07 | 0.057 | 0.046 |
| 0.387749999999988 | 0.29 | 0.243 | 0.205 | 0.173 | 0.146 | 0.123 | 0.103 | 0.085 | 0.07 | 0.057 | 0.045 |
| 0.388499999999988 | 0.289 | 0.243 | 0.205 | 0.173 | 0.146 | 0.122 | 0.102 | 0.085 | 0.07 | 0.057 | 0.045 |
| 0.389249999999988 | 0.289 | 0.243 | 0.205 | 0.173 | 0.145 | 0.122 | 0.102 | 0.085 | 0.07 | 0.057 | 0.045 |
| 0.389999999999988 | 0.289 | 0.243 | 0.205 | 0.172 | 0.145 | 0.122 | 0.102 | 0.085 | 0.07 | 0.056 | 0.045 |
| 0.390749999999988 | 0.289 | 0.243 | 0.204 | 0.172 | 0.145 | 0.122 | 0.102 | 0.085 | 0.069 | 0.056 | 0.044 |
| 0.391499999999988 | 0.289 | 0.243 | 0.204 | 0.172 | 0.145 | 0.122 | 0.102 | 0.084 | 0.069 | 0.056 | 0.044 |
| 0.392249999999988 | 0.289 | 0.242 | 0.204 | 0.172 | 0.145 | 0.121 | 0.101 | 0.084 | 0.069 | 0.056 | 0.044 |
| 0.392999999999988 | 0.288 | 0.242 | 0.204 | 0.172 | 0.144 | 0.121 | 0.101 | 0.084 | 0.069 | 0.056 | 0.044 |
| 0.393749999999988 | 0.288 | 0.242 | 0.204 | 0.172 | 0.144 | 0.121 | 0.101 | 0.084 | 0.069 | 0.055 | 0.044 |
| 0.394499999999988 | 0.288 | 0.242 | 0.203 | 0.171 | 0.144 | 0.121 | 0.101 | 0.084 | 0.068 | 0.055 | 0.043 |
| 0.395249999999988 | 0.288 | 0.242 | 0.203 | 0.171 | 0.144 | 0.121 | 0.101 | 0.083 | 0.068 | 0.055 | 0.043 |
| 0.395999999999988 | 0.288 | 0.242 | 0.203 | 0.171 | 0.144 | 0.12 | 0.1 | 0.083 | 0.068 | 0.055 | 0.043 |
| 0.396749999999988 | 0.288 | 0.241 | 0.203 | 0.171 | 0.144 | 0.12 | 0.1 | 0.083 | 0.068 | 0.055 | 0.043 |
| 0.397499999999988 | 0.288 | 0.241 | 0.203 | 0.171 | 0.143 | 0.12 | 0.1 | 0.083 | 0.068 | 0.054 | 0.043 |
| 0.398249999999988 | 0.287 | 0.241 | 0.203 | 0.17 | 0.143 | 0.12 | 0.1 | 0.083 | 0.067 | 0.054 | 0.042 |
| 0.398999999999988 | 0.287 | 0.241 | 0.202 | 0.17 | 0.143 | 0.12 | 0.1 | 0.082 | 0.067 | 0.054 | 0.042 |
| 0.399749999999988 | 0.287 | 0.241 | 0.202 | 0.17 | 0.143 | 0.12 | 0.099 | 0.082 | 0.067 | 0.054 | 0.042 |
| 0.400499999999988 | 0.287 | 0.241 | 0.202 | 0.17 | 0.143 | 0.119 | 0.099 | 0.082 | 0.067 | 0.053 | 0.042 |
| 0.401249999999988 | 0.287 | 0.24 | 0.202 | 0.17 | 0.142 | 0.119 | 0.099 | 0.082 | 0.067 | 0.053 | 0.042 |
| 0.401999999999988 | 0.287 | 0.24 | 0.202 | 0.17 | 0.142 | 0.119 | 0.099 | 0.082 | 0.066 | 0.053 | 0.041 |
| 0.402749999999988 | 0.286 | 0.24 | 0.202 | 0.169 | 0.142 | 0.119 | 0.099 | 0.081 | 0.066 | 0.053 | 0.041 |
| 0.403499999999988 | 0.286 | 0.24 | 0.201 | 0.169 | 0.142 | 0.119 | 0.099 | 0.081 | 0.066 | 0.053 | 0.041 |
| 0.404249999999988 | 0.286 | 0.24 | 0.201 | 0.169 | 0.142 | 0.118 | 0.098 | 0.081 | 0.066 | 0.052 | 0.041 |
| 0.404999999999988 | 0.286 | 0.24 | 0.201 | 0.169 | 0.141 | 0.118 | 0.098 | 0.081 | 0.066 | 0.052 | 0.04 |
| 0.405749999999988 | 0.286 | 0.239 | 0.201 | 0.169 | 0.141 | 0.118 | 0.098 | 0.081 | 0.065 | 0.052 | 0.04 |
| 0.406499999999988 | 0.286 | 0.239 | 0.201 | 0.168 | 0.141 | 0.118 | 0.098 | 0.08 | 0.065 | 0.052 | 0.04 |
| 0.407249999999987 | 0.286 | 0.239 | 0.201 | 0.168 | 0.141 | 0.118 | 0.098 | 0.08 | 0.065 | 0.052 | 0.04 |
| 0.407999999999987 | 0.285 | 0.239 | 0.2 | 0.168 | 0.141 | 0.117 | 0.097 | 0.08 | 0.065 | 0.051 | 0.04 |
| 0.408749999999987 | 0.285 | 0.239 | 0.2 | 0.168 | 0.141 | 0.117 | 0.097 | 0.08 | 0.065 | 0.051 | 0.039 |
| 0.409499999999987 | 0.285 | 0.239 | 0.2 | 0.168 | 0.14 | 0.117 | 0.097 | 0.08 | 0.064 | 0.051 | 0.039 |
| 0.410249999999987 | 0.285 | 0.238 | 0.2 | 0.168 | 0.14 | 0.117 | 0.097 | 0.079 | 0.064 | 0.051 | 0.039 |
| 0.410999999999987 | 0.285 | 0.238 | 0.2 | 0.167 | 0.14 | 0.117 | 0.097 | 0.079 | 0.064 | 0.051 | 0.039 |
| 0.411749999999987 | 0.285 | 0.238 | 0.199 | 0.167 | 0.14 | 0.116 | 0.096 | 0.079 | 0.064 | 0.05 | 0.039 |
| 0.412499999999987 | 0.284 | 0.238 | 0.199 | 0.167 | 0.14 | 0.116 | 0.096 | 0.079 | 0.064 | 0.05 | 0.038 |
| 0.413249999999987 | 0.284 | 0.238 | 0.199 | 0.167 | 0.139 | 0.116 | 0.096 | 0.079 | 0.063 | 0.05 | 0.038 |
| 0.413999999999987 | 0.284 | 0.238 | 0.199 | 0.167 | 0.139 | 0.116 | 0.096 | 0.078 | 0.063 | 0.05 | 0.038 |
| 0.414749999999987 | 0.284 | 0.237 | 0.199 | 0.166 | 0.139 | 0.116 | 0.096 | 0.078 | 0.063 | 0.05 | 0.038 |
| 0.415499999999987 | 0.284 | 0.237 | 0.199 | 0.166 | 0.139 | 0.116 | 0.095 | 0.078 | 0.063 | 0.049 | 0.038 |
| 0.416249999999987 | 0.284 | 0.237 | 0.198 | 0.166 | 0.139 | 0.115 | 0.095 | 0.078 | 0.063 | 0.049 | 0.037 |
| 0.416999999999987 | 0.284 | 0.237 | 0.198 | 0.166 | 0.139 | 0.115 | 0.095 | 0.078 | 0.062 | 0.049 | 0.037 |
| 0.417749999999987 | 0.283 | 0.237 | 0.198 | 0.166 | 0.138 | 0.115 | 0.095 | 0.077 | 0.062 | 0.049 | 0.037 |
| 0.418499999999987 | 0.283 | 0.237 | 0.198 | 0.166 | 0.138 | 0.115 | 0.095 | 0.077 | 0.062 | 0.049 | 0.037 |
| 0.419249999999987 | 0.283 | 0.236 | 0.198 | 0.165 | 0.138 | 0.115 | 0.094 | 0.077 | 0.062 | 0.048 | 0.037 |
| 0.419999999999987 | 0.283 | 0.236 | 0.198 | 0.165 | 0.138 | 0.114 | 0.094 | 0.077 | 0.062 | 0.048 | 0.036 |
| 0.420749999999987 | 0.283 | 0.236 | 0.197 | 0.165 | 0.138 | 0.114 | 0.094 | 0.077 | 0.061 | 0.048 | 0.036 |
| 0.421499999999987 | 0.283 | 0.236 | 0.197 | 0.165 | 0.137 | 0.114 | 0.094 | 0.076 | 0.061 | 0.048 | 0.036 |
| 0.422249999999987 | 0.282 | 0.236 | 0.197 | 0.165 | 0.137 | 0.114 | 0.094 | 0.076 | 0.061 | 0.048 | 0.036 |
| 0.422999999999987 | 0.282 | 0.236 | 0.197 | 0.165 | 0.137 | 0.114 | 0.093 | 0.076 | 0.061 | 0.047 | 0.036 |
| 0.423749999999987 | 0.282 | 0.235 | 0.197 | 0.164 | 0.137 | 0.113 | 0.093 | 0.076 | 0.061 | 0.047 | 0.035 |
| 0.424499999999987 | 0.282 | 0.235 | 0.197 | 0.164 | 0.137 | 0.113 | 0.093 | 0.076 | 0.06 | 0.047 | 0.035 |
| 0.425249999999987 | 0.282 | 0.235 | 0.196 | 0.164 | 0.137 | 0.113 | 0.093 | 0.075 | 0.06 | 0.047 | 0.035 |
| 0.425999999999987 | 0.282 | 0.235 | 0.196 | 0.164 | 0.136 | 0.113 | 0.093 | 0.075 | 0.06 | 0.047 | 0.035 |
| 0.426749999999987 | 0.282 | 0.235 | 0.196 | 0.164 | 0.136 | 0.113 | 0.093 | 0.075 | 0.06 | 0.046 | 0.035 |
| 0.427499999999987 | 0.281 | 0.235 | 0.196 | 0.163 | 0.136 | 0.113 | 0.092 | 0.075 | 0.06 | 0.046 | 0.034 |
| 0.428249999999987 | 0.281 | 0.235 | 0.196 | 0.163 | 0.136 | 0.112 | 0.092 | 0.075 | 0.059 | 0.046 | 0.034 |
| 0.428999999999987 | 0.281 | 0.234 | 0.196 | 0.163 | 0.136 | 0.112 | 0.092 | 0.074 | 0.059 | 0.046 | 0.034 |
| 0.429749999999987 | 0.281 | 0.234 | 0.195 | 0.163 | 0.135 | 0.112 | 0.092 | 0.074 | 0.059 | 0.046 | 0.034 |
| 0.430499999999987 | 0.281 | 0.234 | 0.195 | 0.163 | 0.135 | 0.112 | 0.092 | 0.074 | 0.059 | 0.045 | 0.034 |
| 0.431249999999987 | 0.281 | 0.234 | 0.195 | 0.163 | 0.135 | 0.112 | 0.091 | 0.074 | 0.059 | 0.045 | 0.033 |
| 0.431999999999987 | 0.281 | 0.234 | 0.195 | 0.162 | 0.135 | 0.111 | 0.091 | 0.074 | 0.058 | 0.045 | 0.033 |
| 0.432749999999987 | 0.28 | 0.234 | 0.195 | 0.162 | 0.135 | 0.111 | 0.091 | 0.074 | 0.058 | 0.045 | 0.033 |
| 0.433499999999987 | 0.28 | 0.233 | 0.195 | 0.162 | 0.135 | 0.111 | 0.091 | 0.073 | 0.058 | 0.045 | 0.033 |
| 0.434249999999987 | 0.28 | 0.233 | 0.194 | 0.162 | 0.134 | 0.111 | 0.091 | 0.073 | 0.058 | 0.044 | 0.033 |
| 0.434999999999986 | 0.28 | 0.233 | 0.194 | 0.162 | 0.134 | 0.111 | 0.09 | 0.073 | 0.058 | 0.044 | 0.032 |
| 0.435749999999986 | 0.28 | 0.233 | 0.194 | 0.162 | 0.134 | 0.111 | 0.09 | 0.073 | 0.057 | 0.044 | 0.032 |
| 0.436499999999986 | 0.28 | 0.233 | 0.194 | 0.161 | 0.134 | 0.11 | 0.09 | 0.073 | 0.057 | 0.044 | 0.032 |
| 0.437249999999986 | 0.28 | 0.233 | 0.194 | 0.161 | 0.134 | 0.11 | 0.09 | 0.072 | 0.057 | 0.044 | 0.032 |
| 0.437999999999986 | 0.279 | 0.233 | 0.194 | 0.161 | 0.134 | 0.11 | 0.09 | 0.072 | 0.057 | 0.043 | 0.032 |
| 0.438749999999986 | 0.279 | 0.232 | 0.194 | 0.161 | 0.133 | 0.11 | 0.09 | 0.072 | 0.057 | 0.043 | 0.031 |
| 0.439499999999986 | 0.279 | 0.232 | 0.193 | 0.161 | 0.133 | 0.11 | 0.089 | 0.072 | 0.057 | 0.043 | 0.031 |
| 0.440249999999986 | 0.279 | 0.232 | 0.193 | 0.161 | 0.133 | 0.109 | 0.089 | 0.072 | 0.056 | 0.043 | 0.031 |
| 0.440999999999986 | 0.279 | 0.232 | 0.193 | 0.16 | 0.133 | 0.109 | 0.089 | 0.071 | 0.056 | 0.043 | 0.031 |
| 0.441749999999986 | 0.279 | 0.232 | 0.193 | 0.16 | 0.133 | 0.109 | 0.089 | 0.071 | 0.056 | 0.042 | 0.031 |
| 0.442499999999986 | 0.279 | 0.232 | 0.193 | 0.16 | 0.133 | 0.109 | 0.089 | 0.071 | 0.056 | 0.042 | 0.03 |
| 0.443249999999986 | 0.278 | 0.231 | 0.193 | 0.16 | 0.132 | 0.109 | 0.088 | 0.071 | 0.056 | 0.042 | 0.03 |
| 0.443999999999986 | 0.278 | 0.231 | 0.192 | 0.16 | 0.132 | 0.109 | 0.088 | 0.071 | 0.055 | 0.042 | 0.03 |
| 0.444749999999986 | 0.278 | 0.231 | 0.192 | 0.16 | 0.132 | 0.108 | 0.088 | 0.071 | 0.055 | 0.042 | 0.03 |
| 0.445499999999986 | 0.278 | 0.231 | 0.192 | 0.159 | 0.132 | 0.108 | 0.088 | 0.07 | 0.055 | 0.042 | 0.03 |
| 0.446249999999986 | 0.278 | 0.231 | 0.192 | 0.159 | 0.132 | 0.108 | 0.088 | 0.07 | 0.055 | 0.041 | 0.029 |
| 0.446999999999986 | 0.278 | 0.231 | 0.192 | 0.159 | 0.131 | 0.108 | 0.088 | 0.07 | 0.055 | 0.041 | 0.029 |
| 0.447749999999986 | 0.278 | 0.231 | 0.192 | 0.159 | 0.131 | 0.108 | 0.087 | 0.07 | 0.054 | 0.041 | 0.029 |
| 0.448499999999986 | 0.277 | 0.23 | 0.191 | 0.159 | 0.131 | 0.108 | 0.087 | 0.07 | 0.054 | 0.041 | 0.029 |
| 0.449249999999986 | 0.277 | 0.23 | 0.191 | 0.159 | 0.131 | 0.107 | 0.087 | 0.069 | 0.054 | 0.041 | 0.029 |
| 0.449999999999986 | 0.277 | 0.23 | 0.191 | 0.158 | 0.131 | 0.107 | 0.087 | 0.069 | 0.054 | 0.04 | 0.029 |
| 0.450749999999986 | 0.277 | 0.23 | 0.191 | 0.158 | 0.131 | 0.107 | 0.087 | 0.069 | 0.054 | 0.04 | 0.028 |
| 0.451499999999986 | 0.277 | 0.23 | 0.191 | 0.158 | 0.13 | 0.107 | 0.087 | 0.069 | 0.054 | 0.04 | 0.028 |
| 0.452249999999986 | 0.277 | 0.23 | 0.191 | 0.158 | 0.13 | 0.107 | 0.086 | 0.069 | 0.053 | 0.04 | 0.028 |
| 0.452999999999986 | 0.277 | 0.23 | 0.191 | 0.158 | 0.13 | 0.107 | 0.086 | 0.069 | 0.053 | 0.04 | 0.028 |
| 0.453749999999986 | 0.277 | 0.229 | 0.19 | 0.158 | 0.13 | 0.106 | 0.086 | 0.068 | 0.053 | 0.039 | 0.028 |
| 0.454499999999986 | 0.276 | 0.229 | 0.19 | 0.158 | 0.13 | 0.106 | 0.086 | 0.068 | 0.053 | 0.039 | 0.027 |
| 0.455249999999986 | 0.276 | 0.229 | 0.19 | 0.157 | 0.13 | 0.106 | 0.086 | 0.068 | 0.053 | 0.039 | 0.027 |
| 0.455999999999986 | 0.276 | 0.229 | 0.19 | 0.157 | 0.129 | 0.106 | 0.085 | 0.068 | 0.052 | 0.039 | 0.027 |
| 0.456749999999986 | 0.276 | 0.229 | 0.19 | 0.157 | 0.129 | 0.106 | 0.085 | 0.068 | 0.052 | 0.039 | 0.027 |
| 0.457499999999986 | 0.276 | 0.229 | 0.19 | 0.157 | 0.129 | 0.105 | 0.085 | 0.067 | 0.052 | 0.039 | 0.027 |
| 0.458249999999986 | 0.276 | 0.229 | 0.189 | 0.157 | 0.129 | 0.105 | 0.085 | 0.067 | 0.052 | 0.038 | 0.026 |
| 0.458999999999986 | 0.276 | 0.228 | 0.189 | 0.157 | 0.129 | 0.105 | 0.085 | 0.067 | 0.052 | 0.038 | 0.026 |
| 0.459749999999986 | 0.275 | 0.228 | 0.189 | 0.156 | 0.129 | 0.105 | 0.085 | 0.067 | 0.052 | 0.038 | 0.026 |
| 0.460499999999986 | 0.275 | 0.228 | 0.189 | 0.156 | 0.129 | 0.105 | 0.084 | 0.067 | 0.051 | 0.038 | 0.026 |
| 0.461249999999986 | 0.275 | 0.228 | 0.189 | 0.156 | 0.128 | 0.105 | 0.084 | 0.067 | 0.051 | 0.038 | 0.026 |
| 0.461999999999985 | 0.275 | 0.228 | 0.189 | 0.156 | 0.128 | 0.104 | 0.084 | 0.066 | 0.051 | 0.037 | 0.026 |
| 0.462749999999985 | 0.275 | 0.228 | 0.189 | 0.156 | 0.128 | 0.104 | 0.084 | 0.066 | 0.051 | 0.037 | 0.025 |
| 0.463499999999985 | 0.275 | 0.228 | 0.188 | 0.156 | 0.128 | 0.104 | 0.084 | 0.066 | 0.051 | 0.037 | 0.025 |
| 0.464249999999985 | 0.275 | 0.227 | 0.188 | 0.155 | 0.128 | 0.104 | 0.084 | 0.066 | 0.05 | 0.037 | 0.025 |
| 0.464999999999985 | 0.275 | 0.227 | 0.188 | 0.155 | 0.128 | 0.104 | 0.083 | 0.066 | 0.05 | 0.037 | 0.025 |
| 0.465749999999985 | 0.274 | 0.227 | 0.188 | 0.155 | 0.127 | 0.104 | 0.083 | 0.066 | 0.05 | 0.037 | 0.025 |
| 0.466499999999985 | 0.274 | 0.227 | 0.188 | 0.155 | 0.127 | 0.104 | 0.083 | 0.065 | 0.05 | 0.036 | 0.024 |
| 0.467249999999985 | 0.274 | 0.227 | 0.188 | 0.155 | 0.127 | 0.103 | 0.083 | 0.065 | 0.05 | 0.036 | 0.024 |
| 0.467999999999985 | 0.274 | 0.227 | 0.188 | 0.155 | 0.127 | 0.103 | 0.083 | 0.065 | 0.05 | 0.036 | 0.024 |
| 0.468749999999985 | 0.274 | 0.227 | 0.187 | 0.155 | 0.127 | 0.103 | 0.083 | 0.065 | 0.049 | 0.036 | 0.024 |
| 0.469499999999985 | 0.274 | 0.226 | 0.187 | 0.154 | 0.127 | 0.103 | 0.082 | 0.065 | 0.049 | 0.036 | 0.024 |
| 0.470249999999985 | 0.274 | 0.226 | 0.187 | 0.154 | 0.126 | 0.103 | 0.082 | 0.065 | 0.049 | 0.036 | 0.024 |
| 0.470999999999985 | 0.274 | 0.226 | 0.187 | 0.154 | 0.126 | 0.103 | 0.082 | 0.064 | 0.049 | 0.035 | 0.023 |
| 0.471749999999985 | 0.273 | 0.226 | 0.187 | 0.154 | 0.126 | 0.102 | 0.082 | 0.064 | 0.049 | 0.035 | 0.023 |
| 0.472499999999985 | 0.273 | 0.226 | 0.187 | 0.154 | 0.126 | 0.102 | 0.082 | 0.064 | 0.049 | 0.035 | 0.023 |
| 0.473249999999985 | 0.273 | 0.226 | 0.187 | 0.154 | 0.126 | 0.102 | 0.082 | 0.064 | 0.048 | 0.035 | 0.023 |
| 0.473999999999985 | 0.273 | 0.226 | 0.186 | 0.154 | 0.126 | 0.102 | 0.081 | 0.064 | 0.048 | 0.035 | 0.023 |
| 0.474749999999985 | 0.273 | 0.226 | 0.186 | 0.153 | 0.126 | 0.102 | 0.081 | 0.064 | 0.048 | 0.034 | 0.022 |
| 0.475499999999985 | 0.273 | 0.225 | 0.186 | 0.153 | 0.125 | 0.102 | 0.081 | 0.063 | 0.048 | 0.034 | 0.022 |
| 0.476249999999985 | 0.273 | 0.225 | 0.186 | 0.153 | 0.125 | 0.101 | 0.081 | 0.063 | 0.048 | 0.034 | 0.022 |
| 0.476999999999985 | 0.273 | 0.225 | 0.186 | 0.153 | 0.125 | 0.101 | 0.081 | 0.063 | 0.048 | 0.034 | 0.022 |
| 0.477749999999985 | 0.272 | 0.225 | 0.186 | 0.153 | 0.125 | 0.101 | 0.081 | 0.063 | 0.047 | 0.034 | 0.022 |
| 0.478499999999985 | 0.272 | 0.225 | 0.186 | 0.153 | 0.125 | 0.101 | 0.08 | 0.063 | 0.047 | 0.034 | 0.022 |
| 0.479249999999985 | 0.272 | 0.225 | 0.185 | 0.153 | 0.125 | 0.101 | 0.08 | 0.063 | 0.047 | 0.033 | 0.021 |
| 0.479999999999985 | 0.272 | 0.225 | 0.185 | 0.152 | 0.124 | 0.101 | 0.08 | 0.062 | 0.047 | 0.033 | 0.021 |
| 0.480749999999985 | 0.272 | 0.225 | 0.185 | 0.152 | 0.124 | 0.1 | 0.08 | 0.062 | 0.047 | 0.033 | 0.021 |
| 0.481499999999985 | 0.272 | 0.224 | 0.185 | 0.152 | 0.124 | 0.1 | 0.08 | 0.062 | 0.047 | 0.033 | 0.021 |
| 0.482249999999985 | 0.272 | 0.224 | 0.185 | 0.152 | 0.124 | 0.1 | 0.08 | 0.062 | 0.046 | 0.033 | 0.021 |
| 0.482999999999985 | 0.272 | 0.224 | 0.185 | 0.152 | 0.124 | 0.1 | 0.08 | 0.062 | 0.046 | 0.033 | 0.021 |
| 0.483749999999985 | 0.272 | 0.224 | 0.185 | 0.152 | 0.124 | 0.1 | 0.079 | 0.062 | 0.046 | 0.032 | 0.02 |
| 0.484499999999985 | 0.271 | 0.224 | 0.185 | 0.152 | 0.124 | 0.1 | 0.079 | 0.061 | 0.046 | 0.032 | 0.02 |
| 0.485249999999985 | 0.271 | 0.224 | 0.184 | 0.151 | 0.123 | 0.1 | 0.079 | 0.061 | 0.046 | 0.032 | 0.02 |
| 0.485999999999985 | 0.271 | 0.224 | 0.184 | 0.151 | 0.123 | 0.099 | 0.079 | 0.061 | 0.046 | 0.032 | 0.02 |
| 0.486749999999985 | 0.271 | 0.224 | 0.184 | 0.151 | 0.123 | 0.099 | 0.079 | 0.061 | 0.045 | 0.032 | 0.02 |
| 0.487499999999985 | 0.271 | 0.223 | 0.184 | 0.151 | 0.123 | 0.099 | 0.079 | 0.061 | 0.045 | 0.032 | 0.02 |
| 0.488249999999985 | 0.271 | 0.223 | 0.184 | 0.151 | 0.123 | 0.099 | 0.078 | 0.061 | 0.045 | 0.031 | 0.019 |
| 0.488999999999985 | 0.271 | 0.223 | 0.184 | 0.151 | 0.123 | 0.099 | 0.078 | 0.06 | 0.045 | 0.031 | 0.019 |
| 0.489749999999984 | 0.271 | 0.223 | 0.184 | 0.151 | 0.123 | 0.099 | 0.078 | 0.06 | 0.045 | 0.031 | 0.019 |
| 0.490499999999984 | 0.271 | 0.223 | 0.183 | 0.15 | 0.122 | 0.099 | 0.078 | 0.06 | 0.045 | 0.031 | 0.019 |
| 0.491249999999984 | 0.27 | 0.223 | 0.183 | 0.15 | 0.122 | 0.098 | 0.078 | 0.06 | 0.044 | 0.031 | 0.019 |
| 0.491999999999984 | 0.27 | 0.223 | 0.183 | 0.15 | 0.122 | 0.098 | 0.078 | 0.06 | 0.044 | 0.031 | 0.019 |
| 0.492749999999984 | 0.27 | 0.223 | 0.183 | 0.15 | 0.122 | 0.098 | 0.078 | 0.06 | 0.044 | 0.03 | 0.018 |
| 0.493499999999984 | 0.27 | 0.222 | 0.183 | 0.15 | 0.122 | 0.098 | 0.077 | 0.06 | 0.044 | 0.03 | 0.018 |
| 0.494249999999984 | 0.27 | 0.222 | 0.183 | 0.15 | 0.122 | 0.098 | 0.077 | 0.059 | 0.044 | 0.03 | 0.018 |
| 0.494999999999984 | 0.27 | 0.222 | 0.183 | 0.15 | 0.122 | 0.098 | 0.077 | 0.059 | 0.044 | 0.03 | 0.018 |
| 0.495749999999984 | 0.27 | 0.222 | 0.183 | 0.149 | 0.121 | 0.098 | 0.077 | 0.059 | 0.044 | 0.03 | 0.018 |
| 0.496499999999984 | 0.27 | 0.222 | 0.182 | 0.149 | 0.121 | 0.097 | 0.077 | 0.059 | 0.043 | 0.03 | 0.018 |
| 0.497249999999984 | 0.27 | 0.222 | 0.182 | 0.149 | 0.121 | 0.097 | 0.077 | 0.059 | 0.043 | 0.03 | 0.017 |
| 0.497999999999984 | 0.269 | 0.222 | 0.182 | 0.149 | 0.121 | 0.097 | 0.076 | 0.059 | 0.043 | 0.029 | 0.017 |
| 0.498749999999984 | 0.269 | 0.222 | 0.182 | 0.149 | 0.121 | 0.097 | 0.076 | 0.058 | 0.043 | 0.029 | 0.017 |
| 0.499499999999984 | 0.269 | 0.221 | 0.182 | 0.149 | 0.121 | 0.097 | 0.076 | 0.058 | 0.043 | 0.029 | 0.017 |
| 0.500249999999984 | 0.269 | 0.221 | 0.182 | 0.149 | 0.121 | 0.097 | 0.076 | 0.058 | 0.043 | 0.029 | 0.017 |
| 0.500999999999984 | 0.269 | 0.221 | 0.182 | 0.149 | 0.12 | 0.097 | 0.076 | 0.058 | 0.042 | 0.029 | 0.017 |
| 0.501749999999984 | 0.269 | 0.221 | 0.182 | 0.148 | 0.12 | 0.096 | 0.076 | 0.058 | 0.042 | 0.029 | 0.017 |
| 0.502499999999984 | 0.269 | 0.221 | 0.181 | 0.148 | 0.12 | 0.096 | 0.076 | 0.058 | 0.042 | 0.028 | 0.016 |
| 0.503249999999984 | 0.269 | 0.221 | 0.181 | 0.148 | 0.12 | 0.096 | 0.075 | 0.058 | 0.042 | 0.028 | 0.016 |
| 0.503999999999984 | 0.269 | 0.221 | 0.181 | 0.148 | 0.12 | 0.096 | 0.075 | 0.057 | 0.042 | 0.028 | 0.016 |
| 0.504749999999984 | 0.268 | 0.221 | 0.181 | 0.148 | 0.12 | 0.096 | 0.075 | 0.057 | 0.042 | 0.028 | 0.016 |
| 0.505499999999984 | 0.268 | 0.221 | 0.181 | 0.148 | 0.12 | 0.096 | 0.075 | 0.057 | 0.042 | 0.028 | 0.016 |
| 0.506249999999984 | 0.268 | 0.22 | 0.181 | 0.148 | 0.12 | 0.096 | 0.075 | 0.057 | 0.041 | 0.028 | 0.016 |
| 0.506999999999984 | 0.268 | 0.22 | 0.181 | 0.148 | 0.119 | 0.095 | 0.075 | 0.057 | 0.041 | 0.028 | 0.015 |
| 0.507749999999984 | 0.268 | 0.22 | 0.181 | 0.147 | 0.119 | 0.095 | 0.075 | 0.057 | 0.041 | 0.027 | 0.015 |
| 0.508499999999985 | 0.268 | 0.22 | 0.181 | 0.147 | 0.119 | 0.095 | 0.074 | 0.057 | 0.041 | 0.027 | 0.015 |
| 0.509249999999985 | 0.268 | 0.22 | 0.18 | 0.147 | 0.119 | 0.095 | 0.074 | 0.056 | 0.041 | 0.027 | 0.015 |
| 0.509999999999985 | 0.268 | 0.22 | 0.18 | 0.147 | 0.119 | 0.095 | 0.074 | 0.056 | 0.041 | 0.027 | 0.015 |
| 0.510749999999985 | 0.268 | 0.22 | 0.18 | 0.147 | 0.119 | 0.095 | 0.074 | 0.056 | 0.041 | 0.027 | 0.015 |
| 0.511499999999985 | 0.268 | 0.22 | 0.18 | 0.147 | 0.119 | 0.095 | 0.074 | 0.056 | 0.04 | 0.027 | 0.015 |
| 0.512249999999985 | 0.268 | 0.22 | 0.18 | 0.147 | 0.119 | 0.094 | 0.074 | 0.056 | 0.04 | 0.027 | 0.014 |
| 0.512999999999985 | 0.267 | 0.22 | 0.18 | 0.147 | 0.118 | 0.094 | 0.074 | 0.056 | 0.04 | 0.026 | 0.014 |
| 0.513749999999985 | 0.267 | 0.219 | 0.18 | 0.146 | 0.118 | 0.094 | 0.074 | 0.056 | 0.04 | 0.026 | 0.014 |
| 0.514499999999985 | 0.267 | 0.219 | 0.18 | 0.146 | 0.118 | 0.094 | 0.073 | 0.055 | 0.04 | 0.026 | 0.014 |
| 0.515249999999985 | 0.267 | 0.219 | 0.179 | 0.146 | 0.118 | 0.094 | 0.073 | 0.055 | 0.04 | 0.026 | 0.014 |
| 0.515999999999985 | 0.267 | 0.219 | 0.179 | 0.146 | 0.118 | 0.094 | 0.073 | 0.055 | 0.04 | 0.026 | 0.014 |
| 0.516749999999985 | 0.267 | 0.219 | 0.179 | 0.146 | 0.118 | 0.094 | 0.073 | 0.055 | 0.039 | 0.026 | 0.014 |
| 0.517499999999985 | 0.267 | 0.219 | 0.179 | 0.146 | 0.118 | 0.094 | 0.073 | 0.055 | 0.039 | 0.026 | 0.013 |
| 0.518249999999985 | 0.267 | 0.219 | 0.179 | 0.146 | 0.118 | 0.093 | 0.073 | 0.055 | 0.039 | 0.025 | 0.013 |
| 0.518999999999985 | 0.267 | 0.219 | 0.179 | 0.146 | 0.117 | 0.093 | 0.073 | 0.055 | 0.039 | 0.025 | 0.013 |
| 0.519749999999985 | 0.267 | 0.219 | 0.179 | 0.145 | 0.117 | 0.093 | 0.072 | 0.055 | 0.039 | 0.025 | 0.013 |
| 0.520499999999985 | 0.267 | 0.219 | 0.179 | 0.145 | 0.117 | 0.093 | 0.072 | 0.054 | 0.039 | 0.025 | 0.013 |
| 0.521249999999985 | 0.266 | 0.218 | 0.179 | 0.145 | 0.117 | 0.093 | 0.072 | 0.054 | 0.039 | 0.025 | 0.013 |
| 0.521999999999985 | 0.266 | 0.218 | 0.179 | 0.145 | 0.117 | 0.093 | 0.072 | 0.054 | 0.038 | 0.025 | 0.013 |
| 0.522749999999985 | 0.266 | 0.218 | 0.178 | 0.145 | 0.117 | 0.093 | 0.072 | 0.054 | 0.038 | 0.025 | 0.012 |
| 0.523499999999985 | 0.266 | 0.218 | 0.178 | 0.145 | 0.117 | 0.093 | 0.072 | 0.054 | 0.038 | 0.024 | 0.012 |
| 0.524249999999985 | 0.266 | 0.218 | 0.178 | 0.145 | 0.117 | 0.092 | 0.072 | 0.054 | 0.038 | 0.024 | 0.012 |
| 0.524999999999985 | 0.266 | 0.218 | 0.178 | 0.145 | 0.116 | 0.092 | 0.072 | 0.054 | 0.038 | 0.024 | 0.012 |
| 0.525749999999985 | 0.266 | 0.218 | 0.178 | 0.145 | 0.116 | 0.092 | 0.071 | 0.053 | 0.038 | 0.024 | 0.012 |
| 0.526499999999985 | 0.266 | 0.218 | 0.178 | 0.144 | 0.116 | 0.092 | 0.071 | 0.053 | 0.038 | 0.024 | 0.012 |
| 0.527249999999985 | 0.266 | 0.218 | 0.178 | 0.144 | 0.116 | 0.092 | 0.071 | 0.053 | 0.038 | 0.024 | 0.012 |
| 0.527999999999985 | 0.266 | 0.218 | 0.178 | 0.144 | 0.116 | 0.092 | 0.071 | 0.053 | 0.037 | 0.024 | 0.011 |
| 0.528749999999985 | 0.266 | 0.217 | 0.178 | 0.144 | 0.116 | 0.092 | 0.071 | 0.053 | 0.037 | 0.023 | 0.011 |
| 0.529499999999985 | 0.266 | 0.217 | 0.177 | 0.144 | 0.116 | 0.092 | 0.071 | 0.053 | 0.037 | 0.023 | 0.011 |
| 0.530249999999985 | 0.265 | 0.217 | 0.177 | 0.144 | 0.116 | 0.092 | 0.071 | 0.053 | 0.037 | 0.023 | 0.011 |
| 0.530999999999985 | 0.265 | 0.217 | 0.177 | 0.144 | 0.116 | 0.091 | 0.071 | 0.053 | 0.037 | 0.023 | 0.011 |
| 0.531749999999985 | 0.265 | 0.217 | 0.177 | 0.144 | 0.115 | 0.091 | 0.07 | 0.052 | 0.037 | 0.023 | 0.011 |
| 0.532499999999985 | 0.265 | 0.217 | 0.177 | 0.144 | 0.115 | 0.091 | 0.07 | 0.052 | 0.037 | 0.023 | 0.011 |
| 0.533249999999985 | 0.265 | 0.217 | 0.177 | 0.144 | 0.115 | 0.091 | 0.07 | 0.052 | 0.036 | 0.023 | 0.01 |
| 0.533999999999985 | 0.265 | 0.217 | 0.177 | 0.143 | 0.115 | 0.091 | 0.07 | 0.052 | 0.036 | 0.023 | 0.01 |
| 0.534749999999986 | 0.265 | 0.217 | 0.177 | 0.143 | 0.115 | 0.091 | 0.07 | 0.052 | 0.036 | 0.022 | 0.01 |
| 0.535499999999986 | 0.265 | 0.217 | 0.177 | 0.143 | 0.115 | 0.091 | 0.07 | 0.052 | 0.036 | 0.022 | 0.01 |
| 0.536249999999986 | 0.265 | 0.217 | 0.177 | 0.143 | 0.115 | 0.091 | 0.07 | 0.052 | 0.036 | 0.022 | 0.01 |
| 0.536999999999986 | 0.265 | 0.217 | 0.177 | 0.143 | 0.115 | 0.091 | 0.07 | 0.052 | 0.036 | 0.022 | 0.01 |
| 0.537749999999986 | 0.265 | 0.216 | 0.176 | 0.143 | 0.115 | 0.09 | 0.07 | 0.052 | 0.036 | 0.022 | 0.01 |
| 0.538499999999986 | 0.265 | 0.216 | 0.176 | 0.143 | 0.114 | 0.09 | 0.069 | 0.051 | 0.036 | 0.022 | 0.01 |
| 0.539249999999986 | 0.265 | 0.216 | 0.176 | 0.143 | 0.114 | 0.09 | 0.069 | 0.051 | 0.036 | 0.022 | 0.009 |
| 0.539999999999986 | 0.264 | 0.216 | 0.176 | 0.143 | 0.114 | 0.09 | 0.069 | 0.051 | 0.035 | 0.022 | 0.009 |
| 0.540749999999986 | 0.264 | 0.216 | 0.176 | 0.143 | 0.114 | 0.09 | 0.069 | 0.051 | 0.035 | 0.021 | 0.009 |
| 0.541499999999986 | 0.264 | 0.216 | 0.176 | 0.142 | 0.114 | 0.09 | 0.069 | 0.051 | 0.035 | 0.021 | 0.009 |
| 0.542249999999986 | 0.264 | 0.216 | 0.176 | 0.142 | 0.114 | 0.09 | 0.069 | 0.051 | 0.035 | 0.021 | 0.009 |
| 0.542999999999986 | 0.264 | 0.216 | 0.176 | 0.142 | 0.114 | 0.09 | 0.069 | 0.051 | 0.035 | 0.021 | 0.009 |
| 0.543749999999986 | 0.264 | 0.216 | 0.176 | 0.142 | 0.114 | 0.09 | 0.069 | 0.051 | 0.035 | 0.021 | 0.009 |
| 0.544499999999986 | 0.264 | 0.216 | 0.176 | 0.142 | 0.114 | 0.089 | 0.069 | 0.05 | 0.035 | 0.021 | 0.009 |
| 0.545249999999986 | 0.264 | 0.216 | 0.176 | 0.142 | 0.114 | 0.089 | 0.068 | 0.05 | 0.035 | 0.021 | 0.009 |
| 0.545999999999986 | 0.264 | 0.216 | 0.175 | 0.142 | 0.113 | 0.089 | 0.068 | 0.05 | 0.034 | 0.021 | 0.008 |
| 0.546749999999986 | 0.264 | 0.215 | 0.175 | 0.142 | 0.113 | 0.089 | 0.068 | 0.05 | 0.034 | 0.02 | 0.008 |
| 0.547499999999986 | 0.264 | 0.215 | 0.175 | 0.142 | 0.113 | 0.089 | 0.068 | 0.05 | 0.034 | 0.02 | 0.008 |
| 0.548249999999986 | 0.264 | 0.215 | 0.175 | 0.142 | 0.113 | 0.089 | 0.068 | 0.05 | 0.034 | 0.02 | 0.008 |
| 0.548999999999986 | 0.264 | 0.215 | 0.175 | 0.142 | 0.113 | 0.089 | 0.068 | 0.05 | 0.034 | 0.02 | 0.008 |
| 0.549749999999986 | 0.264 | 0.215 | 0.175 | 0.141 | 0.113 | 0.089 | 0.068 | 0.05 | 0.034 | 0.02 | 0.008 |
| 0.550499999999986 | 0.264 | 0.215 | 0.175 | 0.141 | 0.113 | 0.089 | 0.068 | 0.05 | 0.034 | 0.02 | 0.008 |
| 0.551249999999986 | 0.263 | 0.215 | 0.175 | 0.141 | 0.113 | 0.089 | 0.068 | 0.05 | 0.034 | 0.02 | 0.008 |
| 0.551999999999986 | 0.263 | 0.215 | 0.175 | 0.141 | 0.113 | 0.088 | 0.068 | 0.049 | 0.034 | 0.02 | 0.007 |
| 0.552749999999986 | 0.263 | 0.215 | 0.175 | 0.141 | 0.113 | 0.088 | 0.067 | 0.049 | 0.033 | 0.02 | 0.007 |
| 0.553499999999986 | 0.263 | 0.215 | 0.175 | 0.141 | 0.113 | 0.088 | 0.067 | 0.049 | 0.033 | 0.019 | 0.007 |
| 0.554249999999986 | 0.263 | 0.215 | 0.175 | 0.141 | 0.112 | 0.088 | 0.067 | 0.049 | 0.033 | 0.019 | 0.007 |
| 0.554999999999986 | 0.263 | 0.215 | 0.175 | 0.141 | 0.112 | 0.088 | 0.067 | 0.049 | 0.033 | 0.019 | 0.007 |
| 0.555749999999986 | 0.263 | 0.215 | 0.174 | 0.141 | 0.112 | 0.088 | 0.067 | 0.049 | 0.033 | 0.019 | 0.007 |
| 0.556499999999986 | 0.263 | 0.215 | 0.174 | 0.141 | 0.112 | 0.088 | 0.067 | 0.049 | 0.033 | 0.019 | 0.007 |
| 0.557249999999986 | 0.263 | 0.215 | 0.174 | 0.141 | 0.112 | 0.088 | 0.067 | 0.049 | 0.033 | 0.019 | 0.007 |
| 0.557999999999986 | 0.263 | 0.214 | 0.174 | 0.141 | 0.112 | 0.088 | 0.067 | 0.049 | 0.033 | 0.019 | 0.007 |
| 0.558749999999986 | 0.263 | 0.214 | 0.174 | 0.14 | 0.112 | 0.088 | 0.067 | 0.049 | 0.033 | 0.019 | 0.006 |
| 0.559499999999986 | 0.263 | 0.214 | 0.174 | 0.14 | 0.112 | 0.088 | 0.067 | 0.048 | 0.033 | 0.019 | 0.006 |
| 0.560249999999986 | 0.263 | 0.214 | 0.174 | 0.14 | 0.112 | 0.087 | 0.066 | 0.048 | 0.032 | 0.019 | 0.006 |
| 0.560999999999986 | 0.263 | 0.214 | 0.174 | 0.14 | 0.112 | 0.087 | 0.066 | 0.048 | 0.032 | 0.018 | 0.006 |
| 0.561749999999987 | 0.263 | 0.214 | 0.174 | 0.14 | 0.112 | 0.087 | 0.066 | 0.048 | 0.032 | 0.018 | 0.006 |
| 0.562499999999987 | 0.263 | 0.214 | 0.174 | 0.14 | 0.112 | 0.087 | 0.066 | 0.048 | 0.032 | 0.018 | 0.006 |
| 0.563249999999987 | 0.263 | 0.214 | 0.174 | 0.14 | 0.111 | 0.087 | 0.066 | 0.048 | 0.032 | 0.018 | 0.006 |
| 0.563999999999987 | 0.263 | 0.214 | 0.174 | 0.14 | 0.111 | 0.087 | 0.066 | 0.048 | 0.032 | 0.018 | 0.006 |
| 0.564749999999987 | 0.263 | 0.214 | 0.174 | 0.14 | 0.111 | 0.087 | 0.066 | 0.048 | 0.032 | 0.018 | 0.006 |
| 0.565499999999987 | 0.262 | 0.214 | 0.174 | 0.14 | 0.111 | 0.087 | 0.066 | 0.048 | 0.032 | 0.018 | 0.006 |
| 0.566249999999987 | 0.262 | 0.214 | 0.174 | 0.14 | 0.111 | 0.087 | 0.066 | 0.048 | 0.032 | 0.018 | 0.005 |
| 0.566999999999987 | 0.262 | 0.214 | 0.173 | 0.14 | 0.111 | 0.087 | 0.066 | 0.047 | 0.032 | 0.018 | 0.005 |
| 0.567749999999987 | 0.262 | 0.214 | 0.173 | 0.14 | 0.111 | 0.087 | 0.066 | 0.047 | 0.032 | 0.018 | 0.005 |
| 0.568499999999987 | 0.262 | 0.214 | 0.173 | 0.14 | 0.111 | 0.087 | 0.066 | 0.047 | 0.031 | 0.017 | 0.005 |
| 0.569249999999987 | 0.262 | 0.214 | 0.173 | 0.139 | 0.111 | 0.086 | 0.065 | 0.047 | 0.031 | 0.017 | 0.005 |
| 0.569999999999987 | 0.262 | 0.214 | 0.173 | 0.139 | 0.111 | 0.086 | 0.065 | 0.047 | 0.031 | 0.017 | 0.005 |
| 0.570749999999987 | 0.262 | 0.213 | 0.173 | 0.139 | 0.111 | 0.086 | 0.065 | 0.047 | 0.031 | 0.017 | 0.005 |
| 0.571499999999987 | 0.262 | 0.213 | 0.173 | 0.139 | 0.111 | 0.086 | 0.065 | 0.047 | 0.031 | 0.017 | 0.005 |
| 0.572249999999987 | 0.262 | 0.213 | 0.173 | 0.139 | 0.111 | 0.086 | 0.065 | 0.047 | 0.031 | 0.017 | 0.005 |
| 0.572999999999987 | 0.262 | 0.213 | 0.173 | 0.139 | 0.111 | 0.086 | 0.065 | 0.047 | 0.031 | 0.017 | 0.005 |
| 0.573749999999987 | 0.262 | 0.213 | 0.173 | 0.139 | 0.11 | 0.086 | 0.065 | 0.047 | 0.031 | 0.017 | 0.005 |
| 0.574499999999987 | 0.262 | 0.213 | 0.173 | 0.139 | 0.11 | 0.086 | 0.065 | 0.047 | 0.031 | 0.017 | 0.004 |
| 0.575249999999987 | 0.262 | 0.213 | 0.173 | 0.139 | 0.11 | 0.086 | 0.065 | 0.047 | 0.031 | 0.017 | 0.004 |
| 0.575999999999987 | 0.262 | 0.213 | 0.173 | 0.139 | 0.11 | 0.086 | 0.065 | 0.046 | 0.031 | 0.017 | 0.004 |
| 0.576749999999987 | 0.262 | 0.213 | 0.173 | 0.139 | 0.11 | 0.086 | 0.065 | 0.046 | 0.03 | 0.017 | 0.004 |
| 0.577499999999987 | 0.262 | 0.213 | 0.173 | 0.139 | 0.11 | 0.086 | 0.065 | 0.046 | 0.03 | 0.016 | 0.004 |
| 0.578249999999987 | 0.262 | 0.213 | 0.173 | 0.139 | 0.11 | 0.086 | 0.065 | 0.046 | 0.03 | 0.016 | 0.004 |
| 0.578999999999987 | 0.262 | 0.213 | 0.173 | 0.139 | 0.11 | 0.086 | 0.064 | 0.046 | 0.03 | 0.016 | 0.004 |
| 0.579749999999987 | 0.262 | 0.213 | 0.173 | 0.139 | 0.11 | 0.085 | 0.064 | 0.046 | 0.03 | 0.016 | 0.004 |
| 0.580499999999987 | 0.262 | 0.213 | 0.172 | 0.139 | 0.11 | 0.085 | 0.064 | 0.046 | 0.03 | 0.016 | 0.004 |
| 0.581249999999987 | 0.262 | 0.213 | 0.172 | 0.139 | 0.11 | 0.085 | 0.064 | 0.046 | 0.03 | 0.016 | 0.004 |
| 0.581999999999987 | 0.262 | 0.213 | 0.172 | 0.138 | 0.11 | 0.085 | 0.064 | 0.046 | 0.03 | 0.016 | 0.004 |
| 0.582749999999987 | 0.262 | 0.213 | 0.172 | 0.138 | 0.11 | 0.085 | 0.064 | 0.046 | 0.03 | 0.016 | 0.004 |
| 0.583499999999987 | 0.262 | 0.213 | 0.172 | 0.138 | 0.11 | 0.085 | 0.064 | 0.046 | 0.03 | 0.016 | 0.003 |
| 0.584249999999987 | 0.262 | 0.213 | 0.172 | 0.138 | 0.11 | 0.085 | 0.064 | 0.046 | 0.03 | 0.016 | 0.003 |
| 0.584999999999987 | 0.262 | 0.213 | 0.172 | 0.138 | 0.11 | 0.085 | 0.064 | 0.046 | 0.03 | 0.016 | 0.003 |
| 0.585749999999987 | 0.262 | 0.213 | 0.172 | 0.138 | 0.109 | 0.085 | 0.064 | 0.046 | 0.03 | 0.016 | 0.003 |
| 0.586499999999987 | 0.262 | 0.213 | 0.172 | 0.138 | 0.109 | 0.085 | 0.064 | 0.045 | 0.029 | 0.015 | 0.003 |
| 0.587249999999987 | 0.261 | 0.213 | 0.172 | 0.138 | 0.109 | 0.085 | 0.064 | 0.045 | 0.029 | 0.015 | 0.003 |
| 0.587999999999988 | 0.261 | 0.213 | 0.172 | 0.138 | 0.109 | 0.085 | 0.064 | 0.045 | 0.029 | 0.015 | 0.003 |
| 0.588749999999988 | 0.261 | 0.213 | 0.172 | 0.138 | 0.109 | 0.085 | 0.064 | 0.045 | 0.029 | 0.015 | 0.003 |
| 0.589499999999988 | 0.261 | 0.212 | 0.172 | 0.138 | 0.109 | 0.085 | 0.064 | 0.045 | 0.029 | 0.015 | 0.003 |
| 0.590249999999988 | 0.261 | 0.212 | 0.172 | 0.138 | 0.109 | 0.085 | 0.063 | 0.045 | 0.029 | 0.015 | 0.003 |
| 0.590999999999988 | 0.261 | 0.212 | 0.172 | 0.138 | 0.109 | 0.085 | 0.063 | 0.045 | 0.029 | 0.015 | 0.003 |
| 0.591749999999988 | 0.261 | 0.212 | 0.172 | 0.138 | 0.109 | 0.084 | 0.063 | 0.045 | 0.029 | 0.015 | 0.003 |
| 0.592499999999988 | 0.261 | 0.212 | 0.172 | 0.138 | 0.109 | 0.084 | 0.063 | 0.045 | 0.029 | 0.015 | 0.003 |
| 0.593249999999988 | 0.261 | 0.212 | 0.172 | 0.138 | 0.109 | 0.084 | 0.063 | 0.045 | 0.029 | 0.015 | 0.002 |
| 0.593999999999988 | 0.261 | 0.212 | 0.172 | 0.138 | 0.109 | 0.084 | 0.063 | 0.045 | 0.029 | 0.015 | 0.002 |
| 0.594749999999988 | 0.261 | 0.212 | 0.172 | 0.138 | 0.109 | 0.084 | 0.063 | 0.045 | 0.029 | 0.015 | 0.002 |
| 0.595499999999988 | 0.261 | 0.212 | 0.172 | 0.138 | 0.109 | 0.084 | 0.063 | 0.045 | 0.029 | 0.015 | 0.002 |
| 0.596249999999988 | 0.261 | 0.212 | 0.172 | 0.138 | 0.109 | 0.084 | 0.063 | 0.045 | 0.029 | 0.015 | 0.002 |
| 0.596999999999988 | 0.261 | 0.212 | 0.172 | 0.138 | 0.109 | 0.084 | 0.063 | 0.045 | 0.029 | 0.015 | 0.002 |
| 0.597749999999988 | 0.261 | 0.212 | 0.172 | 0.138 | 0.109 | 0.084 | 0.063 | 0.045 | 0.029 | 0.014 | 0.002 |
| 0.598499999999988 | 0.261 | 0.212 | 0.172 | 0.137 | 0.109 | 0.084 | 0.063 | 0.044 | 0.028 | 0.014 | 0.002 |
| 0.599249999999988 | 0.261 | 0.212 | 0.172 | 0.137 | 0.109 | 0.084 | 0.063 | 0.044 | 0.028 | 0.014 | 0.002 |
| 0.599999999999988 | 0.261 | 0.212 | 0.172 | 0.137 | 0.109 | 0.084 | 0.063 | 0.044 | 0.028 | 0.014 | 0.002 |
| 0.600749999999988 | 0.261 | 0.212 | 0.171 | 0.137 | 0.109 | 0.084 | 0.063 | 0.044 | 0.028 | 0.014 | 0.002 |
| 0.601499999999988 | 0.261 | 0.212 | 0.171 | 0.137 | 0.109 | 0.084 | 0.063 | 0.044 | 0.028 | 0.014 | 0.002 |
| 0.602249999999988 | 0.261 | 0.212 | 0.171 | 0.137 | 0.108 | 0.084 | 0.063 | 0.044 | 0.028 | 0.014 | 0.002 |
| 0.602999999999988 | 0.261 | 0.212 | 0.171 | 0.137 | 0.108 | 0.084 | 0.063 | 0.044 | 0.028 | 0.014 | 0.002 |
| 0.603749999999988 | 0.261 | 0.212 | 0.171 | 0.137 | 0.108 | 0.084 | 0.063 | 0.044 | 0.028 | 0.014 | 0.002 |
| 0.604499999999988 | 0.261 | 0.212 | 0.171 | 0.137 | 0.108 | 0.084 | 0.062 | 0.044 | 0.028 | 0.014 | 0.002 |
| 0.605249999999988 | 0.261 | 0.212 | 0.171 | 0.137 | 0.108 | 0.084 | 0.062 | 0.044 | 0.028 | 0.014 | 0.001 |
| 0.605999999999988 | 0.261 | 0.212 | 0.171 | 0.137 | 0.108 | 0.084 | 0.062 | 0.044 | 0.028 | 0.014 | 0.001 |
| 0.606749999999988 | 0.261 | 0.212 | 0.171 | 0.137 | 0.108 | 0.084 | 0.062 | 0.044 | 0.028 | 0.014 | 0.001 |
| 0.607499999999988 | 0.261 | 0.212 | 0.171 | 0.137 | 0.108 | 0.084 | 0.062 | 0.044 | 0.028 | 0.014 | 0.001 |
| 0.608249999999988 | 0.261 | 0.212 | 0.171 | 0.137 | 0.108 | 0.084 | 0.062 | 0.044 | 0.028 | 0.014 | 0.001 |
| 0.608999999999988 | 0.261 | 0.212 | 0.171 | 0.137 | 0.108 | 0.084 | 0.062 | 0.044 | 0.028 | 0.014 | 0.001 |
| 0.609749999999988 | 0.261 | 0.212 | 0.171 | 0.137 | 0.108 | 0.083 | 0.062 | 0.044 | 0.028 | 0.014 | 0.001 |
| 0.610499999999988 | 0.261 | 0.212 | 0.171 | 0.137 | 0.108 | 0.083 | 0.062 | 0.044 | 0.028 | 0.014 | 0.001 |
| 0.611249999999988 | 0.261 | 0.212 | 0.171 | 0.137 | 0.108 | 0.083 | 0.062 | 0.044 | 0.028 | 0.014 | 0.001 |
| 0.611999999999988 | 0.261 | 0.212 | 0.171 | 0.137 | 0.108 | 0.083 | 0.062 | 0.044 | 0.028 | 0.013 | 0.001 |
| 0.612749999999988 | 0.261 | 0.212 | 0.171 | 0.137 | 0.108 | 0.083 | 0.062 | 0.044 | 0.028 | 0.013 | 0.001 |
| 0.613499999999988 | 0.261 | 0.212 | 0.171 | 0.137 | 0.108 | 0.083 | 0.062 | 0.044 | 0.028 | 0.013 | 0.001 |
| 0.614249999999988 | 0.261 | 0.212 | 0.171 | 0.137 | 0.108 | 0.083 | 0.062 | 0.044 | 0.027 | 0.013 | 0.001 |
| 0.614999999999988 | 0.261 | 0.212 | 0.171 | 0.137 | 0.108 | 0.083 | 0.062 | 0.044 | 0.027 | 0.013 | 0.001 |
| 0.615749999999988 | 0.261 | 0.212 | 0.171 | 0.137 | 0.108 | 0.083 | 0.062 | 0.044 | 0.027 | 0.013 | 0.001 |
| 0.616499999999989 | 0.261 | 0.212 | 0.171 | 0.137 | 0.108 | 0.083 | 0.062 | 0.043 | 0.027 | 0.013 | 0.001 |
| 0.617249999999989 | 0.261 | 0.212 | 0.171 | 0.137 | 0.108 | 0.083 | 0.062 | 0.043 | 0.027 | 0.013 | 0.001 |
| 0.617999999999989 | 0.261 | 0.212 | 0.171 | 0.137 | 0.108 | 0.083 | 0.062 | 0.043 | 0.027 | 0.013 | 0.001 |
| 0.618749999999989 | 0.261 | 0.212 | 0.171 | 0.137 | 0.108 | 0.083 | 0.062 | 0.043 | 0.027 | 0.013 | 0.001 |
| 0.619499999999989 | 0.261 | 0.212 | 0.171 | 0.137 | 0.108 | 0.083 | 0.062 | 0.043 | 0.027 | 0.013 | 0.001 |
| 0.620249999999989 | 0.261 | 0.212 | 0.171 | 0.137 | 0.108 | 0.083 | 0.062 | 0.043 | 0.027 | 0.013 | 0.001 |
| 0.620999999999989 | 0.261 | 0.212 | 0.171 | 0.137 | 0.108 | 0.083 | 0.062 | 0.043 | 0.027 | 0.013 | 0.001 |
| 0.621749999999989 | 0.261 | 0.212 | 0.171 | 0.137 | 0.108 | 0.083 | 0.062 | 0.043 | 0.027 | 0.013 | 0.001 |
| 0.622499999999989 | 0.261 | 0.212 | 0.171 | 0.137 | 0.108 | 0.083 | 0.062 | 0.043 | 0.027 | 0.013 | 0.001 |
| 0.623249999999989 | 0.261 | 0.212 | 0.171 | 0.137 | 0.108 | 0.083 | 0.062 | 0.043 | 0.027 | 0.013 | 0 |
| 0.623999999999989 | 0.262 | 0.212 | 0.171 | 0.137 | 0.108 | 0.083 | 0.062 | 0.043 | 0.027 | 0.013 | 0 |
| 0.624749999999989 | 0.262 | 0.212 | 0.171 | 0.137 | 0.108 | 0.083 | 0.062 | 0.043 | 0.027 | 0.013 | 0 |
| 0.625499999999989 | 0.262 | 0.212 | 0.171 | 0.137 | 0.108 | 0.083 | 0.062 | 0.043 | 0.027 | 0.013 | 0 |
| 0.626249999999989 | 0.262 | 0.212 | 0.171 | 0.137 | 0.108 | 0.083 | 0.062 | 0.043 | 0.027 | 0.013 | 0 |
| 0.626999999999989 | 0.262 | 0.212 | 0.171 | 0.137 | 0.108 | 0.083 | 0.062 | 0.043 | 0.027 | 0.013 | 0 |
| 0.627749999999989 | 0.262 | 0.212 | 0.171 | 0.137 | 0.108 | 0.083 | 0.062 | 0.043 | 0.027 | 0.013 | 0 |
| 0.628499999999989 | 0.262 | 0.212 | 0.171 | 0.137 | 0.108 | 0.083 | 0.062 | 0.043 | 0.027 | 0.013 | 0 |
| 0.629249999999989 | 0.262 | 0.212 | 0.171 | 0.137 | 0.108 | 0.083 | 0.062 | 0.043 | 0.027 | 0.013 | 0 |
| 0.629999999999989 | 0.262 | 0.212 | 0.171 | 0.137 | 0.108 | 0.083 | 0.062 | 0.043 | 0.027 | 0.013 | 0 |
| 0.630749999999989 | 0.262 | 0.212 | 0.171 | 0.137 | 0.108 | 0.083 | 0.062 | 0.043 | 0.027 | 0.013 | 0 |
| 0.631499999999989 | 0.262 | 0.212 | 0.171 | 0.137 | 0.108 | 0.083 | 0.062 | 0.043 | 0.027 | 0.013 | 0 |
| 0.632249999999989 | 0.262 | 0.212 | 0.171 | 0.137 | 0.108 | 0.083 | 0.062 | 0.043 | 0.027 | 0.013 | 0 |
| 0.632999999999989 | 0.262 | 0.212 | 0.171 | 0.137 | 0.108 | 0.083 | 0.062 | 0.043 | 0.027 | 0.013 | 0 |
| 0.633749999999989 | 0.262 | 0.212 | 0.171 | 0.137 | 0.108 | 0.083 | 0.062 | 0.043 | 0.027 | 0.013 | 0 |
| 0.634499999999989 | 0.262 | 0.212 | 0.171 | 0.137 | 0.108 | 0.083 | 0.062 | 0.043 | 0.027 | 0.013 | 0 |
| 0.635249999999989 | 0.262 | 0.212 | 0.171 | 0.137 | 0.108 | 0.083 | 0.062 | 0.043 | 0.027 | 0.013 | 0 |
| 0.635999999999989 | 0.262 | 0.212 | 0.171 | 0.137 | 0.108 | 0.083 | 0.062 | 0.043 | 0.027 | 0.013 | 0 |
| 0.636749999999989 | 0.262 | 0.212 | 0.171 | 0.137 | 0.108 | 0.083 | 0.062 | 0.043 | 0.027 | 0.013 | 0 |
| 0.637499999999989 | 0.262 | 0.213 | 0.171 | 0.137 | 0.108 | 0.083 | 0.062 | 0.043 | 0.027 | 0.013 | 0 |
| 0.638249999999989 | 0.262 | 0.213 | 0.171 | 0.137 | 0.108 | 0.083 | 0.062 | 0.043 | 0.027 | 0.013 | 0 |
| 0.638999999999989 | 0.262 | 0.213 | 0.171 | 0.137 | 0.108 | 0.083 | 0.062 | 0.043 | 0.027 | 0.013 | 0 |
| 0.639749999999989 | 0.262 | 0.213 | 0.172 | 0.137 | 0.108 | 0.083 | 0.062 | 0.043 | 0.027 | 0.013 | 0 |
| 0.640499999999989 | 0.262 | 0.213 | 0.172 | 0.137 | 0.108 | 0.083 | 0.062 | 0.043 | 0.027 | 0.013 | 0 |
| 0.641249999999989 | 0.262 | 0.213 | 0.172 | 0.137 | 0.108 | 0.083 | 0.062 | 0.043 | 0.027 | 0.013 | 0 |
| 0.641999999999989 | 0.262 | 0.213 | 0.172 | 0.137 | 0.108 | 0.083 | 0.062 | 0.043 | 0.027 | 0.013 | 0 |
| 0.64274999999999 | 0.262 | 0.213 | 0.172 | 0.137 | 0.108 | 0.083 | 0.062 | 0.043 | 0.027 | 0.013 | 0 |
| 0.64349999999999 | 0.262 | 0.213 | 0.172 | 0.137 | 0.108 | 0.083 | 0.062 | 0.043 | 0.027 | 0.013 | 0 |
| 0.64424999999999 | 0.263 | 0.213 | 0.172 | 0.137 | 0.108 | 0.083 | 0.062 | 0.043 | 0.027 | 0.013 | 0 |
| 0.64499999999999 | 0.263 | 0.213 | 0.172 | 0.137 | 0.108 | 0.083 | 0.062 | 0.043 | 0.027 | 0.013 | 0 |
| 0.64574999999999 | 0.263 | 0.213 | 0.172 | 0.137 | 0.108 | 0.083 | 0.062 | 0.043 | 0.027 | 0.013 | 0 |
| 0.64649999999999 | 0.263 | 0.213 | 0.172 | 0.137 | 0.108 | 0.083 | 0.062 | 0.043 | 0.027 | 0.013 | 0 |
| 0.64724999999999 | 0.263 | 0.213 | 0.172 | 0.137 | 0.108 | 0.083 | 0.062 | 0.043 | 0.027 | 0.013 | 0 |
| 0.64799999999999 | 0.263 | 0.213 | 0.172 | 0.137 | 0.108 | 0.083 | 0.062 | 0.043 | 0.027 | 0.013 | 0 |
| 0.64874999999999 | 0.263 | 0.213 | 0.172 | 0.137 | 0.108 | 0.083 | 0.062 | 0.043 | 0.027 | 0.013 | 0 |
| 0.64949999999999 | 0.263 | 0.213 | 0.172 | 0.137 | 0.108 | 0.083 | 0.062 | 0.043 | 0.027 | 0.013 | 0 |
| 0.65024999999999 | 0.263 | 0.213 | 0.172 | 0.137 | 0.108 | 0.083 | 0.062 | 0.043 | 0.027 | 0.013 | 0 |
| 0.65099999999999 | 0.263 | 0.213 | 0.172 | 0.137 | 0.108 | 0.083 | 0.062 | 0.043 | 0.027 | 0.013 | 0 |
| 0.65174999999999 | 0.263 | 0.213 | 0.172 | 0.137 | 0.108 | 0.083 | 0.062 | 0.043 | 0.027 | 0.013 | 0 |
| 0.65249999999999 | 0.263 | 0.213 | 0.172 | 0.138 | 0.108 | 0.083 | 0.062 | 0.043 | 0.027 | 0.013 | 0 |
| 0.65324999999999 | 0.263 | 0.213 | 0.172 | 0.138 | 0.108 | 0.083 | 0.062 | 0.043 | 0.027 | 0.013 | 0 |
| 0.65399999999999 | 0.263 | 0.213 | 0.172 | 0.138 | 0.108 | 0.083 | 0.062 | 0.043 | 0.027 | 0.013 | 0 |
| 0.65474999999999 | 0.263 | 0.214 | 0.172 | 0.138 | 0.108 | 0.083 | 0.062 | 0.043 | 0.027 | 0.013 | 0 |
| 0.65549999999999 | 0.263 | 0.214 | 0.172 | 0.138 | 0.108 | 0.083 | 0.062 | 0.043 | 0.027 | 0.013 | 0 |
| 0.65624999999999 | 0.263 | 0.214 | 0.172 | 0.138 | 0.108 | 0.083 | 0.062 | 0.043 | 0.027 | 0.013 | 0 |
| 0.65699999999999 | 0.264 | 0.214 | 0.172 | 0.138 | 0.108 | 0.083 | 0.062 | 0.043 | 0.027 | 0.013 | 0 |
| 0.65774999999999 | 0.264 | 0.214 | 0.172 | 0.138 | 0.109 | 0.083 | 0.062 | 0.043 | 0.027 | 0.013 | 0 |
| 0.65849999999999 | 0.264 | 0.214 | 0.172 | 0.138 | 0.109 | 0.084 | 0.062 | 0.043 | 0.027 | 0.013 | 0 |
| 0.65924999999999 | 0.264 | 0.214 | 0.173 | 0.138 | 0.109 | 0.084 | 0.062 | 0.043 | 0.027 | 0.013 | 0 |
| 0.65999999999999 | 0.264 | 0.214 | 0.173 | 0.138 | 0.109 | 0.084 | 0.062 | 0.043 | 0.027 | 0.013 | 0 |
| 0.66074999999999 | 0.264 | 0.214 | 0.173 | 0.138 | 0.109 | 0.084 | 0.062 | 0.043 | 0.027 | 0.013 | 0 |
| 0.66149999999999 | 0.264 | 0.214 | 0.173 | 0.138 | 0.109 | 0.084 | 0.062 | 0.043 | 0.027 | 0.013 | 0 |
| 0.66224999999999 | 0.264 | 0.214 | 0.173 | 0.138 | 0.109 | 0.084 | 0.062 | 0.043 | 0.027 | 0.013 | 0 |
| 0.66299999999999 | 0.264 | 0.214 | 0.173 | 0.138 | 0.109 | 0.084 | 0.062 | 0.044 | 0.027 | 0.013 | 0 |
| 0.66374999999999 | 0.264 | 0.214 | 0.173 | 0.138 | 0.109 | 0.084 | 0.062 | 0.044 | 0.027 | 0.013 | 0 |
| 0.66449999999999 | 0.264 | 0.214 | 0.173 | 0.138 | 0.109 | 0.084 | 0.062 | 0.044 | 0.027 | 0.013 | 0 |
| 0.66524999999999 | 0.264 | 0.214 | 0.173 | 0.138 | 0.109 | 0.084 | 0.062 | 0.044 | 0.027 | 0.013 | 0 |
| 0.66599999999999 | 0.264 | 0.214 | 0.173 | 0.138 | 0.109 | 0.084 | 0.062 | 0.044 | 0.027 | 0.013 | 0 |
| 0.66674999999999 | 0.265 | 0.215 | 0.173 | 0.138 | 0.109 | 0.084 | 0.062 | 0.044 | 0.027 | 0.013 | 0 |
| 0.66749999999999 | 0.265 | 0.215 | 0.173 | 0.138 | 0.109 | 0.084 | 0.062 | 0.044 | 0.027 | 0.013 | 0 |
| 0.66824999999999 | 0.265 | 0.215 | 0.173 | 0.139 | 0.109 | 0.084 | 0.062 | 0.044 | 0.027 | 0.013 | 0 |
| 0.66899999999999 | 0.265 | 0.215 | 0.173 | 0.139 | 0.109 | 0.084 | 0.063 | 0.044 | 0.027 | 0.013 | 0.001 |
| 0.669749999999991 | 0.265 | 0.215 | 0.173 | 0.139 | 0.109 | 0.084 | 0.063 | 0.044 | 0.028 | 0.013 | 0.001 |
| 0.670499999999991 | 0.265 | 0.215 | 0.173 | 0.139 | 0.109 | 0.084 | 0.063 | 0.044 | 0.028 | 0.013 | 0.001 |
| 0.671249999999991 | 0.265 | 0.215 | 0.174 | 0.139 | 0.109 | 0.084 | 0.063 | 0.044 | 0.028 | 0.013 | 0.001 |
| 0.671999999999991 | 0.265 | 0.215 | 0.174 | 0.139 | 0.109 | 0.084 | 0.063 | 0.044 | 0.028 | 0.013 | 0.001 |
| 0.672749999999991 | 0.265 | 0.215 | 0.174 | 0.139 | 0.11 | 0.084 | 0.063 | 0.044 | 0.028 | 0.013 | 0.001 |
| 0.673499999999991 | 0.265 | 0.215 | 0.174 | 0.139 | 0.11 | 0.084 | 0.063 | 0.044 | 0.028 | 0.013 | 0.001 |
| 0.674249999999991 | 0.265 | 0.215 | 0.174 | 0.139 | 0.11 | 0.085 | 0.063 | 0.044 | 0.028 | 0.013 | 0.001 |
| 0.674999999999991 | 0.266 | 0.215 | 0.174 | 0.139 | 0.11 | 0.085 | 0.063 | 0.044 | 0.028 | 0.013 | 0.001 |
| 0.675749999999991 | 0.266 | 0.216 | 0.174 | 0.139 | 0.11 | 0.085 | 0.063 | 0.044 | 0.028 | 0.014 | 0.001 |
| 0.676499999999991 | 0.266 | 0.216 | 0.174 | 0.139 | 0.11 | 0.085 | 0.063 | 0.044 | 0.028 | 0.014 | 0.001 |
| 0.677249999999991 | 0.266 | 0.216 | 0.174 | 0.139 | 0.11 | 0.085 | 0.063 | 0.044 | 0.028 | 0.014 | 0.001 |
| 0.677999999999991 | 0.266 | 0.216 | 0.174 | 0.139 | 0.11 | 0.085 | 0.063 | 0.044 | 0.028 | 0.014 | 0.001 |
| 0.678749999999991 | 0.266 | 0.216 | 0.174 | 0.139 | 0.11 | 0.085 | 0.063 | 0.044 | 0.028 | 0.014 | 0.001 |
| 0.679499999999991 | 0.266 | 0.216 | 0.174 | 0.14 | 0.11 | 0.085 | 0.063 | 0.045 | 0.028 | 0.014 | 0.001 |
| 0.680249999999991 | 0.266 | 0.216 | 0.174 | 0.14 | 0.11 | 0.085 | 0.063 | 0.045 | 0.028 | 0.014 | 0.001 |
| 0.680999999999991 | 0.266 | 0.216 | 0.175 | 0.14 | 0.11 | 0.085 | 0.063 | 0.045 | 0.028 | 0.014 | 0.001 |
| 0.681749999999991 | 0.266 | 0.216 | 0.175 | 0.14 | 0.11 | 0.085 | 0.063 | 0.045 | 0.028 | 0.014 | 0.001 |
| 0.682499999999991 | 0.267 | 0.216 | 0.175 | 0.14 | 0.11 | 0.085 | 0.064 | 0.045 | 0.028 | 0.014 | 0.001 |
| 0.683249999999991 | 0.267 | 0.216 | 0.175 | 0.14 | 0.11 | 0.085 | 0.064 | 0.045 | 0.028 | 0.014 | 0.001 |
| 0.683999999999991 | 0.267 | 0.217 | 0.175 | 0.14 | 0.111 | 0.085 | 0.064 | 0.045 | 0.028 | 0.014 | 0.001 |
| 0.684749999999991 | 0.267 | 0.217 | 0.175 | 0.14 | 0.111 | 0.085 | 0.064 | 0.045 | 0.029 | 0.014 | 0.001 |
| 0.685499999999991 | 0.267 | 0.217 | 0.175 | 0.14 | 0.111 | 0.086 | 0.064 | 0.045 | 0.029 | 0.014 | 0.002 |
| 0.686249999999991 | 0.267 | 0.217 | 0.175 | 0.14 | 0.111 | 0.086 | 0.064 | 0.045 | 0.029 | 0.014 | 0.002 |
| 0.686999999999991 | 0.267 | 0.217 | 0.175 | 0.14 | 0.111 | 0.086 | 0.064 | 0.045 | 0.029 | 0.014 | 0.002 |
| 0.687749999999991 | 0.267 | 0.217 | 0.175 | 0.14 | 0.111 | 0.086 | 0.064 | 0.045 | 0.029 | 0.014 | 0.002 |
| 0.688499999999991 | 0.267 | 0.217 | 0.176 | 0.141 | 0.111 | 0.086 | 0.064 | 0.045 | 0.029 | 0.014 | 0.002 |
| 0.689249999999991 | 0.268 | 0.217 | 0.176 | 0.141 | 0.111 | 0.086 | 0.064 | 0.045 | 0.029 | 0.015 | 0.002 |
| 0.689999999999991 | 0.268 | 0.217 | 0.176 | 0.141 | 0.111 | 0.086 | 0.064 | 0.045 | 0.029 | 0.015 | 0.002 |
| 0.690749999999991 | 0.268 | 0.217 | 0.176 | 0.141 | 0.111 | 0.086 | 0.064 | 0.046 | 0.029 | 0.015 | 0.002 |
| 0.691499999999991 | 0.268 | 0.218 | 0.176 | 0.141 | 0.111 | 0.086 | 0.064 | 0.046 | 0.029 | 0.015 | 0.002 |
| 0.692249999999991 | 0.268 | 0.218 | 0.176 | 0.141 | 0.111 | 0.086 | 0.065 | 0.046 | 0.029 | 0.015 | 0.002 |
| 0.692999999999991 | 0.268 | 0.218 | 0.176 | 0.141 | 0.112 | 0.086 | 0.065 | 0.046 | 0.029 | 0.015 | 0.002 |
| 0.693749999999991 | 0.268 | 0.218 | 0.176 | 0.141 | 0.112 | 0.086 | 0.065 | 0.046 | 0.029 | 0.015 | 0.002 |
| 0.694499999999991 | 0.268 | 0.218 | 0.176 | 0.141 | 0.112 | 0.087 | 0.065 | 0.046 | 0.029 | 0.015 | 0.002 |
| 0.695249999999991 | 0.269 | 0.218 | 0.176 | 0.141 | 0.112 | 0.087 | 0.065 | 0.046 | 0.03 | 0.015 | 0.002 |
| 0.695999999999992 | 0.269 | 0.218 | 0.177 | 0.142 | 0.112 | 0.087 | 0.065 | 0.046 | 0.03 | 0.015 | 0.002 |
| 0.696749999999992 | 0.269 | 0.218 | 0.177 | 0.142 | 0.112 | 0.087 | 0.065 | 0.046 | 0.03 | 0.015 | 0.003 |
| 0.697499999999992 | 0.269 | 0.219 | 0.177 | 0.142 | 0.112 | 0.087 | 0.065 | 0.046 | 0.03 | 0.015 | 0.003 |
| 0.698249999999992 | 0.269 | 0.219 | 0.177 | 0.142 | 0.112 | 0.087 | 0.065 | 0.046 | 0.03 | 0.015 | 0.003 |
| 0.698999999999992 | 0.269 | 0.219 | 0.177 | 0.142 | 0.112 | 0.087 | 0.065 | 0.046 | 0.03 | 0.016 | 0.003 |
| 0.699749999999992 | 0.269 | 0.219 | 0.177 | 0.142 | 0.112 | 0.087 | 0.065 | 0.047 | 0.03 | 0.016 | 0.003 |
| 0.700499999999992 | 0.269 | 0.219 | 0.177 | 0.142 | 0.113 | 0.087 | 0.065 | 0.047 | 0.03 | 0.016 | 0.003 |
| 0.701249999999992 | 0.27 | 0.219 | 0.177 | 0.142 | 0.113 | 0.087 | 0.066 | 0.047 | 0.03 | 0.016 | 0.003 |
| 0.701999999999992 | 0.27 | 0.219 | 0.177 | 0.142 | 0.113 | 0.087 | 0.066 | 0.047 | 0.03 | 0.016 | 0.003 |
| 0.702749999999992 | 0.27 | 0.219 | 0.178 | 0.143 | 0.113 | 0.088 | 0.066 | 0.047 | 0.03 | 0.016 | 0.003 |
| 0.703499999999992 | 0.27 | 0.22 | 0.178 | 0.143 | 0.113 | 0.088 | 0.066 | 0.047 | 0.031 | 0.016 | 0.003 |
| 0.704249999999992 | 0.27 | 0.22 | 0.178 | 0.143 | 0.113 | 0.088 | 0.066 | 0.047 | 0.031 | 0.016 | 0.003 |
| 0.704999999999992 | 0.27 | 0.22 | 0.178 | 0.143 | 0.113 | 0.088 | 0.066 | 0.047 | 0.031 | 0.016 | 0.003 |
| 0.705749999999992 | 0.27 | 0.22 | 0.178 | 0.143 | 0.113 | 0.088 | 0.066 | 0.047 | 0.031 | 0.016 | 0.004 |
| 0.706499999999992 | 0.271 | 0.22 | 0.178 | 0.143 | 0.113 | 0.088 | 0.066 | 0.047 | 0.031 | 0.016 | 0.004 |
| 0.707249999999992 | 0.271 | 0.22 | 0.178 | 0.143 | 0.114 | 0.088 | 0.066 | 0.047 | 0.031 | 0.017 | 0.004 |
| 0.707999999999992 | 0.271 | 0.22 | 0.178 | 0.143 | 0.114 | 0.088 | 0.067 | 0.048 | 0.031 | 0.017 | 0.004 |
| 0.708749999999992 | 0.271 | 0.22 | 0.179 | 0.144 | 0.114 | 0.088 | 0.067 | 0.048 | 0.031 | 0.017 | 0.004 |
| 0.709499999999992 | 0.271 | 0.221 | 0.179 | 0.144 | 0.114 | 0.089 | 0.067 | 0.048 | 0.031 | 0.017 | 0.004 |
| 0.710249999999992 | 0.271 | 0.221 | 0.179 | 0.144 | 0.114 | 0.089 | 0.067 | 0.048 | 0.031 | 0.017 | 0.004 |
| 0.710999999999992 | 0.271 | 0.221 | 0.179 | 0.144 | 0.114 | 0.089 | 0.067 | 0.048 | 0.032 | 0.017 | 0.004 |
| 0.711749999999992 | 0.272 | 0.221 | 0.179 | 0.144 | 0.114 | 0.089 | 0.067 | 0.048 | 0.032 | 0.017 | 0.004 |
| 0.712499999999992 | 0.272 | 0.221 | 0.179 | 0.144 | 0.114 | 0.089 | 0.067 | 0.048 | 0.032 | 0.017 | 0.004 |
| 0.713249999999992 | 0.272 | 0.221 | 0.179 | 0.144 | 0.115 | 0.089 | 0.067 | 0.048 | 0.032 | 0.017 | 0.005 |
| 0.713999999999992 | 0.272 | 0.222 | 0.18 | 0.144 | 0.115 | 0.089 | 0.067 | 0.048 | 0.032 | 0.017 | 0.005 |
| 0.714749999999992 | 0.272 | 0.222 | 0.18 | 0.145 | 0.115 | 0.089 | 0.068 | 0.049 | 0.032 | 0.018 | 0.005 |
| 0.715499999999992 | 0.272 | 0.222 | 0.18 | 0.145 | 0.115 | 0.09 | 0.068 | 0.049 | 0.032 | 0.018 | 0.005 |
| 0.716249999999992 | 0.273 | 0.222 | 0.18 | 0.145 | 0.115 | 0.09 | 0.068 | 0.049 | 0.032 | 0.018 | 0.005 |
| 0.716999999999992 | 0.273 | 0.222 | 0.18 | 0.145 | 0.115 | 0.09 | 0.068 | 0.049 | 0.032 | 0.018 | 0.005 |
| 0.717749999999992 | 0.273 | 0.222 | 0.18 | 0.145 | 0.115 | 0.09 | 0.068 | 0.049 | 0.033 | 0.018 | 0.005 |
| 0.718499999999992 | 0.273 | 0.222 | 0.18 | 0.145 | 0.115 | 0.09 | 0.068 | 0.049 | 0.033 | 0.018 | 0.005 |
| 0.719249999999992 | 0.273 | 0.223 | 0.181 | 0.145 | 0.116 | 0.09 | 0.068 | 0.049 | 0.033 | 0.018 | 0.005 |
| 0.719999999999992 | 0.273 | 0.223 | 0.181 | 0.146 | 0.116 | 0.09 | 0.068 | 0.049 | 0.033 | 0.018 | 0.006 |
| 0.720749999999992 | 0.274 | 0.223 | 0.181 | 0.146 | 0.116 | 0.09 | 0.069 | 0.05 | 0.033 | 0.018 | 0.006 |
| 0.721499999999993 | 0.274 | 0.223 | 0.181 | 0.146 | 0.116 | 0.091 | 0.069 | 0.05 | 0.033 | 0.019 | 0.006 |
| 0.722249999999993 | 0.274 | 0.223 | 0.181 | 0.146 | 0.116 | 0.091 | 0.069 | 0.05 | 0.033 | 0.019 | 0.006 |
| 0.722999999999993 | 0.274 | 0.223 | 0.181 | 0.146 | 0.116 | 0.091 | 0.069 | 0.05 | 0.033 | 0.019 | 0.006 |
| 0.723749999999993 | 0.274 | 0.224 | 0.182 | 0.146 | 0.116 | 0.091 | 0.069 | 0.05 | 0.034 | 0.019 | 0.006 |
| 0.724499999999993 | 0.274 | 0.224 | 0.182 | 0.146 | 0.117 | 0.091 | 0.069 | 0.05 | 0.034 | 0.019 | 0.006 |
| 0.725249999999993 | 0.275 | 0.224 | 0.182 | 0.147 | 0.117 | 0.091 | 0.069 | 0.05 | 0.034 | 0.019 | 0.006 |
| 0.725999999999993 | 0.275 | 0.224 | 0.182 | 0.147 | 0.117 | 0.091 | 0.069 | 0.05 | 0.034 | 0.019 | 0.007 |
| 0.726749999999993 | 0.275 | 0.224 | 0.182 | 0.147 | 0.117 | 0.092 | 0.07 | 0.051 | 0.034 | 0.019 | 0.007 |
| 0.727499999999993 | 0.275 | 0.224 | 0.182 | 0.147 | 0.117 | 0.092 | 0.07 | 0.051 | 0.034 | 0.02 | 0.007 |
| 0.728249999999993 | 0.275 | 0.225 | 0.182 | 0.147 | 0.117 | 0.092 | 0.07 | 0.051 | 0.034 | 0.02 | 0.007 |
| 0.728999999999993 | 0.276 | 0.225 | 0.183 | 0.147 | 0.117 | 0.092 | 0.07 | 0.051 | 0.034 | 0.02 | 0.007 |
| 0.729749999999993 | 0.276 | 0.225 | 0.183 | 0.148 | 0.118 | 0.092 | 0.07 | 0.051 | 0.035 | 0.02 | 0.007 |
| 0.730499999999993 | 0.276 | 0.225 | 0.183 | 0.148 | 0.118 | 0.092 | 0.07 | 0.051 | 0.035 | 0.02 | 0.007 |
| 0.731249999999993 | 0.276 | 0.225 | 0.183 | 0.148 | 0.118 | 0.092 | 0.07 | 0.051 | 0.035 | 0.02 | 0.007 |
| 0.731999999999993 | 0.276 | 0.225 | 0.183 | 0.148 | 0.118 | 0.093 | 0.071 | 0.052 | 0.035 | 0.02 | 0.008 |
| 0.732749999999993 | 0.277 | 0.226 | 0.183 | 0.148 | 0.118 | 0.093 | 0.071 | 0.052 | 0.035 | 0.021 | 0.008 |
| 0.733499999999993 | 0.277 | 0.226 | 0.184 | 0.148 | 0.118 | 0.093 | 0.071 | 0.052 | 0.035 | 0.021 | 0.008 |
| 0.734249999999993 | 0.277 | 0.226 | 0.184 | 0.149 | 0.119 | 0.093 | 0.071 | 0.052 | 0.035 | 0.021 | 0.008 |
| 0.734999999999993 | 0.277 | 0.226 | 0.184 | 0.149 | 0.119 | 0.093 | 0.071 | 0.052 | 0.036 | 0.021 | 0.008 |
| 0.735749999999993 | 0.277 | 0.226 | 0.184 | 0.149 | 0.119 | 0.093 | 0.071 | 0.052 | 0.036 | 0.021 | 0.008 |
| 0.736499999999993 | 0.277 | 0.227 | 0.184 | 0.149 | 0.119 | 0.094 | 0.072 | 0.053 | 0.036 | 0.021 | 0.008 |
| 0.737249999999993 | 0.278 | 0.227 | 0.185 | 0.149 | 0.119 | 0.094 | 0.072 | 0.053 | 0.036 | 0.021 | 0.009 |
| 0.737999999999993 | 0.278 | 0.227 | 0.185 | 0.149 | 0.119 | 0.094 | 0.072 | 0.053 | 0.036 | 0.022 | 0.009 |
| 0.738749999999993 | 0.278 | 0.227 | 0.185 | 0.15 | 0.12 | 0.094 | 0.072 | 0.053 | 0.036 | 0.022 | 0.009 |
| 0.739499999999993 | 0.278 | 0.227 | 0.185 | 0.15 | 0.12 | 0.094 | 0.072 | 0.053 | 0.037 | 0.022 | 0.009 |
| 0.740249999999993 | 0.278 | 0.228 | 0.185 | 0.15 | 0.12 | 0.094 | 0.072 | 0.053 | 0.037 | 0.022 | 0.009 |
| 0.740999999999993 | 0.279 | 0.228 | 0.185 | 0.15 | 0.12 | 0.095 | 0.073 | 0.053 | 0.037 | 0.022 | 0.009 |
| 0.741749999999993 | 0.279 | 0.228 | 0.186 | 0.15 | 0.12 | 0.095 | 0.073 | 0.054 | 0.037 | 0.022 | 0.009 |
| 0.742499999999993 | 0.279 | 0.228 | 0.186 | 0.15 | 0.12 | 0.095 | 0.073 | 0.054 | 0.037 | 0.023 | 0.01 |
| 0.743249999999993 | 0.279 | 0.228 | 0.186 | 0.151 | 0.121 | 0.095 | 0.073 | 0.054 | 0.037 | 0.023 | 0.01 |
| 0.743999999999993 | 0.28 | 0.229 | 0.186 | 0.151 | 0.121 | 0.095 | 0.073 | 0.054 | 0.037 | 0.023 | 0.01 |
| 0.744749999999993 | 0.28 | 0.229 | 0.186 | 0.151 | 0.121 | 0.095 | 0.073 | 0.054 | 0.038 | 0.023 | 0.01 |
| 0.745499999999993 | 0.28 | 0.229 | 0.187 | 0.151 | 0.121 | 0.096 | 0.074 | 0.054 | 0.038 | 0.023 | 0.01 |
| 0.746249999999993 | 0.28 | 0.229 | 0.187 | 0.151 | 0.121 | 0.096 | 0.074 | 0.055 | 0.038 | 0.023 | 0.01 |
| 0.746999999999993 | 0.28 | 0.229 | 0.187 | 0.152 | 0.122 | 0.096 | 0.074 | 0.055 | 0.038 | 0.024 | 0.011 |
| 0.747749999999994 | 0.281 | 0.23 | 0.187 | 0.152 | 0.122 | 0.096 | 0.074 | 0.055 | 0.038 | 0.024 | 0.011 |
| 0.748499999999994 | 0.281 | 0.23 | 0.187 | 0.152 | 0.122 | 0.096 | 0.074 | 0.055 | 0.038 | 0.024 | 0.011 |
| 0.749249999999994 | 0.281 | 0.23 | 0.188 | 0.152 | 0.122 | 0.097 | 0.074 | 0.055 | 0.039 | 0.024 | 0.011 |
| 0.749999999999994 | 0.281 | 0.23 | 0.188 | 0.152 | 0.122 | 0.097 | 0.075 | 0.056 | 0.039 | 0.024 | 0.011 |
| 0.750749999999994 | 0.282 | 0.23 | 0.188 | 0.153 | 0.123 | 0.097 | 0.075 | 0.056 | 0.039 | 0.024 | 0.011 |
| 0.751499999999994 | 0.282 | 0.231 | 0.188 | 0.153 | 0.123 | 0.097 | 0.075 | 0.056 | 0.039 | 0.025 | 0.012 |
| 0.752249999999994 | 0.282 | 0.231 | 0.188 | 0.153 | 0.123 | 0.097 | 0.075 | 0.056 | 0.039 | 0.025 | 0.012 |
| 0.752999999999994 | 0.282 | 0.231 | 0.189 | 0.153 | 0.123 | 0.097 | 0.075 | 0.056 | 0.04 | 0.025 | 0.012 |
| 0.753749999999994 | 0.282 | 0.231 | 0.189 | 0.153 | 0.123 | 0.098 | 0.076 | 0.056 | 0.04 | 0.025 | 0.012 |
| 0.754499999999994 | 0.283 | 0.232 | 0.189 | 0.154 | 0.124 | 0.098 | 0.076 | 0.057 | 0.04 | 0.025 | 0.012 |
| 0.755249999999994 | 0.283 | 0.232 | 0.189 | 0.154 | 0.124 | 0.098 | 0.076 | 0.057 | 0.04 | 0.025 | 0.012 |
| 0.755999999999994 | 0.283 | 0.232 | 0.19 | 0.154 | 0.124 | 0.098 | 0.076 | 0.057 | 0.04 | 0.026 | 0.013 |
| 0.756749999999994 | 0.283 | 0.232 | 0.19 | 0.154 | 0.124 | 0.098 | 0.076 | 0.057 | 0.04 | 0.026 | 0.013 |
| 0.757499999999994 | 0.284 | 0.232 | 0.19 | 0.154 | 0.124 | 0.099 | 0.077 | 0.057 | 0.041 | 0.026 | 0.013 |
| 0.758249999999994 | 0.284 | 0.233 | 0.19 | 0.155 | 0.125 | 0.099 | 0.077 | 0.058 | 0.041 | 0.026 | 0.013 |
| 0.758999999999994 | 0.284 | 0.233 | 0.19 | 0.155 | 0.125 | 0.099 | 0.077 | 0.058 | 0.041 | 0.026 | 0.013 |
| 0.759749999999994 | 0.284 | 0.233 | 0.191 | 0.155 | 0.125 | 0.099 | 0.077 | 0.058 | 0.041 | 0.027 | 0.014 |
| 0.760499999999994 | 0.285 | 0.233 | 0.191 | 0.155 | 0.125 | 0.099 | 0.077 | 0.058 | 0.041 | 0.027 | 0.014 |
| 0.761249999999994 | 0.285 | 0.234 | 0.191 | 0.156 | 0.125 | 0.1 | 0.078 | 0.058 | 0.042 | 0.027 | 0.014 |
| 0.761999999999994 | 0.285 | 0.234 | 0.191 | 0.156 | 0.126 | 0.1 | 0.078 | 0.059 | 0.042 | 0.027 | 0.014 |
| 0.762749999999994 | 0.285 | 0.234 | 0.192 | 0.156 | 0.126 | 0.1 | 0.078 | 0.059 | 0.042 | 0.027 | 0.014 |
| 0.763499999999994 | 0.286 | 0.234 | 0.192 | 0.156 | 0.126 | 0.1 | 0.078 | 0.059 | 0.042 | 0.028 | 0.015 |
| 0.764249999999994 | 0.286 | 0.235 | 0.192 | 0.156 | 0.126 | 0.101 | 0.078 | 0.059 | 0.042 | 0.028 | 0.015 |
| 0.764999999999994 | 0.286 | 0.235 | 0.192 | 0.157 | 0.126 | 0.101 | 0.079 | 0.059 | 0.043 | 0.028 | 0.015 |
| 0.765749999999994 | 0.286 | 0.235 | 0.192 | 0.157 | 0.127 | 0.101 | 0.079 | 0.06 | 0.043 | 0.028 | 0.015 |
| 0.766499999999994 | 0.287 | 0.235 | 0.193 | 0.157 | 0.127 | 0.101 | 0.079 | 0.06 | 0.043 | 0.028 | 0.015 |
| 0.767249999999994 | 0.287 | 0.235 | 0.193 | 0.157 | 0.127 | 0.101 | 0.079 | 0.06 | 0.043 | 0.029 | 0.016 |
| 0.767999999999994 | 0.287 | 0.236 | 0.193 | 0.158 | 0.127 | 0.102 | 0.079 | 0.06 | 0.043 | 0.029 | 0.016 |
| 0.768749999999994 | 0.287 | 0.236 | 0.193 | 0.158 | 0.128 | 0.102 | 0.08 | 0.06 | 0.044 | 0.029 | 0.016 |
| 0.769499999999994 | 0.288 | 0.236 | 0.194 | 0.158 | 0.128 | 0.102 | 0.08 | 0.061 | 0.044 | 0.029 | 0.016 |
| 0.770249999999994 | 0.288 | 0.236 | 0.194 | 0.158 | 0.128 | 0.102 | 0.08 | 0.061 | 0.044 | 0.029 | 0.016 |
| 0.770999999999994 | 0.288 | 0.237 | 0.194 | 0.158 | 0.128 | 0.103 | 0.08 | 0.061 | 0.044 | 0.03 | 0.017 |
| 0.771749999999994 | 0.288 | 0.237 | 0.194 | 0.159 | 0.129 | 0.103 | 0.081 | 0.061 | 0.045 | 0.03 | 0.017 |
| 0.772499999999994 | 0.289 | 0.237 | 0.195 | 0.159 | 0.129 | 0.103 | 0.081 | 0.062 | 0.045 | 0.03 | 0.017 |
| 0.773249999999994 | 0.289 | 0.238 | 0.195 | 0.159 | 0.129 | 0.103 | 0.081 | 0.062 | 0.045 | 0.03 | 0.017 |
| 0.773999999999995 | 0.289 | 0.238 | 0.195 | 0.159 | 0.129 | 0.103 | 0.081 | 0.062 | 0.045 | 0.03 | 0.017 |
| 0.774749999999995 | 0.289 | 0.238 | 0.195 | 0.16 | 0.129 | 0.104 | 0.081 | 0.062 | 0.045 | 0.031 | 0.018 |
| 0.775499999999995 | 0.29 | 0.238 | 0.196 | 0.16 | 0.13 | 0.104 | 0.082 | 0.062 | 0.046 | 0.031 | 0.018 |
| 0.776249999999995 | 0.29 | 0.239 | 0.196 | 0.16 | 0.13 | 0.104 | 0.082 | 0.063 | 0.046 | 0.031 | 0.018 |
| 0.776999999999995 | 0.29 | 0.239 | 0.196 | 0.16 | 0.13 | 0.104 | 0.082 | 0.063 | 0.046 | 0.031 | 0.018 |
| 0.777749999999995 | 0.291 | 0.239 | 0.196 | 0.161 | 0.13 | 0.105 | 0.082 | 0.063 | 0.046 | 0.032 | 0.019 |
| 0.778499999999995 | 0.291 | 0.239 | 0.197 | 0.161 | 0.131 | 0.105 | 0.083 | 0.063 | 0.047 | 0.032 | 0.019 |
| 0.779249999999995 | 0.291 | 0.24 | 0.197 | 0.161 | 0.131 | 0.105 | 0.083 | 0.064 | 0.047 | 0.032 | 0.019 |
| 0.779999999999995 | 0.291 | 0.24 | 0.197 | 0.161 | 0.131 | 0.105 | 0.083 | 0.064 | 0.047 | 0.032 | 0.019 |
| 0.780749999999995 | 0.292 | 0.24 | 0.197 | 0.162 | 0.131 | 0.106 | 0.083 | 0.064 | 0.047 | 0.032 | 0.019 |
| 0.781499999999995 | 0.292 | 0.24 | 0.198 | 0.162 | 0.132 | 0.106 | 0.084 | 0.064 | 0.047 | 0.033 | 0.02 |
| 0.782249999999995 | 0.292 | 0.241 | 0.198 | 0.162 | 0.132 | 0.106 | 0.084 | 0.065 | 0.048 | 0.033 | 0.02 |
| 0.782999999999995 | 0.293 | 0.241 | 0.198 | 0.163 | 0.132 | 0.106 | 0.084 | 0.065 | 0.048 | 0.033 | 0.02 |
| 0.783749999999995 | 0.293 | 0.241 | 0.199 | 0.163 | 0.132 | 0.107 | 0.084 | 0.065 | 0.048 | 0.033 | 0.02 |
| 0.784499999999995 | 0.293 | 0.242 | 0.199 | 0.163 | 0.133 | 0.107 | 0.085 | 0.065 | 0.048 | 0.034 | 0.021 |
| 0.785249999999995 | 0.293 | 0.242 | 0.199 | 0.163 | 0.133 | 0.107 | 0.085 | 0.066 | 0.049 | 0.034 | 0.021 |
| 0.785999999999995 | 0.294 | 0.242 | 0.199 | 0.164 | 0.133 | 0.107 | 0.085 | 0.066 | 0.049 | 0.034 | 0.021 |
| 0.786749999999995 | 0.294 | 0.242 | 0.2 | 0.164 | 0.134 | 0.108 | 0.085 | 0.066 | 0.049 | 0.034 | 0.021 |
| 0.787499999999995 | 0.294 | 0.243 | 0.2 | 0.164 | 0.134 | 0.108 | 0.086 | 0.066 | 0.049 | 0.035 | 0.022 |
| 0.788249999999995 | 0.295 | 0.243 | 0.2 | 0.164 | 0.134 | 0.108 | 0.086 | 0.067 | 0.05 | 0.035 | 0.022 |
| 0.788999999999995 | 0.295 | 0.243 | 0.201 | 0.165 | 0.134 | 0.108 | 0.086 | 0.067 | 0.05 | 0.035 | 0.022 |
| 0.789749999999995 | 0.295 | 0.244 | 0.201 | 0.165 | 0.135 | 0.109 | 0.086 | 0.067 | 0.05 | 0.035 | 0.022 |
| 0.790499999999995 | 0.296 | 0.244 | 0.201 | 0.165 | 0.135 | 0.109 | 0.087 | 0.067 | 0.05 | 0.036 | 0.023 |
| 0.791249999999995 | 0.296 | 0.244 | 0.201 | 0.165 | 0.135 | 0.109 | 0.087 | 0.068 | 0.051 | 0.036 | 0.023 |
| 0.791999999999995 | 0.296 | 0.244 | 0.202 | 0.166 | 0.135 | 0.109 | 0.087 | 0.068 | 0.051 | 0.036 | 0.023 |
| 0.792749999999995 | 0.296 | 0.245 | 0.202 | 0.166 | 0.136 | 0.11 | 0.087 | 0.068 | 0.051 | 0.036 | 0.023 |
| 0.793499999999995 | 0.297 | 0.245 | 0.202 | 0.166 | 0.136 | 0.11 | 0.088 | 0.068 | 0.051 | 0.037 | 0.024 |
| 0.794249999999995 | 0.297 | 0.245 | 0.203 | 0.167 | 0.136 | 0.11 | 0.088 | 0.069 | 0.052 | 0.037 | 0.024 |
| 0.794999999999995 | 0.297 | 0.246 | 0.203 | 0.167 | 0.137 | 0.111 | 0.088 | 0.069 | 0.052 | 0.037 | 0.024 |
| 0.795749999999995 | 0.298 | 0.246 | 0.203 | 0.167 | 0.137 | 0.111 | 0.089 | 0.069 | 0.052 | 0.037 | 0.024 |
| 0.796499999999995 | 0.298 | 0.246 | 0.203 | 0.167 | 0.137 | 0.111 | 0.089 | 0.069 | 0.053 | 0.038 | 0.025 |
| 0.797249999999995 | 0.298 | 0.247 | 0.204 | 0.168 | 0.137 | 0.111 | 0.089 | 0.07 | 0.053 | 0.038 | 0.025 |
| 0.797999999999995 | 0.299 | 0.247 | 0.204 | 0.168 | 0.138 | 0.112 | 0.089 | 0.07 | 0.053 | 0.038 | 0.025 |
| 0.798749999999995 | 0.299 | 0.247 | 0.204 | 0.168 | 0.138 | 0.112 | 0.09 | 0.07 | 0.053 | 0.039 | 0.025 |
| 0.799499999999995 | 0.299 | 0.247 | 0.205 | 0.169 | 0.138 | 0.112 | 0.09 | 0.071 | 0.054 | 0.039 | 0.026 |
| 0.800249999999996 | 0.3 | 0.248 | 0.205 | 0.169 | 0.139 | 0.113 | 0.09 | 0.071 | 0.054 | 0.039 | 0.026 |
| 0.800999999999996 | 0.3 | 0.248 | 0.205 | 0.169 | 0.139 | 0.113 | 0.09 | 0.071 | 0.054 | 0.039 | 0.026 |
| 0.801749999999996 | 0.3 | 0.248 | 0.206 | 0.17 | 0.139 | 0.113 | 0.091 | 0.071 | 0.054 | 0.04 | 0.027 |
| 0.802499999999996 | 0.301 | 0.249 | 0.206 | 0.17 | 0.139 | 0.113 | 0.091 | 0.072 | 0.055 | 0.04 | 0.027 |
| 0.803249999999996 | 0.301 | 0.249 | 0.206 | 0.17 | 0.14 | 0.114 | 0.091 | 0.072 | 0.055 | 0.04 | 0.027 |
| 0.803999999999996 | 0.301 | 0.249 | 0.206 | 0.17 | 0.14 | 0.114 | 0.092 | 0.072 | 0.055 | 0.04 | 0.027 |
| 0.804749999999996 | 0.302 | 0.25 | 0.207 | 0.171 | 0.14 | 0.114 | 0.092 | 0.073 | 0.056 | 0.041 | 0.028 |
| 0.805499999999996 | 0.302 | 0.25 | 0.207 | 0.171 | 0.141 | 0.115 | 0.092 | 0.073 | 0.056 | 0.041 | 0.028 |
| 0.806249999999996 | 0.302 | 0.25 | 0.207 | 0.171 | 0.141 | 0.115 | 0.093 | 0.073 | 0.056 | 0.041 | 0.028 |
| 0.806999999999996 | 0.303 | 0.251 | 0.208 | 0.172 | 0.141 | 0.115 | 0.093 | 0.073 | 0.056 | 0.042 | 0.028 |
| 0.807749999999996 | 0.303 | 0.251 | 0.208 | 0.172 | 0.142 | 0.116 | 0.093 | 0.074 | 0.057 | 0.042 | 0.029 |
| 0.808499999999996 | 0.303 | 0.251 | 0.208 | 0.172 | 0.142 | 0.116 | 0.093 | 0.074 | 0.057 | 0.042 | 0.029 |
| 0.809249999999996 | 0.304 | 0.252 | 0.209 | 0.173 | 0.142 | 0.116 | 0.094 | 0.074 | 0.057 | 0.042 | 0.029 |
| 0.809999999999996 | 0.304 | 0.252 | 0.209 | 0.173 | 0.142 | 0.116 | 0.094 | 0.075 | 0.058 | 0.043 | 0.03 |
| 0.810749999999996 | 0.304 | 0.252 | 0.209 | 0.173 | 0.143 | 0.117 | 0.094 | 0.075 | 0.058 | 0.043 | 0.03 |
| 0.811499999999996 | 0.305 | 0.253 | 0.21 | 0.174 | 0.143 | 0.117 | 0.095 | 0.075 | 0.058 | 0.043 | 0.03 |
| 0.812249999999996 | 0.305 | 0.253 | 0.21 | 0.174 | 0.143 | 0.117 | 0.095 | 0.075 | 0.059 | 0.044 | 0.031 |
| 0.812999999999996 | 0.305 | 0.253 | 0.21 | 0.174 | 0.144 | 0.118 | 0.095 | 0.076 | 0.059 | 0.044 | 0.031 |
| 0.813749999999996 | 0.306 | 0.254 | 0.211 | 0.175 | 0.144 | 0.118 | 0.096 | 0.076 | 0.059 | 0.044 | 0.031 |
| 0.814499999999996 | 0.306 | 0.254 | 0.211 | 0.175 | 0.144 | 0.118 | 0.096 | 0.076 | 0.059 | 0.045 | 0.031 |
| 0.815249999999996 | 0.306 | 0.254 | 0.211 | 0.175 | 0.145 | 0.119 | 0.096 | 0.077 | 0.06 | 0.045 | 0.032 |
| 0.815999999999996 | 0.307 | 0.255 | 0.212 | 0.176 | 0.145 | 0.119 | 0.096 | 0.077 | 0.06 | 0.045 | 0.032 |
| 0.816749999999996 | 0.307 | 0.255 | 0.212 | 0.176 | 0.145 | 0.119 | 0.097 | 0.077 | 0.06 | 0.045 | 0.032 |
| 0.817499999999996 | 0.307 | 0.255 | 0.212 | 0.176 | 0.146 | 0.12 | 0.097 | 0.078 | 0.061 | 0.046 | 0.033 |
| 0.818249999999996 | 0.308 | 0.256 | 0.213 | 0.177 | 0.146 | 0.12 | 0.097 | 0.078 | 0.061 | 0.046 | 0.033 |
| 0.818999999999996 | 0.308 | 0.256 | 0.213 | 0.177 | 0.146 | 0.12 | 0.098 | 0.078 | 0.061 | 0.046 | 0.033 |
| 0.819749999999996 | 0.309 | 0.257 | 0.213 | 0.177 | 0.147 | 0.121 | 0.098 | 0.079 | 0.062 | 0.047 | 0.034 |
| 0.820499999999996 | 0.309 | 0.257 | 0.214 | 0.178 | 0.147 | 0.121 | 0.098 | 0.079 | 0.062 | 0.047 | 0.034 |
| 0.821249999999996 | 0.309 | 0.257 | 0.214 | 0.178 | 0.147 | 0.121 | 0.099 | 0.079 | 0.062 | 0.047 | 0.034 |
| 0.821999999999996 | 0.31 | 0.258 | 0.214 | 0.178 | 0.148 | 0.122 | 0.099 | 0.08 | 0.063 | 0.048 | 0.034 |
| 0.822749999999996 | 0.31 | 0.258 | 0.215 | 0.179 | 0.148 | 0.122 | 0.099 | 0.08 | 0.063 | 0.048 | 0.035 |
| 0.823499999999996 | 0.31 | 0.258 | 0.215 | 0.179 | 0.148 | 0.122 | 0.1 | 0.08 | 0.063 | 0.048 | 0.035 |
| 0.824249999999996 | 0.311 | 0.259 | 0.216 | 0.179 | 0.149 | 0.123 | 0.1 | 0.081 | 0.064 | 0.049 | 0.035 |
| 0.824999999999996 | 0.311 | 0.259 | 0.216 | 0.18 | 0.149 | 0.123 | 0.1 | 0.081 | 0.064 | 0.049 | 0.036 |
| 0.825749999999996 | 0.312 | 0.259 | 0.216 | 0.18 | 0.149 | 0.123 | 0.101 | 0.081 | 0.064 | 0.049 | 0.036 |
| 0.826499999999997 | 0.312 | 0.26 | 0.217 | 0.18 | 0.15 | 0.124 | 0.101 | 0.082 | 0.065 | 0.05 | 0.036 |
| 0.827249999999997 | 0.312 | 0.26 | 0.217 | 0.181 | 0.15 | 0.124 | 0.101 | 0.082 | 0.065 | 0.05 | 0.037 |
| 0.827999999999997 | 0.313 | 0.261 | 0.217 | 0.181 | 0.15 | 0.124 | 0.102 | 0.082 | 0.065 | 0.05 | 0.037 |
| 0.828749999999997 | 0.313 | 0.261 | 0.218 | 0.181 | 0.151 | 0.125 | 0.102 | 0.083 | 0.066 | 0.051 | 0.037 |
| 0.829499999999997 | 0.313 | 0.261 | 0.218 | 0.182 | 0.151 | 0.125 | 0.102 | 0.083 | 0.066 | 0.051 | 0.038 |
| 0.830249999999997 | 0.314 | 0.262 | 0.218 | 0.182 | 0.152 | 0.125 | 0.103 | 0.083 | 0.066 | 0.051 | 0.038 |
| 0.830999999999997 | 0.314 | 0.262 | 0.219 | 0.183 | 0.152 | 0.126 | 0.103 | 0.084 | 0.067 | 0.052 | 0.038 |
| 0.831749999999997 | 0.315 | 0.262 | 0.219 | 0.183 | 0.152 | 0.126 | 0.104 | 0.084 | 0.067 | 0.052 | 0.039 |
| 0.832499999999997 | 0.315 | 0.263 | 0.22 | 0.183 | 0.153 | 0.126 | 0.104 | 0.084 | 0.067 | 0.052 | 0.039 |
| 0.833249999999997 | 0.315 | 0.263 | 0.22 | 0.184 | 0.153 | 0.127 | 0.104 | 0.085 | 0.068 | 0.053 | 0.039 |
| 0.833999999999997 | 0.316 | 0.264 | 0.22 | 0.184 | 0.153 | 0.127 | 0.105 | 0.085 | 0.068 | 0.053 | 0.04 |
| 0.834749999999997 | 0.316 | 0.264 | 0.221 | 0.184 | 0.154 | 0.127 | 0.105 | 0.085 | 0.068 | 0.053 | 0.04 |
| 0.835499999999997 | 0.317 | 0.264 | 0.221 | 0.185 | 0.154 | 0.128 | 0.105 | 0.086 | 0.069 | 0.054 | 0.04 |
| 0.836249999999997 | 0.317 | 0.265 | 0.221 | 0.185 | 0.154 | 0.128 | 0.106 | 0.086 | 0.069 | 0.054 | 0.041 |
| 0.836999999999997 | 0.317 | 0.265 | 0.222 | 0.186 | 0.155 | 0.129 | 0.106 | 0.086 | 0.069 | 0.054 | 0.041 |
| 0.837749999999997 | 0.318 | 0.266 | 0.222 | 0.186 | 0.155 | 0.129 | 0.106 | 0.087 | 0.07 | 0.055 | 0.042 |
| 0.838499999999997 | 0.318 | 0.266 | 0.223 | 0.186 | 0.156 | 0.129 | 0.107 | 0.087 | 0.07 | 0.055 | 0.042 |
| 0.839249999999997 | 0.319 | 0.266 | 0.223 | 0.187 | 0.156 | 0.13 | 0.107 | 0.088 | 0.07 | 0.055 | 0.042 |
| 0.839999999999997 | 0.319 | 0.267 | 0.223 | 0.187 | 0.156 | 0.13 | 0.107 | 0.088 | 0.071 | 0.056 | 0.043 |
| 0.840749999999997 | 0.319 | 0.267 | 0.224 | 0.187 | 0.157 | 0.13 | 0.108 | 0.088 | 0.071 | 0.056 | 0.043 |
| 0.841499999999997 | 0.32 | 0.268 | 0.224 | 0.188 | 0.157 | 0.131 | 0.108 | 0.089 | 0.072 | 0.057 | 0.043 |
| 0.842249999999997 | 0.32 | 0.268 | 0.225 | 0.188 | 0.157 | 0.131 | 0.109 | 0.089 | 0.072 | 0.057 | 0.044 |
| 0.842999999999997 | 0.321 | 0.268 | 0.225 | 0.189 | 0.158 | 0.132 | 0.109 | 0.089 | 0.072 | 0.057 | 0.044 |
| 0.843749999999997 | 0.321 | 0.269 | 0.225 | 0.189 | 0.158 | 0.132 | 0.109 | 0.09 | 0.073 | 0.058 | 0.044 |
| 0.844499999999997 | 0.322 | 0.269 | 0.226 | 0.189 | 0.159 | 0.132 | 0.11 | 0.09 | 0.073 | 0.058 | 0.045 |
| 0.845249999999997 | 0.322 | 0.27 | 0.226 | 0.19 | 0.159 | 0.133 | 0.11 | 0.09 | 0.073 | 0.058 | 0.045 |
| 0.845999999999997 | 0.322 | 0.27 | 0.227 | 0.19 | 0.159 | 0.133 | 0.11 | 0.091 | 0.074 | 0.059 | 0.046 |
| 0.846749999999997 | 0.323 | 0.27 | 0.227 | 0.191 | 0.16 | 0.133 | 0.111 | 0.091 | 0.074 | 0.059 | 0.046 |
| 0.847499999999997 | 0.323 | 0.271 | 0.227 | 0.191 | 0.16 | 0.134 | 0.111 | 0.092 | 0.075 | 0.06 | 0.046 |
| 0.848249999999997 | 0.324 | 0.271 | 0.228 | 0.191 | 0.161 | 0.134 | 0.112 | 0.092 | 0.075 | 0.06 | 0.047 |
| 0.848999999999997 | 0.324 | 0.272 | 0.228 | 0.192 | 0.161 | 0.135 | 0.112 | 0.092 | 0.075 | 0.06 | 0.047 |
| 0.849749999999997 | 0.325 | 0.272 | 0.229 | 0.192 | 0.161 | 0.135 | 0.112 | 0.093 | 0.076 | 0.061 | 0.047 |
| 0.850499999999997 | 0.325 | 0.272 | 0.229 | 0.193 | 0.162 | 0.135 | 0.113 | 0.093 | 0.076 | 0.061 | 0.048 |
| 0.851249999999997 | 0.325 | 0.273 | 0.229 | 0.193 | 0.162 | 0.136 | 0.113 | 0.094 | 0.076 | 0.061 | 0.048 |
| 0.851999999999997 | 0.326 | 0.273 | 0.23 | 0.193 | 0.163 | 0.136 | 0.114 | 0.094 | 0.077 | 0.062 | 0.049 |
| 0.852749999999998 | 0.326 | 0.274 | 0.23 | 0.194 | 0.163 | 0.137 | 0.114 | 0.094 | 0.077 | 0.062 | 0.049 |
| 0.853499999999998 | 0.327 | 0.274 | 0.231 | 0.194 | 0.163 | 0.137 | 0.114 | 0.095 | 0.078 | 0.063 | 0.049 |
| 0.854249999999998 | 0.327 | 0.275 | 0.231 | 0.195 | 0.164 | 0.137 | 0.115 | 0.095 | 0.078 | 0.063 | 0.05 |
| 0.854999999999998 | 0.328 | 0.275 | 0.232 | 0.195 | 0.164 | 0.138 | 0.115 | 0.096 | 0.078 | 0.063 | 0.05 |
| 0.855749999999998 | 0.328 | 0.276 | 0.232 | 0.196 | 0.165 | 0.138 | 0.116 | 0.096 | 0.079 | 0.064 | 0.05 |
| 0.856499999999998 | 0.328 | 0.276 | 0.232 | 0.196 | 0.165 | 0.139 | 0.116 | 0.096 | 0.079 | 0.064 | 0.051 |
| 0.857249999999998 | 0.329 | 0.276 | 0.233 | 0.196 | 0.165 | 0.139 | 0.116 | 0.097 | 0.08 | 0.065 | 0.051 |
| 0.857999999999998 | 0.329 | 0.277 | 0.233 | 0.197 | 0.166 | 0.14 | 0.117 | 0.097 | 0.08 | 0.065 | 0.052 |
| 0.858749999999998 | 0.33 | 0.277 | 0.234 | 0.197 | 0.166 | 0.14 | 0.117 | 0.098 | 0.08 | 0.065 | 0.052 |
| 0.859499999999998 | 0.33 | 0.278 | 0.234 | 0.198 | 0.167 | 0.14 | 0.118 | 0.098 | 0.081 | 0.066 | 0.052 |
| 0.860249999999998 | 0.331 | 0.278 | 0.235 | 0.198 | 0.167 | 0.141 | 0.118 | 0.098 | 0.081 | 0.066 | 0.053 |
| 0.860999999999998 | 0.331 | 0.279 | 0.235 | 0.199 | 0.168 | 0.141 | 0.119 | 0.099 | 0.082 | 0.067 | 0.053 |
| 0.861749999999998 | 0.332 | 0.279 | 0.235 | 0.199 | 0.168 | 0.142 | 0.119 | 0.099 | 0.082 | 0.067 | 0.054 |
| 0.862499999999998 | 0.332 | 0.28 | 0.236 | 0.199 | 0.168 | 0.142 | 0.119 | 0.1 | 0.082 | 0.067 | 0.054 |
| 0.863249999999998 | 0.333 | 0.28 | 0.236 | 0.2 | 0.169 | 0.142 | 0.12 | 0.1 | 0.083 | 0.068 | 0.055 |
| 0.863999999999998 | 0.333 | 0.28 | 0.237 | 0.2 | 0.169 | 0.143 | 0.12 | 0.101 | 0.083 | 0.068 | 0.055 |
| 0.864749999999998 | 0.334 | 0.281 | 0.237 | 0.201 | 0.17 | 0.143 | 0.121 | 0.101 | 0.084 | 0.069 | 0.055 |
| 0.865499999999998 | 0.334 | 0.281 | 0.238 | 0.201 | 0.17 | 0.144 | 0.121 | 0.101 | 0.084 | 0.069 | 0.056 |
| 0.866249999999998 | 0.334 | 0.282 | 0.238 | 0.202 | 0.171 | 0.144 | 0.121 | 0.102 | 0.085 | 0.069 | 0.056 |
| 0.866999999999998 | 0.335 | 0.282 | 0.239 | 0.202 | 0.171 | 0.145 | 0.122 | 0.102 | 0.085 | 0.07 | 0.057 |
| 0.867749999999998 | 0.335 | 0.283 | 0.239 | 0.203 | 0.172 | 0.145 | 0.122 | 0.103 | 0.085 | 0.07 | 0.057 |
| 0.868499999999998 | 0.336 | 0.283 | 0.24 | 0.203 | 0.172 | 0.146 | 0.123 | 0.103 | 0.086 | 0.071 | 0.057 |
| 0.869249999999998 | 0.336 | 0.284 | 0.24 | 0.203 | 0.172 | 0.146 | 0.123 | 0.104 | 0.086 | 0.071 | 0.058 |
| 0.869999999999998 | 0.337 | 0.284 | 0.24 | 0.204 | 0.173 | 0.146 | 0.124 | 0.104 | 0.087 | 0.072 | 0.058 |
| 0.870749999999998 | 0.337 | 0.285 | 0.241 | 0.204 | 0.173 | 0.147 | 0.124 | 0.104 | 0.087 | 0.072 | 0.059 |
| 0.871499999999998 | 0.338 | 0.285 | 0.241 | 0.205 | 0.174 | 0.147 | 0.125 | 0.105 | 0.088 | 0.072 | 0.059 |
| 0.872249999999998 | 0.338 | 0.286 | 0.242 | 0.205 | 0.174 | 0.148 | 0.125 | 0.105 | 0.088 | 0.073 | 0.06 |
| 0.872999999999998 | 0.339 | 0.286 | 0.242 | 0.206 | 0.175 | 0.148 | 0.125 | 0.106 | 0.088 | 0.073 | 0.06 |
| 0.873749999999998 | 0.339 | 0.287 | 0.243 | 0.206 | 0.175 | 0.149 | 0.126 | 0.106 | 0.089 | 0.074 | 0.06 |
| 0.874499999999998 | 0.34 | 0.287 | 0.243 | 0.207 | 0.176 | 0.149 | 0.126 | 0.107 | 0.089 | 0.074 | 0.061 |
| 0.875249999999998 | 0.34 | 0.287 | 0.244 | 0.207 | 0.176 | 0.15 | 0.127 | 0.107 | 0.09 | 0.075 | 0.061 |
| 0.875999999999998 | 0.341 | 0.288 | 0.244 | 0.208 | 0.177 | 0.15 | 0.127 | 0.107 | 0.09 | 0.075 | 0.062 |
| 0.876749999999998 | 0.341 | 0.288 | 0.245 | 0.208 | 0.177 | 0.151 | 0.128 | 0.108 | 0.091 | 0.076 | 0.062 |
| 0.877499999999998 | 0.342 | 0.289 | 0.245 | 0.209 | 0.177 | 0.151 | 0.128 | 0.108 | 0.091 | 0.076 | 0.063 |
| 0.878249999999998 | 0.342 | 0.289 | 0.246 | 0.209 | 0.178 | 0.151 | 0.129 | 0.109 | 0.092 | 0.076 | 0.063 |
| 0.878999999999999 | 0.343 | 0.29 | 0.246 | 0.209 | 0.178 | 0.152 | 0.129 | 0.109 | 0.092 | 0.077 | 0.064 |
| 0.879749999999999 | 0.343 | 0.29 | 0.247 | 0.21 | 0.179 | 0.152 | 0.13 | 0.11 | 0.093 | 0.077 | 0.064 |
| 0.880499999999999 | 0.344 | 0.291 | 0.247 | 0.21 | 0.179 | 0.153 | 0.13 | 0.11 | 0.093 | 0.078 | 0.064 |
| 0.881249999999999 | 0.344 | 0.291 | 0.248 | 0.211 | 0.18 | 0.153 | 0.13 | 0.111 | 0.093 | 0.078 | 0.065 |
| 0.881999999999999 | 0.345 | 0.292 | 0.248 | 0.211 | 0.18 | 0.154 | 0.131 | 0.111 | 0.094 | 0.079 | 0.065 |
| 0.882749999999999 | 0.345 | 0.292 | 0.249 | 0.212 | 0.181 | 0.154 | 0.131 | 0.112 | 0.094 | 0.079 | 0.066 |
| 0.883499999999999 | 0.346 | 0.293 | 0.249 | 0.212 | 0.181 | 0.155 | 0.132 | 0.112 | 0.095 | 0.08 | 0.066 |
| 0.884249999999999 | 0.346 | 0.293 | 0.25 | 0.213 | 0.182 | 0.155 | 0.132 | 0.113 | 0.095 | 0.08 | 0.067 |
| 0.884999999999999 | 0.347 | 0.294 | 0.25 | 0.213 | 0.182 | 0.156 | 0.133 | 0.113 | 0.096 | 0.081 | 0.067 |
| 0.885749999999999 | 0.347 | 0.294 | 0.251 | 0.214 | 0.183 | 0.156 | 0.133 | 0.114 | 0.096 | 0.081 | 0.068 |
| 0.886499999999999 | 0.348 | 0.295 | 0.251 | 0.214 | 0.183 | 0.157 | 0.134 | 0.114 | 0.097 | 0.082 | 0.068 |
| 0.887249999999999 | 0.348 | 0.295 | 0.252 | 0.215 | 0.184 | 0.157 | 0.134 | 0.114 | 0.097 | 0.082 | 0.069 |
| 0.887999999999999 | 0.349 | 0.296 | 0.252 | 0.215 | 0.184 | 0.158 | 0.135 | 0.115 | 0.098 | 0.082 | 0.069 |
| 0.888749999999999 | 0.349 | 0.297 | 0.253 | 0.216 | 0.185 | 0.158 | 0.135 | 0.115 | 0.098 | 0.083 | 0.07 |
| 0.889499999999999 | 0.35 | 0.297 | 0.253 | 0.216 | 0.185 | 0.159 | 0.136 | 0.116 | 0.099 | 0.083 | 0.07 |
| 0.890249999999999 | 0.351 | 0.298 | 0.254 | 0.217 | 0.186 | 0.159 | 0.136 | 0.116 | 0.099 | 0.084 | 0.071 |
| 0.890999999999999 | 0.351 | 0.298 | 0.254 | 0.217 | 0.186 | 0.16 | 0.137 | 0.117 | 0.1 | 0.084 | 0.071 |
| 0.891749999999999 | 0.352 | 0.299 | 0.255 | 0.218 | 0.187 | 0.16 | 0.137 | 0.117 | 0.1 | 0.085 | 0.071 |
| 0.892499999999999 | 0.352 | 0.299 | 0.255 | 0.218 | 0.187 | 0.161 | 0.138 | 0.118 | 0.101 | 0.085 | 0.072 |
| 0.893249999999999 | 0.353 | 0.3 | 0.256 | 0.219 | 0.188 | 0.161 | 0.138 | 0.118 | 0.101 | 0.086 | 0.072 |
| 0.893999999999999 | 0.353 | 0.3 | 0.256 | 0.219 | 0.188 | 0.162 | 0.139 | 0.119 | 0.102 | 0.086 | 0.073 |
| 0.894749999999999 | 0.354 | 0.301 | 0.257 | 0.22 | 0.189 | 0.162 | 0.139 | 0.119 | 0.102 | 0.087 | 0.073 |
| 0.895499999999999 | 0.354 | 0.301 | 0.257 | 0.22 | 0.189 | 0.163 | 0.14 | 0.12 | 0.103 | 0.087 | 0.074 |
| 0.896249999999999 | 0.355 | 0.302 | 0.258 | 0.221 | 0.19 | 0.163 | 0.14 | 0.12 | 0.103 | 0.088 | 0.074 |
| 0.896999999999999 | 0.355 | 0.302 | 0.258 | 0.221 | 0.19 | 0.164 | 0.141 | 0.121 | 0.104 | 0.088 | 0.075 |
| 0.897749999999999 | 0.356 | 0.303 | 0.259 | 0.222 | 0.191 | 0.164 | 0.141 | 0.121 | 0.104 | 0.089 | 0.075 |
| 0.898499999999999 | 0.356 | 0.303 | 0.259 | 0.223 | 0.191 | 0.165 | 0.142 | 0.122 | 0.105 | 0.089 | 0.076 |
| 0.899249999999999 | 0.357 | 0.304 | 0.26 | 0.223 | 0.192 | 0.165 | 0.142 | 0.122 | 0.105 | 0.09 | 0.076 |
| 0.899999999999999 | 0.358 | 0.304 | 0.26 | 0.224 | 0.192 | 0.166 | 0.143 | 0.123 | 0.106 | 0.09 | 0.077 |
| 0.900749999999999 | 0.358 | 0.305 | 0.261 | 0.224 | 0.193 | 0.166 | 0.143 | 0.123 | 0.106 | 0.091 | 0.077 |
| 0.901499999999999 | 0.359 | 0.306 | 0.262 | 0.225 | 0.193 | 0.167 | 0.144 | 0.124 | 0.107 | 0.091 | 0.078 |
| 0.902249999999999 | 0.359 | 0.306 | 0.262 | 0.225 | 0.194 | 0.167 | 0.144 | 0.124 | 0.107 | 0.092 | 0.078 |
| 0.902999999999999 | 0.36 | 0.307 | 0.263 | 0.226 | 0.194 | 0.168 | 0.145 | 0.125 | 0.108 | 0.092 | 0.079 |
| 0.903749999999999 | 0.36 | 0.307 | 0.263 | 0.226 | 0.195 | 0.168 | 0.145 | 0.125 | 0.108 | 0.093 | 0.079 |
| 0.9045 | 0.361 | 0.308 | 0.264 | 0.227 | 0.196 | 0.169 | 0.146 | 0.126 | 0.109 | 0.093 | 0.08 |
| 0.90525 | 0.362 | 0.308 | 0.264 | 0.227 | 0.196 | 0.169 | 0.146 | 0.127 | 0.109 | 0.094 | 0.08 |
| 0.906 | 0.362 | 0.309 | 0.265 | 0.228 | 0.197 | 0.17 | 0.147 | 0.127 | 0.11 | 0.094 | 0.081 |
| 0.90675 | 0.363 | 0.309 | 0.265 | 0.228 | 0.197 | 0.17 | 0.147 | 0.128 | 0.11 | 0.095 | 0.081 |
| 0.9075 | 0.363 | 0.31 | 0.266 | 0.229 | 0.198 | 0.171 | 0.148 | 0.128 | 0.111 | 0.095 | 0.082 |
| 0.90825 | 0.364 | 0.311 | 0.266 | 0.23 | 0.198 | 0.172 | 0.149 | 0.129 | 0.111 | 0.096 | 0.083 |
| 0.909 | 0.364 | 0.311 | 0.267 | 0.23 | 0.199 | 0.172 | 0.149 | 0.129 | 0.112 | 0.097 | 0.083 |
| 0.90975 | 0.365 | 0.312 | 0.268 | 0.231 | 0.199 | 0.173 | 0.15 | 0.13 | 0.112 | 0.097 | 0.084 |
| 0.9105 | 0.366 | 0.312 | 0.268 | 0.231 | 0.2 | 0.173 | 0.15 | 0.13 | 0.113 | 0.098 | 0.084 |
| 0.91125 | 0.366 | 0.313 | 0.269 | 0.232 | 0.2 | 0.174 | 0.151 | 0.131 | 0.113 | 0.098 | 0.085 |
| 0.912 | 0.367 | 0.313 | 0.269 | 0.232 | 0.201 | 0.174 | 0.151 | 0.131 | 0.114 | 0.099 | 0.085 |
| 0.91275 | 0.367 | 0.314 | 0.27 | 0.233 | 0.202 | 0.175 | 0.152 | 0.132 | 0.114 | 0.099 | 0.086 |
| 0.9135 | 0.368 | 0.315 | 0.27 | 0.233 | 0.202 | 0.175 | 0.152 | 0.132 | 0.115 | 0.1 | 0.086 |
| 0.91425 | 0.368 | 0.315 | 0.271 | 0.234 | 0.203 | 0.176 | 0.153 | 0.133 | 0.116 | 0.1 | 0.087 |
| 0.915 | 0.369 | 0.316 | 0.272 | 0.235 | 0.203 | 0.176 | 0.153 | 0.133 | 0.116 | 0.101 | 0.087 |
| 0.91575 | 0.37 | 0.316 | 0.272 | 0.235 | 0.204 | 0.177 | 0.154 | 0.134 | 0.117 | 0.101 | 0.088 |
| 0.9165 | 0.37 | 0.317 | 0.273 | 0.236 | 0.204 | 0.178 | 0.155 | 0.135 | 0.117 | 0.102 | 0.088 |
| 0.91725 | 0.371 | 0.318 | 0.273 | 0.236 | 0.205 | 0.178 | 0.155 | 0.135 | 0.118 | 0.102 | 0.089 |
| 0.918 | 0.371 | 0.318 | 0.274 | 0.237 | 0.205 | 0.179 | 0.156 | 0.136 | 0.118 | 0.103 | 0.09 |
| 0.91875 | 0.372 | 0.319 | 0.274 | 0.237 | 0.206 | 0.179 | 0.156 | 0.136 | 0.119 | 0.104 | 0.09 |
| 0.9195 | 0.373 | 0.319 | 0.275 | 0.238 | 0.207 | 0.18 | 0.157 | 0.137 | 0.119 | 0.104 | 0.091 |
| 0.92025 | 0.373 | 0.32 | 0.276 | 0.239 | 0.207 | 0.18 | 0.157 | 0.137 | 0.12 | 0.105 | 0.091 |
| 0.921 | 0.374 | 0.321 | 0.276 | 0.239 | 0.208 | 0.181 | 0.158 | 0.138 | 0.121 | 0.105 | 0.092 |
| 0.92175 | 0.375 | 0.321 | 0.277 | 0.24 | 0.208 | 0.182 | 0.159 | 0.139 | 0.121 | 0.106 | 0.092 |
| 0.9225 | 0.375 | 0.322 | 0.277 | 0.24 | 0.209 | 0.182 | 0.159 | 0.139 | 0.122 | 0.106 | 0.093 |
| 0.92325 | 0.376 | 0.322 | 0.278 | 0.241 | 0.21 | 0.183 | 0.16 | 0.14 | 0.122 | 0.107 | 0.093 |
| 0.924 | 0.376 | 0.323 | 0.279 | 0.242 | 0.21 | 0.183 | 0.16 | 0.14 | 0.123 | 0.107 | 0.094 |
| 0.92475 | 0.377 | 0.324 | 0.279 | 0.242 | 0.211 | 0.184 | 0.161 | 0.141 | 0.123 | 0.108 | 0.095 |
| 0.9255 | 0.378 | 0.324 | 0.28 | 0.243 | 0.211 | 0.184 | 0.161 | 0.141 | 0.124 | 0.109 | 0.095 |
| 0.92625 | 0.378 | 0.325 | 0.28 | 0.243 | 0.212 | 0.185 | 0.162 | 0.142 | 0.125 | 0.109 | 0.096 |
| 0.927 | 0.379 | 0.325 | 0.281 | 0.244 | 0.212 | 0.186 | 0.163 | 0.143 | 0.125 | 0.11 | 0.096 |
| 0.92775 | 0.379 | 0.326 | 0.282 | 0.245 | 0.213 | 0.186 | 0.163 | 0.143 | 0.126 | 0.11 | 0.097 |
| 0.9285 | 0.38 | 0.327 | 0.282 | 0.245 | 0.214 | 0.187 | 0.164 | 0.144 | 0.126 | 0.111 | 0.097 |
| 0.92925 | 0.381 | 0.327 | 0.283 | 0.246 | 0.214 | 0.187 | 0.164 | 0.144 | 0.127 | 0.111 | 0.098 |
| 0.93 | 0.381 | 0.328 | 0.284 | 0.246 | 0.215 | 0.188 | 0.165 | 0.145 | 0.127 | 0.112 | 0.099 |
| 0.93075 | 0.382 | 0.328 | 0.284 | 0.247 | 0.215 | 0.189 | 0.166 | 0.145 | 0.128 | 0.113 | 0.099 |
| 0.931500000000001 | 0.383 | 0.329 | 0.285 | 0.248 | 0.216 | 0.189 | 0.166 | 0.146 | 0.129 | 0.113 | 0.1 |
| 0.932250000000001 | 0.383 | 0.33 | 0.285 | 0.248 | 0.217 | 0.19 | 0.167 | 0.147 | 0.129 | 0.114 | 0.1 |
| 0.933000000000001 | 0.384 | 0.33 | 0.286 | 0.249 | 0.217 | 0.19 | 0.167 | 0.147 | 0.13 | 0.114 | 0.101 |
| 0.933750000000001 | 0.385 | 0.331 | 0.287 | 0.249 | 0.218 | 0.191 | 0.168 | 0.148 | 0.13 | 0.115 | 0.101 |
| 0.934500000000001 | 0.385 | 0.332 | 0.287 | 0.25 | 0.219 | 0.192 | 0.169 | 0.148 | 0.131 | 0.116 | 0.102 |
| 0.935250000000001 | 0.386 | 0.332 | 0.288 | 0.251 | 0.219 | 0.192 | 0.169 | 0.149 | 0.132 | 0.116 | 0.103 |
| 0.936000000000001 | 0.387 | 0.333 | 0.289 | 0.251 | 0.22 | 0.193 | 0.17 | 0.15 | 0.132 | 0.117 | 0.103 |
| 0.936750000000001 | 0.387 | 0.334 | 0.289 | 0.252 | 0.22 | 0.193 | 0.17 | 0.15 | 0.133 | 0.117 | 0.104 |
| 0.937500000000001 | 0.388 | 0.334 | 0.29 | 0.253 | 0.221 | 0.194 | 0.171 | 0.151 | 0.133 | 0.118 | 0.104 |
| 0.938250000000001 | 0.388 | 0.335 | 0.29 | 0.253 | 0.222 | 0.195 | 0.172 | 0.152 | 0.134 | 0.119 | 0.105 |
| 0.939000000000001 | 0.389 | 0.335 | 0.291 | 0.254 | 0.222 | 0.195 | 0.172 | 0.152 | 0.135 | 0.119 | 0.106 |
| 0.939750000000001 | 0.39 | 0.336 | 0.292 | 0.254 | 0.223 | 0.196 | 0.173 | 0.153 | 0.135 | 0.12 | 0.106 |
| 0.940500000000001 | 0.39 | 0.337 | 0.292 | 0.255 | 0.224 | 0.197 | 0.173 | 0.153 | 0.136 | 0.12 | 0.107 |
| 0.941250000000001 | 0.391 | 0.337 | 0.293 | 0.256 | 0.224 | 0.197 | 0.174 | 0.154 | 0.136 | 0.121 | 0.107 |
| 0.942000000000001 | 0.392 | 0.338 | 0.294 | 0.256 | 0.225 | 0.198 | 0.175 | 0.155 | 0.137 | 0.122 | 0.108 |
| 0.942750000000001 | 0.392 | 0.339 | 0.294 | 0.257 | 0.225 | 0.198 | 0.175 | 0.155 | 0.138 | 0.122 | 0.109 |
| 0.943500000000001 | 0.393 | 0.339 | 0.295 | 0.258 | 0.226 | 0.199 | 0.176 | 0.156 | 0.138 | 0.123 | 0.109 |
| 0.944250000000001 | 0.394 | 0.34 | 0.296 | 0.258 | 0.227 | 0.2 | 0.177 | 0.156 | 0.139 | 0.124 | 0.11 |
| 0.945000000000001 | 0.394 | 0.341 | 0.296 | 0.259 | 0.227 | 0.2 | 0.177 | 0.157 | 0.14 | 0.124 | 0.111 |
| 0.945750000000001 | 0.395 | 0.341 | 0.297 | 0.26 | 0.228 | 0.201 | 0.178 | 0.158 | 0.14 | 0.125 | 0.111 |
| 0.946500000000001 | 0.396 | 0.342 | 0.298 | 0.26 | 0.229 | 0.202 | 0.178 | 0.158 | 0.141 | 0.125 | 0.112 |
| 0.947250000000001 | 0.397 | 0.343 | 0.298 | 0.261 | 0.229 | 0.202 | 0.179 | 0.159 | 0.141 | 0.126 | 0.112 |
| 0.948000000000001 | 0.397 | 0.343 | 0.299 | 0.262 | 0.23 | 0.203 | 0.18 | 0.16 | 0.142 | 0.127 | 0.113 |
| 0.948750000000001 | 0.398 | 0.344 | 0.3 | 0.262 | 0.231 | 0.204 | 0.18 | 0.16 | 0.143 | 0.127 | 0.114 |
| 0.949500000000001 | 0.399 | 0.345 | 0.3 | 0.263 | 0.231 | 0.204 | 0.181 | 0.161 | 0.143 | 0.128 | 0.114 |
| 0.950250000000001 | 0.399 | 0.345 | 0.301 | 0.264 | 0.232 | 0.205 | 0.182 | 0.162 | 0.144 | 0.129 | 0.115 |
| 0.951000000000001 | 0.4 | 0.346 | 0.302 | 0.264 | 0.233 | 0.206 | 0.182 | 0.162 | 0.145 | 0.129 | 0.116 |
| 0.951750000000001 | 0.401 | 0.347 | 0.302 | 0.265 | 0.233 | 0.206 | 0.183 | 0.163 | 0.145 | 0.13 | 0.116 |
| 0.952500000000001 | 0.401 | 0.348 | 0.303 | 0.266 | 0.234 | 0.207 | 0.184 | 0.164 | 0.146 | 0.131 | 0.117 |
| 0.953250000000001 | 0.402 | 0.348 | 0.304 | 0.266 | 0.235 | 0.208 | 0.184 | 0.164 | 0.147 | 0.131 | 0.118 |
| 0.954000000000001 | 0.403 | 0.349 | 0.304 | 0.267 | 0.235 | 0.208 | 0.185 | 0.165 | 0.147 | 0.132 | 0.118 |
| 0.954750000000001 | 0.403 | 0.35 | 0.305 | 0.268 | 0.236 | 0.209 | 0.186 | 0.165 | 0.148 | 0.132 | 0.119 |
| 0.955500000000001 | 0.404 | 0.35 | 0.306 | 0.268 | 0.237 | 0.21 | 0.186 | 0.166 | 0.149 | 0.133 | 0.119 |
| 0.956250000000001 | 0.405 | 0.351 | 0.306 | 0.269 | 0.237 | 0.21 | 0.187 | 0.167 | 0.149 | 0.134 | 0.12 |
| 0.957000000000001 | 0.406 | 0.352 | 0.307 | 0.27 | 0.238 | 0.211 | 0.188 | 0.167 | 0.15 | 0.134 | 0.121 |
| 0.957750000000002 | 0.406 | 0.352 | 0.308 | 0.27 | 0.239 | 0.212 | 0.188 | 0.168 | 0.151 | 0.135 | 0.121 |
| 0.958500000000002 | 0.407 | 0.353 | 0.308 | 0.271 | 0.239 | 0.212 | 0.189 | 0.169 | 0.151 | 0.136 | 0.122 |
| 0.959250000000002 | 0.408 | 0.354 | 0.309 | 0.272 | 0.24 | 0.213 | 0.19 | 0.169 | 0.152 | 0.136 | 0.123 |
| 0.960000000000002 | 0.408 | 0.354 | 0.31 | 0.272 | 0.241 | 0.214 | 0.19 | 0.17 | 0.153 | 0.137 | 0.123 |
| 0.960750000000002 | 0.409 | 0.355 | 0.31 | 0.273 | 0.241 | 0.214 | 0.191 | 0.171 | 0.153 | 0.138 | 0.124 |
| 0.961500000000002 | 0.41 | 0.356 | 0.311 | 0.274 | 0.242 | 0.215 | 0.192 | 0.171 | 0.154 | 0.138 | 0.125 |
| 0.962250000000002 | 0.411 | 0.357 | 0.312 | 0.274 | 0.243 | 0.216 | 0.192 | 0.172 | 0.155 | 0.139 | 0.125 |
| 0.963000000000002 | 0.411 | 0.357 | 0.313 | 0.275 | 0.243 | 0.216 | 0.193 | 0.173 | 0.155 | 0.14 | 0.126 |
| 0.963750000000002 | 0.412 | 0.358 | 0.313 | 0.276 | 0.244 | 0.217 | 0.194 | 0.174 | 0.156 | 0.14 | 0.127 |
| 0.964500000000002 | 0.413 | 0.359 | 0.314 | 0.277 | 0.245 | 0.218 | 0.194 | 0.174 | 0.157 | 0.141 | 0.127 |
| 0.965250000000002 | 0.413 | 0.359 | 0.315 | 0.277 | 0.245 | 0.218 | 0.195 | 0.175 | 0.157 | 0.142 | 0.128 |
| 0.966000000000002 | 0.414 | 0.36 | 0.315 | 0.278 | 0.246 | 0.219 | 0.196 | 0.176 | 0.158 | 0.142 | 0.129 |
| 0.966750000000002 | 0.415 | 0.361 | 0.316 | 0.279 | 0.247 | 0.22 | 0.196 | 0.176 | 0.159 | 0.143 | 0.129 |
| 0.967500000000002 | 0.416 | 0.362 | 0.317 | 0.279 | 0.248 | 0.22 | 0.197 | 0.177 | 0.159 | 0.144 | 0.13 |
| 0.968250000000002 | 0.416 | 0.362 | 0.318 | 0.28 | 0.248 | 0.221 | 0.198 | 0.178 | 0.16 | 0.145 | 0.131 |
| 0.969000000000002 | 0.417 | 0.363 | 0.318 | 0.281 | 0.249 | 0.222 | 0.199 | 0.178 | 0.161 | 0.145 | 0.132 |
| 0.969750000000002 | 0.418 | 0.364 | 0.319 | 0.282 | 0.25 | 0.223 | 0.199 | 0.179 | 0.161 | 0.146 | 0.132 |
| 0.970500000000002 | 0.419 | 0.365 | 0.32 | 0.282 | 0.25 | 0.223 | 0.2 | 0.18 | 0.162 | 0.147 | 0.133 |
| 0.971250000000002 | 0.419 | 0.365 | 0.321 | 0.283 | 0.251 | 0.224 | 0.201 | 0.18 | 0.163 | 0.147 | 0.134 |
| 0.972000000000002 | 0.42 | 0.366 | 0.321 | 0.284 | 0.252 | 0.225 | 0.201 | 0.181 | 0.163 | 0.148 | 0.134 |
| 0.972750000000002 | 0.421 | 0.367 | 0.322 | 0.284 | 0.253 | 0.225 | 0.202 | 0.182 | 0.164 | 0.149 | 0.135 |
| 0.973500000000002 | 0.422 | 0.368 | 0.323 | 0.285 | 0.253 | 0.226 | 0.203 | 0.183 | 0.165 | 0.149 | 0.136 |
| 0.974250000000002 | 0.422 | 0.368 | 0.323 | 0.286 | 0.254 | 0.227 | 0.204 | 0.183 | 0.166 | 0.15 | 0.136 |
| 0.975000000000002 | 0.423 | 0.369 | 0.324 | 0.287 | 0.255 | 0.228 | 0.204 | 0.184 | 0.166 | 0.151 | 0.137 |
| 0.975750000000002 | 0.424 | 0.37 | 0.325 | 0.287 | 0.256 | 0.228 | 0.205 | 0.185 | 0.167 | 0.152 | 0.138 |
| 0.976500000000002 | 0.425 | 0.371 | 0.326 | 0.288 | 0.256 | 0.229 | 0.206 | 0.185 | 0.168 | 0.152 | 0.139 |
| 0.977250000000002 | 0.425 | 0.371 | 0.326 | 0.289 | 0.257 | 0.23 | 0.206 | 0.186 | 0.168 | 0.153 | 0.139 |
| 0.978000000000002 | 0.426 | 0.372 | 0.327 | 0.29 | 0.258 | 0.231 | 0.207 | 0.187 | 0.169 | 0.154 | 0.14 |
| 0.978750000000002 | 0.427 | 0.373 | 0.328 | 0.29 | 0.258 | 0.231 | 0.208 | 0.188 | 0.17 | 0.154 | 0.141 |
| 0.979500000000002 | 0.428 | 0.374 | 0.329 | 0.291 | 0.259 | 0.232 | 0.209 | 0.188 | 0.171 | 0.155 | 0.141 |
| 0.980250000000002 | 0.429 | 0.374 | 0.329 | 0.292 | 0.26 | 0.233 | 0.209 | 0.189 | 0.171 | 0.156 | 0.142 |
| 0.981000000000002 | 0.429 | 0.375 | 0.33 | 0.293 | 0.261 | 0.233 | 0.21 | 0.19 | 0.172 | 0.157 | 0.143 |
| 0.981750000000002 | 0.43 | 0.376 | 0.331 | 0.293 | 0.261 | 0.234 | 0.211 | 0.191 | 0.173 | 0.157 | 0.144 |
| 0.982500000000002 | 0.431 | 0.377 | 0.332 | 0.294 | 0.262 | 0.235 | 0.212 | 0.191 | 0.174 | 0.158 | 0.144 |
| 0.983250000000002 | 0.432 | 0.377 | 0.332 | 0.295 | 0.263 | 0.236 | 0.212 | 0.192 | 0.174 | 0.159 | 0.145 |
| 0.984000000000003 | 0.432 | 0.378 | 0.333 | 0.296 | 0.264 | 0.236 | 0.213 | 0.193 | 0.175 | 0.159 | 0.146 |
| 0.984750000000003 | 0.433 | 0.379 | 0.334 | 0.296 | 0.264 | 0.237 | 0.214 | 0.193 | 0.176 | 0.16 | 0.146 |
| 0.985500000000003 | 0.434 | 0.38 | 0.335 | 0.297 | 0.265 | 0.238 | 0.215 | 0.194 | 0.177 | 0.161 | 0.147 |
| 0.986250000000003 | 0.435 | 0.381 | 0.336 | 0.298 | 0.266 | 0.239 | 0.215 | 0.195 | 0.177 | 0.162 | 0.148 |
| 0.987000000000003 | 0.436 | 0.381 | 0.336 | 0.299 | 0.267 | 0.239 | 0.216 | 0.196 | 0.178 | 0.162 | 0.149 |
| 0.987750000000003 | 0.436 | 0.382 | 0.337 | 0.299 | 0.267 | 0.24 | 0.217 | 0.196 | 0.179 | 0.163 | 0.149 |
| 0.988500000000003 | 0.437 | 0.383 | 0.338 | 0.3 | 0.268 | 0.241 | 0.218 | 0.197 | 0.179 | 0.164 | 0.15 |
| 0.989250000000003 | 0.438 | 0.384 | 0.339 | 0.301 | 0.269 | 0.242 | 0.218 | 0.198 | 0.18 | 0.165 | 0.151 |
| 0.990000000000003 | 0.439 | 0.384 | 0.339 | 0.302 | 0.27 | 0.243 | 0.219 | 0.199 | 0.181 | 0.165 | 0.152 |
| 0.990750000000003 | 0.44 | 0.385 | 0.34 | 0.302 | 0.271 | 0.243 | 0.22 | 0.199 | 0.182 | 0.166 | 0.152 |
| 0.991500000000003 | 0.44 | 0.386 | 0.341 | 0.303 | 0.271 | 0.244 | 0.221 | 0.2 | 0.183 | 0.167 | 0.153 |
| 0.992250000000003 | 0.441 | 0.387 | 0.342 | 0.304 | 0.272 | 0.245 | 0.221 | 0.201 | 0.183 | 0.168 | 0.154 |
| 0.993000000000003 | 0.442 | 0.388 | 0.343 | 0.305 | 0.273 | 0.246 | 0.222 | 0.202 | 0.184 | 0.168 | 0.155 |
| 0.993750000000003 | 0.443 | 0.388 | 0.343 | 0.306 | 0.274 | 0.246 | 0.223 | 0.203 | 0.185 | 0.169 | 0.155 |
| 0.994500000000003 | 0.444 | 0.389 | 0.344 | 0.306 | 0.274 | 0.247 | 0.224 | 0.203 | 0.186 | 0.17 | 0.156 |
| 0.995250000000003 | 0.444 | 0.39 | 0.345 | 0.307 | 0.275 | 0.248 | 0.224 | 0.204 | 0.186 | 0.171 | 0.157 |
| 0.996000000000003 | 0.445 | 0.391 | 0.346 | 0.308 | 0.276 | 0.249 | 0.225 | 0.205 | 0.187 | 0.172 | 0.158 |
| 0.996750000000003 | 0.446 | 0.392 | 0.347 | 0.309 | 0.277 | 0.25 | 0.226 | 0.206 | 0.188 | 0.172 | 0.159 |
| 0.997500000000003 | 0.447 | 0.393 | 0.347 | 0.31 | 0.278 | 0.25 | 0.227 | 0.206 | 0.189 | 0.173 | 0.159 |
| 0.998250000000003 | 0.448 | 0.393 | 0.348 | 0.31 | 0.278 | 0.251 | 0.228 | 0.207 | 0.189 | 0.174 | 0.16 |
| 0.999000000000003 | 0.449 | 0.394 | 0.349 | 0.311 | 0.279 | 0.252 | 0.228 | 0.208 | 0.19 | 0.175 | 0.161 |
| 0.999750000000003 | 0.449 | 0.395 | 0.35 | 0.312 | 0.28 | 0.253 | 0.229 | 0.209 | 0.191 | 0.175 | 0.162 |
| 1.000500000000003 | 0.45 | 0.396 | 0.351 | 0.313 | 0.281 | 0.253 | 0.23 | 0.21 | 0.192 | 0.176 | 0.162 |
| 1.001250000000003 | 0.451 | 0.397 | 0.351 | 0.314 | 0.282 | 0.254 | 0.231 | 0.21 | 0.193 | 0.177 | 0.163 |
| 1.002000000000003 | 0.452 | 0.397 | 0.352 | 0.314 | 0.282 | 0.255 | 0.232 | 0.211 | 0.193 | 0.178 | 0.164 |
| 1.002750000000003 | 0.453 | 0.398 | 0.353 | 0.315 | 0.283 | 0.256 | 0.232 | 0.212 | 0.194 | 0.179 | 0.165 |
| 1.003500000000003 | 0.454 | 0.399 | 0.354 | 0.316 | 0.284 | 0.257 | 0.233 | 0.213 | 0.195 | 0.179 | 0.166 |
| 1.004250000000003 | 0.454 | 0.4 | 0.355 | 0.317 | 0.285 | 0.258 | 0.234 | 0.214 | 0.196 | 0.18 | 0.166 |
| 1.005000000000003 | 0.455 | 0.401 | 0.356 | 0.318 | 0.286 | 0.258 | 0.235 | 0.214 | 0.197 | 0.181 | 0.167 |
| 1.005750000000003 | 0.456 | 0.402 | 0.356 | 0.319 | 0.286 | 0.259 | 0.236 | 0.215 | 0.197 | 0.182 | 0.168 |
| 1.006500000000003 | 0.457 | 0.402 | 0.357 | 0.319 | 0.287 | 0.26 | 0.236 | 0.216 | 0.198 | 0.183 | 0.169 |
| 1.007250000000003 | 0.458 | 0.403 | 0.358 | 0.32 | 0.288 | 0.261 | 0.237 | 0.217 | 0.199 | 0.183 | 0.17 |
| 1.008000000000003 | 0.459 | 0.404 | 0.359 | 0.321 | 0.289 | 0.262 | 0.238 | 0.218 | 0.2 | 0.184 | 0.17 |
| 1.008750000000003 | 0.46 | 0.405 | 0.36 | 0.322 | 0.29 | 0.262 | 0.239 | 0.218 | 0.201 | 0.185 | 0.171 |
| 1.009500000000003 | 0.46 | 0.406 | 0.361 | 0.323 | 0.291 | 0.263 | 0.24 | 0.219 | 0.201 | 0.186 | 0.172 |
| 1.010250000000003 | 0.461 | 0.407 | 0.361 | 0.324 | 0.291 | 0.264 | 0.24 | 0.22 | 0.202 | 0.187 | 0.173 |
| 1.011000000000003 | 0.462 | 0.408 | 0.362 | 0.324 | 0.292 | 0.265 | 0.241 | 0.221 | 0.203 | 0.187 | 0.174 |
| 1.011750000000003 | 0.463 | 0.408 | 0.363 | 0.325 | 0.293 | 0.266 | 0.242 | 0.222 | 0.204 | 0.188 | 0.174 |
| 1.012500000000004 | 0.464 | 0.409 | 0.364 | 0.326 | 0.294 | 0.267 | 0.243 | 0.223 | 0.205 | 0.189 | 0.175 |
| 1.013250000000004 | 0.465 | 0.41 | 0.365 | 0.327 | 0.295 | 0.267 | 0.244 | 0.223 | 0.205 | 0.19 | 0.176 |
| 1.014000000000004 | 0.466 | 0.411 | 0.366 | 0.328 | 0.296 | 0.268 | 0.245 | 0.224 | 0.206 | 0.191 | 0.177 |
| 1.014750000000004 | 0.467 | 0.412 | 0.367 | 0.329 | 0.296 | 0.269 | 0.245 | 0.225 | 0.207 | 0.191 | 0.178 |
| 1.015500000000004 | 0.467 | 0.413 | 0.367 | 0.329 | 0.297 | 0.27 | 0.246 | 0.226 | 0.208 | 0.192 | 0.178 |
| 1.016250000000004 | 0.468 | 0.414 | 0.368 | 0.33 | 0.298 | 0.271 | 0.247 | 0.227 | 0.209 | 0.193 | 0.179 |
| 1.017000000000004 | 0.469 | 0.414 | 0.369 | 0.331 | 0.299 | 0.272 | 0.248 | 0.228 | 0.21 | 0.194 | 0.18 |
| 1.017750000000004 | 0.47 | 0.415 | 0.37 | 0.332 | 0.3 | 0.272 | 0.249 | 0.228 | 0.21 | 0.195 | 0.181 |
| 1.018500000000004 | 0.471 | 0.416 | 0.371 | 0.333 | 0.301 | 0.273 | 0.25 | 0.229 | 0.211 | 0.196 | 0.182 |
| 1.019250000000004 | 0.472 | 0.417 | 0.372 | 0.334 | 0.302 | 0.274 | 0.251 | 0.23 | 0.212 | 0.196 | 0.183 |
| 1.020000000000004 | 0.473 | 0.418 | 0.373 | 0.335 | 0.302 | 0.275 | 0.251 | 0.231 | 0.213 | 0.197 | 0.183 |
| 1.020750000000004 | 0.474 | 0.419 | 0.374 | 0.336 | 0.303 | 0.276 | 0.252 | 0.232 | 0.214 | 0.198 | 0.184 |
| 1.021500000000004 | 0.475 | 0.42 | 0.374 | 0.336 | 0.304 | 0.277 | 0.253 | 0.233 | 0.215 | 0.199 | 0.185 |
| 1.022250000000004 | 0.475 | 0.421 | 0.375 | 0.337 | 0.305 | 0.278 | 0.254 | 0.233 | 0.216 | 0.2 | 0.186 |
| 1.023000000000004 | 0.476 | 0.422 | 0.376 | 0.338 | 0.306 | 0.278 | 0.255 | 0.234 | 0.216 | 0.201 | 0.187 |
| 1.023750000000004 | 0.477 | 0.422 | 0.377 | 0.339 | 0.307 | 0.279 | 0.256 | 0.235 | 0.217 | 0.202 | 0.188 |
| 1.024500000000004 | 0.478 | 0.423 | 0.378 | 0.34 | 0.308 | 0.28 | 0.257 | 0.236 | 0.218 | 0.202 | 0.189 |
| 1.025250000000004 | 0.479 | 0.424 | 0.379 | 0.341 | 0.309 | 0.281 | 0.257 | 0.237 | 0.219 | 0.203 | 0.189 |
| 1.026000000000004 | 0.48 | 0.425 | 0.38 | 0.342 | 0.309 | 0.282 | 0.258 | 0.238 | 0.22 | 0.204 | 0.19 |
| 1.026750000000004 | 0.481 | 0.426 | 0.381 | 0.343 | 0.31 | 0.283 | 0.259 | 0.239 | 0.221 | 0.205 | 0.191 |
| 1.027500000000004 | 0.482 | 0.427 | 0.382 | 0.343 | 0.311 | 0.284 | 0.26 | 0.24 | 0.222 | 0.206 | 0.192 |
| 1.028250000000004 | 0.483 | 0.428 | 0.382 | 0.344 | 0.312 | 0.285 | 0.261 | 0.24 | 0.222 | 0.207 | 0.193 |
| 1.029000000000004 | 0.484 | 0.429 | 0.383 | 0.345 | 0.313 | 0.285 | 0.262 | 0.241 | 0.223 | 0.208 | 0.194 |
| 1.029750000000004 | 0.485 | 0.43 | 0.384 | 0.346 | 0.314 | 0.286 | 0.263 | 0.242 | 0.224 | 0.208 | 0.195 |
| 1.030500000000004 | 0.485 | 0.431 | 0.385 | 0.347 | 0.315 | 0.287 | 0.264 | 0.243 | 0.225 | 0.209 | 0.195 |
| 1.031250000000004 | 0.486 | 0.432 | 0.386 | 0.348 | 0.316 | 0.288 | 0.264 | 0.244 | 0.226 | 0.21 | 0.196 |
| 1.032000000000004 | 0.487 | 0.432 | 0.387 | 0.349 | 0.317 | 0.289 | 0.265 | 0.245 | 0.227 | 0.211 | 0.197 |
| 1.032750000000004 | 0.488 | 0.433 | 0.388 | 0.35 | 0.317 | 0.29 | 0.266 | 0.246 | 0.228 | 0.212 | 0.198 |
| 1.033500000000004 | 0.489 | 0.434 | 0.389 | 0.351 | 0.318 | 0.291 | 0.267 | 0.247 | 0.229 | 0.213 | 0.199 |
| 1.034250000000004 | 0.49 | 0.435 | 0.39 | 0.352 | 0.319 | 0.292 | 0.268 | 0.247 | 0.23 | 0.214 | 0.2 |
| 1.035000000000004 | 0.491 | 0.436 | 0.391 | 0.352 | 0.32 | 0.293 | 0.269 | 0.248 | 0.23 | 0.215 | 0.201 |
| 1.035750000000004 | 0.492 | 0.437 | 0.392 | 0.353 | 0.321 | 0.294 | 0.27 | 0.249 | 0.231 | 0.216 | 0.202 |
| 1.036500000000004 | 0.493 | 0.438 | 0.392 | 0.354 | 0.322 | 0.294 | 0.271 | 0.25 | 0.232 | 0.216 | 0.203 |
| 1.037250000000004 | 0.494 | 0.439 | 0.393 | 0.355 | 0.323 | 0.295 | 0.272 | 0.251 | 0.233 | 0.217 | 0.203 |
| 1.038000000000004 | 0.495 | 0.44 | 0.394 | 0.356 | 0.324 | 0.296 | 0.273 | 0.252 | 0.234 | 0.218 | 0.204 |
| 1.038750000000004 | 0.496 | 0.441 | 0.395 | 0.357 | 0.325 | 0.297 | 0.273 | 0.253 | 0.235 | 0.219 | 0.205 |
| 1.039500000000005 | 0.497 | 0.442 | 0.396 | 0.358 | 0.326 | 0.298 | 0.274 | 0.254 | 0.236 | 0.22 | 0.206 |
| 1.040250000000005 | 0.498 | 0.443 | 0.397 | 0.359 | 0.327 | 0.299 | 0.275 | 0.255 | 0.237 | 0.221 | 0.207 |
| 1.041000000000005 | 0.499 | 0.444 | 0.398 | 0.36 | 0.328 | 0.3 | 0.276 | 0.256 | 0.238 | 0.222 | 0.208 |
| 1.041750000000005 | 0.5 | 0.445 | 0.399 | 0.361 | 0.328 | 0.301 | 0.277 | 0.257 | 0.239 | 0.223 | 0.209 |
| 1.042500000000005 | 0.501 | 0.446 | 0.4 | 0.362 | 0.329 | 0.302 | 0.278 | 0.257 | 0.239 | 0.224 | 0.21 |
| 1.043250000000005 | 0.502 | 0.447 | 0.401 | 0.363 | 0.33 | 0.303 | 0.279 | 0.258 | 0.24 | 0.225 | 0.211 |
| 1.044000000000005 | 0.503 | 0.447 | 0.402 | 0.364 | 0.331 | 0.304 | 0.28 | 0.259 | 0.241 | 0.226 | 0.212 |
| 1.044750000000005 | 0.504 | 0.448 | 0.403 | 0.365 | 0.332 | 0.305 | 0.281 | 0.26 | 0.242 | 0.226 | 0.213 |
| 1.045500000000005 | 0.504 | 0.449 | 0.404 | 0.366 | 0.333 | 0.306 | 0.282 | 0.261 | 0.243 | 0.227 | 0.213 |
| 1.046250000000005 | 0.505 | 0.45 | 0.405 | 0.366 | 0.334 | 0.306 | 0.283 | 0.262 | 0.244 | 0.228 | 0.214 |
| 1.047000000000005 | 0.506 | 0.451 | 0.406 | 0.367 | 0.335 | 0.307 | 0.284 | 0.263 | 0.245 | 0.229 | 0.215 |
| 1.047750000000005 | 0.507 | 0.452 | 0.407 | 0.368 | 0.336 | 0.308 | 0.285 | 0.264 | 0.246 | 0.23 | 0.216 |
| 1.048500000000005 | 0.508 | 0.453 | 0.408 | 0.369 | 0.337 | 0.309 | 0.286 | 0.265 | 0.247 | 0.231 | 0.217 |
| 1.049250000000005 | 0.509 | 0.454 | 0.409 | 0.37 | 0.338 | 0.31 | 0.286 | 0.266 | 0.248 | 0.232 | 0.218 |
| 1.050000000000005 | 0.51 | 0.455 | 0.41 | 0.371 | 0.339 | 0.311 | 0.287 | 0.267 | 0.249 | 0.233 | 0.219 |